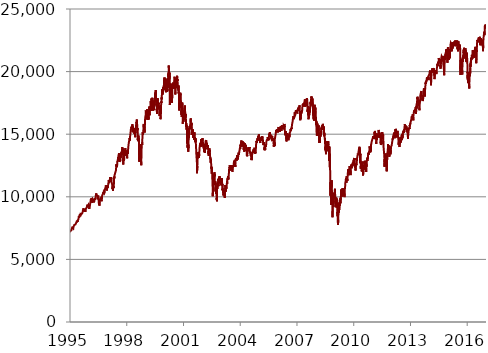
| Category | Series 0 |
|---|---|
| 1995-01-03 | 7172.683 |
| 1995-01-04 | 7190.548 |
| 1995-01-05 | 7191.054 |
| 1995-01-06 | 7201.079 |
| 1995-01-09 | 7208.079 |
| 1995-01-10 | 7220.305 |
| 1995-01-11 | 7222.76 |
| 1995-01-12 | 7222.839 |
| 1995-01-13 | 7284.208 |
| 1995-01-16 | 7338.687 |
| 1995-01-17 | 7361.699 |
| 1995-01-18 | 7356.045 |
| 1995-01-19 | 7310.672 |
| 1995-01-20 | 7278.697 |
| 1995-01-23 | 7275.497 |
| 1995-01-24 | 7288.911 |
| 1995-01-25 | 7303.149 |
| 1995-01-25 | 7310.466 |
| 1995-01-27 | 7331.988 |
| 1995-01-30 | 7302.151 |
| 1995-01-31 | 7334.776 |
| 1995-02-01 | 7310.312 |
| 1995-02-02 | 7349.527 |
| 1995-02-03 | 7437.83 |
| 1995-02-06 | 7478.464 |
| 1995-02-07 | 7478.527 |
| 1995-02-08 | 7486.398 |
| 1995-02-09 | 7480.373 |
| 1995-02-10 | 7503.419 |
| 1995-02-13 | 7498.907 |
| 1995-02-14 | 7509.996 |
| 1995-02-15 | 7541.813 |
| 1995-02-16 | 7543.911 |
| 1995-02-17 | 7499.948 |
| 1995-02-21 | 7501.668 |
| 1995-02-22 | 7530.029 |
| 1995-02-23 | 7564.275 |
| 1995-02-24 | 7578.614 |
| 1995-02-27 | 7516.006 |
| 1995-02-28 | 7577.715 |
| 1995-03-01 | 7529.735 |
| 1995-03-02 | 7523.729 |
| 1995-03-03 | 7527.487 |
| 1995-03-06 | 7522.078 |
| 1995-03-07 | 7467.209 |
| 1995-03-08 | 7481.185 |
| 1995-03-09 | 7484.487 |
| 1995-03-10 | 7570.125 |
| 1995-03-13 | 7577.53 |
| 1995-03-14 | 7617.322 |
| 1995-03-15 | 7608.769 |
| 1995-03-16 | 7651.8 |
| 1995-03-17 | 7647.273 |
| 1995-03-20 | 7654.961 |
| 1995-03-21 | 7642.304 |
| 1995-03-22 | 7641.801 |
| 1995-03-23 | 7648.829 |
| 1995-03-24 | 7721.48 |
| 1995-03-27 | 7755.88 |
| 1995-03-28 | 7767.357 |
| 1995-03-29 | 7757.688 |
| 1995-03-30 | 7755.849 |
| 1995-03-31 | 7735.882 |
| 1995-04-03 | 7721.042 |
| 1995-04-04 | 7754.968 |
| 1995-04-05 | 7763.383 |
| 1995-04-06 | 7765.797 |
| 1995-04-07 | 7768.978 |
| 1995-04-10 | 7782.909 |
| 1995-04-11 | 7775.857 |
| 1995-04-12 | 7798.422 |
| 1995-04-13 | 7830.703 |
| 1995-04-17 | 7793.69 |
| 1995-04-18 | 7770.686 |
| 1995-04-19 | 7744.767 |
| 1995-04-20 | 7757.679 |
| 1995-04-21 | 7804.58 |
| 1995-04-24 | 7857.013 |
| 1995-04-25 | 7848.253 |
| 1995-04-26 | 7859.05 |
| 1995-04-27 | 7875.394 |
| 1995-04-28 | 7891.362 |
| 1995-05-01 | 7868.004 |
| 1995-05-02 | 7873.399 |
| 1995-05-03 | 7944.934 |
| 1995-05-04 | 7941.415 |
| 1995-05-05 | 7935.269 |
| 1995-05-08 | 7984.298 |
| 1995-05-09 | 7985.549 |
| 1995-05-10 | 8003.957 |
| 1995-05-11 | 8013.074 |
| 1995-05-12 | 8038.723 |
| 1995-05-15 | 8072.097 |
| 1995-05-16 | 8087.956 |
| 1995-05-17 | 8073.286 |
| 1995-05-18 | 7970.473 |
| 1995-05-19 | 7961.715 |
| 1995-05-22 | 8021.16 |
| 1995-05-23 | 8089.222 |
| 1995-05-24 | 8092.475 |
| 1995-05-25 | 8086.611 |
| 1995-05-26 | 8021.989 |
| 1995-05-30 | 8007.663 |
| 1995-05-31 | 8121.205 |
| 1995-06-01 | 8120.213 |
| 1995-06-02 | 8120.993 |
| 1995-06-05 | 8171.362 |
| 1995-06-06 | 8170.863 |
| 1995-06-07 | 8144.266 |
| 1995-06-08 | 8139.895 |
| 1995-06-09 | 8080.349 |
| 1995-06-12 | 8122.82 |
| 1995-06-13 | 8194.323 |
| 1995-06-14 | 8203.937 |
| 1995-06-15 | 8223.682 |
| 1995-06-16 | 8261.268 |
| 1995-06-19 | 8332.771 |
| 1995-06-20 | 8336.813 |
| 1995-06-21 | 8332.365 |
| 1995-06-22 | 8429.981 |
| 1995-06-23 | 8412.484 |
| 1995-06-26 | 8328.806 |
| 1995-06-27 | 8301.663 |
| 1995-06-28 | 8324.155 |
| 1995-06-29 | 8324.233 |
| 1995-06-30 | 8348.676 |
| 1995-07-03 | 8377.177 |
| 1995-07-05 | 8391.943 |
| 1995-07-06 | 8484.798 |
| 1995-07-07 | 8540.599 |
| 1995-07-10 | 8554.054 |
| 1995-07-11 | 8524.007 |
| 1995-07-12 | 8618.408 |
| 1995-07-13 | 8624.62 |
| 1995-07-14 | 8613.117 |
| 1995-07-17 | 8651.092 |
| 1995-07-18 | 8585.286 |
| 1995-07-19 | 8445.153 |
| 1995-07-20 | 8489.216 |
| 1995-07-21 | 8504.777 |
| 1995-07-24 | 8558.814 |
| 1995-07-25 | 8630.817 |
| 1995-07-26 | 8646.488 |
| 1995-07-27 | 8709.375 |
| 1995-07-28 | 8685.025 |
| 1995-07-31 | 8681.279 |
| 1995-08-01 | 8618.886 |
| 1995-08-02 | 8603.458 |
| 1995-08-03 | 8594.538 |
| 1995-08-04 | 8603.832 |
| 1995-08-07 | 8625.409 |
| 1995-08-08 | 8629.706 |
| 1995-08-09 | 8629.908 |
| 1995-08-10 | 8605.591 |
| 1995-08-11 | 8578.986 |
| 1995-08-14 | 8638.252 |
| 1995-08-15 | 8630.671 |
| 1995-08-16 | 8668.983 |
| 1995-08-17 | 8671.988 |
| 1995-08-18 | 8680.534 |
| 1995-08-21 | 8665.216 |
| 1995-08-22 | 8678.495 |
| 1995-08-23 | 8657.883 |
| 1995-08-24 | 8654.318 |
| 1995-08-25 | 8687.229 |
| 1995-08-28 | 8666.897 |
| 1995-08-29 | 8663.815 |
| 1995-08-30 | 8694.312 |
| 1995-08-31 | 8721.493 |
| 1995-09-01 | 8735.536 |
| 1995-09-05 | 8816.034 |
| 1995-09-06 | 8847.513 |
| 1995-09-07 | 8856.214 |
| 1995-09-08 | 8897.869 |
| 1995-09-11 | 8925.355 |
| 1995-09-12 | 8957.128 |
| 1995-09-13 | 8978.119 |
| 1995-09-14 | 9038.699 |
| 1995-09-15 | 9019.697 |
| 1995-09-18 | 9011.571 |
| 1995-09-19 | 9041.34 |
| 1995-09-20 | 9078.847 |
| 1995-09-21 | 9035.156 |
| 1995-09-22 | 9000.804 |
| 1995-09-25 | 8985.686 |
| 1995-09-26 | 8972.697 |
| 1995-09-27 | 8945.506 |
| 1995-09-28 | 9023.566 |
| 1995-09-29 | 9021.919 |
| 1995-10-02 | 8939.016 |
| 1995-10-03 | 8926.333 |
| 1995-10-04 | 8888.22 |
| 1995-10-05 | 8910.459 |
| 1995-10-06 | 8916.112 |
| 1995-10-09 | 8822.185 |
| 1995-10-10 | 8796.043 |
| 1995-10-11 | 8853.623 |
| 1995-10-12 | 8919.472 |
| 1995-10-13 | 8959.227 |
| 1995-10-16 | 8940.705 |
| 1995-10-17 | 8993.096 |
| 1995-10-18 | 9013.724 |
| 1995-10-19 | 9043.722 |
| 1995-10-20 | 8995.419 |
| 1995-10-23 | 8952.769 |
| 1995-10-24 | 8972.205 |
| 1995-10-25 | 8902.236 |
| 1995-10-26 | 8809.95 |
| 1995-10-27 | 8851.47 |
| 1995-10-30 | 8908.028 |
| 1995-10-31 | 8890.729 |
| 1995-11-01 | 8929.649 |
| 1995-11-02 | 9023.994 |
| 1995-11-03 | 9053.066 |
| 1995-11-06 | 9034.888 |
| 1995-11-07 | 8988.305 |
| 1995-11-08 | 9055.096 |
| 1995-11-09 | 9090.584 |
| 1995-11-10 | 9086.833 |
| 1995-11-13 | 9072.7 |
| 1995-11-14 | 9016.602 |
| 1995-11-15 | 9061.605 |
| 1995-11-16 | 9113.891 |
| 1995-11-17 | 9155.112 |
| 1995-11-20 | 9101.431 |
| 1995-11-21 | 9123.266 |
| 1995-11-22 | 9103.384 |
| 1995-11-24 | 9131.666 |
| 1995-11-27 | 9149.719 |
| 1995-11-28 | 9222.88 |
| 1995-11-29 | 9257.686 |
| 1995-11-30 | 9251.58 |
| 1995-12-01 | 9274.06 |
| 1995-12-04 | 9371.707 |
| 1995-12-05 | 9417.499 |
| 1995-12-06 | 9433.006 |
| 1995-12-07 | 9373.49 |
| 1995-12-08 | 9392.765 |
| 1995-12-11 | 9418.243 |
| 1995-12-12 | 9394.719 |
| 1995-12-13 | 9435.192 |
| 1995-12-14 | 9357.735 |
| 1995-12-15 | 9337.033 |
| 1995-12-18 | 9173.839 |
| 1995-12-19 | 9259.173 |
| 1995-12-20 | 9215.831 |
| 1995-12-21 | 9286.233 |
| 1995-12-22 | 9308.78 |
| 1995-12-26 | 9346.539 |
| 1995-12-27 | 9351.843 |
| 1995-12-28 | 9349.501 |
| 1995-12-29 | 9392.843 |
| 1996-01-02 | 9398.077 |
| 1996-01-03 | 9397.738 |
| 1996-01-04 | 9317.757 |
| 1996-01-05 | 9306.041 |
| 1996-01-08 | 9325.682 |
| 1996-01-09 | 9183.603 |
| 1996-01-10 | 9018.97 |
| 1996-01-11 | 9101.633 |
| 1996-01-12 | 9091.905 |
| 1996-01-15 | 9048.6 |
| 1996-01-16 | 9135.519 |
| 1996-01-17 | 9129.383 |
| 1996-01-18 | 9163.592 |
| 1996-01-19 | 9222.745 |
| 1996-01-22 | 9255.768 |
| 1996-01-23 | 9253.486 |
| 1996-01-24 | 9355.035 |
| 1996-01-25 | 9317.218 |
| 1996-01-25 | 9381.15 |
| 1996-01-29 | 9413.263 |
| 1996-01-30 | 9499.102 |
| 1996-01-31 | 9576.462 |
| 1996-02-01 | 9589.253 |
| 1996-02-02 | 9566.295 |
| 1996-02-05 | 9629.284 |
| 1996-02-06 | 9697.097 |
| 1996-02-07 | 9731.903 |
| 1996-02-08 | 9811.287 |
| 1996-02-09 | 9820.323 |
| 1996-02-12 | 9874.491 |
| 1996-02-13 | 9853.592 |
| 1996-02-14 | 9812.133 |
| 1996-02-15 | 9779.217 |
| 1996-02-16 | 9747.562 |
| 1996-02-20 | 9643.698 |
| 1996-02-21 | 9746.332 |
| 1996-02-22 | 9910.541 |
| 1996-02-23 | 9901.198 |
| 1996-02-26 | 9806.877 |
| 1996-02-27 | 9764.434 |
| 1996-02-28 | 9745.748 |
| 1996-02-29 | 9692.195 |
| 1996-03-01 | 9674.592 |
| 1996-03-04 | 9748.661 |
| 1996-03-05 | 9816.142 |
| 1996-03-06 | 9786.575 |
| 1996-03-07 | 9803.208 |
| 1996-03-08 | 9518.534 |
| 1996-03-11 | 9616.361 |
| 1996-03-12 | 9567.379 |
| 1996-03-13 | 9598.581 |
| 1996-03-14 | 9641.494 |
| 1996-03-15 | 9655.054 |
| 1996-03-18 | 9806.113 |
| 1996-03-19 | 9794.479 |
| 1996-03-20 | 9767.74 |
| 1996-03-21 | 9758.675 |
| 1996-03-22 | 9776.684 |
| 1996-03-25 | 9755.48 |
| 1996-03-26 | 9781.591 |
| 1996-03-27 | 9744.671 |
| 1996-03-28 | 9752.514 |
| 1996-03-29 | 9732.043 |
| 1996-04-01 | 9796.917 |
| 1996-04-02 | 9821.36 |
| 1996-04-03 | 9831.137 |
| 1996-04-04 | 9840.457 |
| 1996-04-08 | 9674.993 |
| 1996-04-09 | 9666.937 |
| 1996-04-10 | 9560.44 |
| 1996-04-11 | 9503.178 |
| 1996-04-12 | 9574.862 |
| 1996-04-15 | 9657.129 |
| 1996-04-16 | 9705.543 |
| 1996-04-17 | 9663.922 |
| 1996-04-18 | 9705.116 |
| 1996-04-19 | 9735.361 |
| 1996-04-22 | 9785.922 |
| 1996-04-23 | 9849.793 |
| 1996-04-24 | 9847.904 |
| 1996-04-25 | 9890.79 |
| 1996-04-26 | 9910.694 |
| 1996-04-29 | 9920.791 |
| 1996-04-30 | 9921.446 |
| 1996-05-01 | 9924.646 |
| 1996-05-02 | 9772.419 |
| 1996-05-03 | 9760.259 |
| 1996-05-06 | 9747.141 |
| 1996-05-07 | 9707.47 |
| 1996-05-08 | 9766.81 |
| 1996-05-09 | 9785.673 |
| 1996-05-10 | 9889.96 |
| 1996-05-13 | 10023.263 |
| 1996-05-14 | 10093.806 |
| 1996-05-15 | 10094.946 |
| 1996-05-16 | 10095.448 |
| 1996-05-17 | 10155.473 |
| 1996-05-20 | 10213.035 |
| 1996-05-21 | 10203.474 |
| 1996-05-22 | 10270.794 |
| 1996-05-23 | 10241.443 |
| 1996-05-24 | 10273.166 |
| 1996-05-28 | 10178.972 |
| 1996-05-29 | 10116.865 |
| 1996-05-30 | 10166.31 |
| 1996-05-31 | 10149.529 |
| 1996-06-03 | 10122.424 |
| 1996-06-04 | 10182.41 |
| 1996-06-05 | 10254.731 |
| 1996-06-06 | 10184.385 |
| 1996-06-07 | 10168.542 |
| 1996-06-10 | 10156.222 |
| 1996-06-11 | 10142.627 |
| 1996-06-12 | 10133.877 |
| 1996-06-13 | 10107.249 |
| 1996-06-14 | 10069.532 |
| 1996-06-17 | 10050.498 |
| 1996-06-18 | 9978.238 |
| 1996-06-19 | 9958.126 |
| 1996-06-20 | 9932.349 |
| 1996-06-21 | 9987.884 |
| 1996-06-24 | 10021.029 |
| 1996-06-25 | 10005.976 |
| 1996-06-26 | 9919.315 |
| 1996-06-27 | 9974.319 |
| 1996-06-28 | 10044.954 |
| 1996-07-01 | 10107.691 |
| 1996-07-02 | 10082.053 |
| 1996-07-03 | 10050.533 |
| 1996-07-05 | 9852.042 |
| 1996-07-08 | 9762.879 |
| 1996-07-09 | 9794.779 |
| 1996-07-10 | 9777.101 |
| 1996-07-11 | 9604.202 |
| 1996-07-12 | 9595.788 |
| 1996-07-15 | 9340.261 |
| 1996-07-16 | 9288.47 |
| 1996-07-17 | 9425.649 |
| 1996-07-18 | 9575.305 |
| 1996-07-19 | 9506.215 |
| 1996-07-22 | 9414.202 |
| 1996-07-23 | 9295.672 |
| 1996-07-24 | 9247.338 |
| 1996-07-25 | 9345.385 |
| 1996-07-26 | 9430.697 |
| 1996-07-29 | 9361.547 |
| 1996-07-30 | 9405.59 |
| 1996-07-31 | 9471.253 |
| 1996-08-01 | 9596.417 |
| 1996-08-02 | 9778.837 |
| 1996-08-05 | 9749.208 |
| 1996-08-06 | 9783.74 |
| 1996-08-07 | 9821.207 |
| 1996-08-08 | 9805.894 |
| 1996-08-09 | 9796.572 |
| 1996-08-12 | 9820.027 |
| 1996-08-13 | 9758.469 |
| 1996-08-14 | 9790.489 |
| 1996-08-15 | 9809.359 |
| 1996-08-16 | 9840.743 |
| 1996-08-19 | 9854.937 |
| 1996-08-20 | 9842.907 |
| 1996-08-21 | 9830.847 |
| 1996-08-22 | 9914.407 |
| 1996-08-23 | 9880.148 |
| 1996-08-26 | 9844.284 |
| 1996-08-27 | 9889.817 |
| 1996-08-28 | 9887.653 |
| 1996-08-29 | 9797.056 |
| 1996-08-30 | 9736.149 |
| 1996-09-03 | 9721.379 |
| 1996-09-04 | 9736.644 |
| 1996-09-05 | 9645.927 |
| 1996-09-06 | 9729.027 |
| 1996-09-09 | 9828.222 |
| 1996-09-10 | 9838.177 |
| 1996-09-11 | 9877.427 |
| 1996-09-12 | 9935.094 |
| 1996-09-13 | 10062.934 |
| 1996-09-16 | 10110.48 |
| 1996-09-17 | 10109.318 |
| 1996-09-18 | 10087.144 |
| 1996-09-19 | 10109.137 |
| 1996-09-20 | 10161.118 |
| 1996-09-23 | 10142.504 |
| 1996-09-24 | 10141.946 |
| 1996-09-25 | 10159.097 |
| 1996-09-26 | 10180.622 |
| 1996-09-27 | 10188.466 |
| 1996-09-30 | 10205.541 |
| 1996-10-01 | 10184.629 |
| 1996-10-02 | 10255.783 |
| 1996-10-03 | 10242.235 |
| 1996-10-04 | 10353.657 |
| 1996-10-07 | 10371.4 |
| 1996-10-08 | 10328.591 |
| 1996-10-09 | 10274.037 |
| 1996-10-10 | 10249.858 |
| 1996-10-11 | 10324.621 |
| 1996-10-14 | 10370.167 |
| 1996-10-15 | 10362.423 |
| 1996-10-16 | 10369.355 |
| 1996-10-17 | 10398.677 |
| 1996-10-18 | 10441.185 |
| 1996-10-21 | 10416.555 |
| 1996-10-22 | 10345.642 |
| 1996-10-23 | 10346.153 |
| 1996-10-24 | 10291.164 |
| 1996-10-25 | 10276.549 |
| 1996-10-28 | 10213.815 |
| 1996-10-29 | 10244.686 |
| 1996-10-30 | 10237.769 |
| 1996-10-31 | 10302.141 |
| 1996-11-01 | 10268.336 |
| 1996-11-04 | 10297.377 |
| 1996-11-05 | 10386.136 |
| 1996-11-06 | 10526.643 |
| 1996-11-07 | 10574.55 |
| 1996-11-08 | 10610.675 |
| 1996-11-11 | 10629.795 |
| 1996-11-12 | 10607.283 |
| 1996-11-13 | 10630.5 |
| 1996-11-14 | 10687.667 |
| 1996-11-15 | 10698.158 |
| 1996-11-18 | 10683.6 |
| 1996-11-19 | 10736.744 |
| 1996-11-20 | 10768.201 |
| 1996-11-21 | 10740.886 |
| 1996-11-22 | 10821.856 |
| 1996-11-25 | 10925.113 |
| 1996-11-26 | 10915.597 |
| 1996-11-27 | 10910.284 |
| 1996-11-29 | 10944.263 |
| 1996-12-02 | 10949.381 |
| 1996-12-03 | 10881.679 |
| 1996-12-04 | 10835.543 |
| 1996-12-05 | 10834.763 |
| 1996-12-06 | 10758.581 |
| 1996-12-09 | 10901.685 |
| 1996-12-10 | 10881.469 |
| 1996-12-11 | 10772.764 |
| 1996-12-12 | 10643.227 |
| 1996-12-13 | 10614.892 |
| 1996-12-16 | 10503.711 |
| 1996-12-17 | 10548 |
| 1996-12-18 | 10630.711 |
| 1996-12-19 | 10809.684 |
| 1996-12-20 | 10839.926 |
| 1996-12-23 | 10808.288 |
| 1996-12-24 | 10853.958 |
| 1996-12-26 | 10912.386 |
| 1996-12-27 | 10939.31 |
| 1996-12-30 | 10917.308 |
| 1996-12-31 | 10803.381 |
| 1997-01-02 | 10693.891 |
| 1997-01-03 | 10836.739 |
| 1997-01-06 | 10851.94 |
| 1997-01-07 | 10920.327 |
| 1997-01-08 | 10876.176 |
| 1997-01-09 | 10960.407 |
| 1997-01-10 | 11015.449 |
| 1997-01-13 | 11011.44 |
| 1997-01-14 | 11128.241 |
| 1997-01-15 | 11110.811 |
| 1997-01-16 | 11142.499 |
| 1997-01-17 | 11223.558 |
| 1997-01-20 | 11243.112 |
| 1997-01-21 | 11322.002 |
| 1997-01-22 | 11362.726 |
| 1997-01-23 | 11273.932 |
| 1997-01-24 | 11171.763 |
| 1997-01-27 | 11091.137 |
| 1997-01-28 | 11093.546 |
| 1997-01-29 | 11167.065 |
| 1997-01-30 | 11305.784 |
| 1997-01-31 | 11334.21 |
| 1997-02-03 | 11315.063 |
| 1997-02-04 | 11323.833 |
| 1997-02-05 | 11183.221 |
| 1997-02-06 | 11203.385 |
| 1997-02-07 | 11309.336 |
| 1997-02-10 | 11249.426 |
| 1997-02-11 | 11277.002 |
| 1997-02-12 | 11452.11 |
| 1997-02-13 | 11569.544 |
| 1997-02-14 | 11540.417 |
| 1997-02-18 | 11622.013 |
| 1997-02-19 | 11592.99 |
| 1997-02-20 | 11464.936 |
| 1997-02-21 | 11437.658 |
| 1997-02-24 | 11524.817 |
| 1997-02-25 | 11554.884 |
| 1997-02-26 | 11472.408 |
| 1997-02-27 | 11338.672 |
| 1997-02-28 | 11274.288 |
| 1997-03-03 | 11293.857 |
| 1997-03-04 | 11266.915 |
| 1997-03-05 | 11394.083 |
| 1997-03-06 | 11365.504 |
| 1997-03-07 | 11436.08 |
| 1997-03-10 | 11540.1 |
| 1997-03-11 | 11516.46 |
| 1997-03-12 | 11418.481 |
| 1997-03-13 | 11236.744 |
| 1997-03-14 | 11278.102 |
| 1997-03-17 | 11271.765 |
| 1997-03-18 | 11184.333 |
| 1997-03-19 | 11110.945 |
| 1997-03-20 | 11089.046 |
| 1997-03-21 | 11110.201 |
| 1997-03-24 | 11159.845 |
| 1997-03-25 | 11153.716 |
| 1997-03-26 | 11183.574 |
| 1997-03-27 | 10974.479 |
| 1997-03-31 | 10731.523 |
| 1997-04-01 | 10731.335 |
| 1997-04-02 | 10609.868 |
| 1997-04-03 | 10605.321 |
| 1997-04-04 | 10718.765 |
| 1997-04-07 | 10806.474 |
| 1997-04-08 | 10855.15 |
| 1997-04-09 | 10799.951 |
| 1997-04-10 | 10754.677 |
| 1997-04-11 | 10489.961 |
| 1997-04-14 | 10545.769 |
| 1997-04-15 | 10676.478 |
| 1997-04-16 | 10761.899 |
| 1997-04-17 | 10747.887 |
| 1997-04-18 | 10801.244 |
| 1997-04-21 | 10696.418 |
| 1997-04-22 | 10847.037 |
| 1997-04-23 | 10841.985 |
| 1997-04-24 | 10824.17 |
| 1997-04-25 | 10722.554 |
| 1997-04-28 | 10808.316 |
| 1997-04-29 | 11068.679 |
| 1997-04-30 | 11172.435 |
| 1997-05-01 | 11169.17 |
| 1997-05-02 | 11382.223 |
| 1997-05-05 | 11622.484 |
| 1997-05-06 | 11597.15 |
| 1997-05-07 | 11458.464 |
| 1997-05-08 | 11515.601 |
| 1997-05-09 | 11568.678 |
| 1997-05-12 | 11724.447 |
| 1997-05-13 | 11669.942 |
| 1997-05-14 | 11707.616 |
| 1997-05-15 | 11781.479 |
| 1997-05-16 | 11644.949 |
| 1997-05-19 | 11687.56 |
| 1997-05-20 | 11785.924 |
| 1997-05-21 | 11784.497 |
| 1997-05-22 | 11742.897 |
| 1997-05-23 | 11894.592 |
| 1997-05-27 | 11933.664 |
| 1997-05-28 | 11913.518 |
| 1997-05-29 | 11895.558 |
| 1997-05-30 | 11951.357 |
| 1997-06-02 | 11945.295 |
| 1997-06-03 | 11929.14 |
| 1997-06-04 | 11870.352 |
| 1997-06-05 | 11918.716 |
| 1997-06-06 | 12087.401 |
| 1997-06-09 | 12146.916 |
| 1997-06-10 | 12168.492 |
| 1997-06-11 | 12216.559 |
| 1997-06-12 | 12375.563 |
| 1997-06-13 | 12487.985 |
| 1997-06-16 | 12502.716 |
| 1997-06-17 | 12524.366 |
| 1997-06-18 | 12472.008 |
| 1997-06-19 | 12598.21 |
| 1997-06-20 | 12598.73 |
| 1997-06-23 | 12369.282 |
| 1997-06-24 | 12563.612 |
| 1997-06-25 | 12483.932 |
| 1997-06-26 | 12420.333 |
| 1997-06-27 | 12472.884 |
| 1997-06-30 | 12468.592 |
| 1997-07-01 | 12519.14 |
| 1997-07-02 | 12667.565 |
| 1997-07-03 | 12812.653 |
| 1997-07-07 | 12770.415 |
| 1997-07-08 | 12858.776 |
| 1997-07-09 | 12741.555 |
| 1997-07-10 | 12817.013 |
| 1997-07-11 | 12876.958 |
| 1997-07-14 | 12904.246 |
| 1997-07-15 | 12997.027 |
| 1997-07-16 | 13155.58 |
| 1997-07-17 | 13084.838 |
| 1997-07-18 | 12899.323 |
| 1997-07-21 | 12854.074 |
| 1997-07-22 | 13101.449 |
| 1997-07-23 | 13145.273 |
| 1997-07-24 | 13190.996 |
| 1997-07-25 | 13178.019 |
| 1997-07-28 | 13151.665 |
| 1997-07-29 | 13219.396 |
| 1997-07-30 | 13358.448 |
| 1997-07-31 | 13394.145 |
| 1997-08-01 | 13289.442 |
| 1997-08-04 | 13330.121 |
| 1997-08-05 | 13382.642 |
| 1997-08-06 | 13486.084 |
| 1997-08-07 | 13377.549 |
| 1997-08-08 | 13147.719 |
| 1997-08-11 | 13159.946 |
| 1997-08-12 | 13050.109 |
| 1997-08-13 | 13004.027 |
| 1997-08-14 | 13037.363 |
| 1997-08-15 | 12776.936 |
| 1997-08-18 | 12891.244 |
| 1997-08-19 | 13066.185 |
| 1997-08-20 | 13243.494 |
| 1997-08-21 | 13078.634 |
| 1997-08-22 | 13050.02 |
| 1997-08-25 | 13030.554 |
| 1997-08-26 | 12959.13 |
| 1997-08-27 | 12980.95 |
| 1997-08-28 | 12881.178 |
| 1997-08-29 | 12848.907 |
| 1997-09-02 | 13144.45 |
| 1997-09-03 | 13164.133 |
| 1997-09-04 | 13202.348 |
| 1997-09-05 | 13206.763 |
| 1997-09-08 | 13243.516 |
| 1997-09-09 | 13283.784 |
| 1997-09-10 | 13128.635 |
| 1997-09-11 | 13052.294 |
| 1997-09-12 | 13201.137 |
| 1997-09-15 | 13168.962 |
| 1997-09-16 | 13462.13 |
| 1997-09-17 | 13448.811 |
| 1997-09-18 | 13508.54 |
| 1997-09-19 | 13544.569 |
| 1997-09-22 | 13617.869 |
| 1997-09-23 | 13578.443 |
| 1997-09-24 | 13508.436 |
| 1997-09-25 | 13433.483 |
| 1997-09-26 | 13506.916 |
| 1997-09-29 | 13607.621 |
| 1997-09-30 | 13555.673 |
| 1997-10-01 | 13614.327 |
| 1997-10-02 | 13679.153 |
| 1997-10-03 | 13757.603 |
| 1997-10-06 | 13854.465 |
| 1997-10-07 | 13973.554 |
| 1997-10-08 | 13878.886 |
| 1997-10-09 | 13860.843 |
| 1997-10-10 | 13822.884 |
| 1997-10-13 | 13841.238 |
| 1997-10-14 | 13850.606 |
| 1997-10-15 | 13794.986 |
| 1997-10-16 | 13666.014 |
| 1997-10-17 | 13484.633 |
| 1997-10-20 | 13639 |
| 1997-10-21 | 13852.668 |
| 1997-10-22 | 13826.582 |
| 1997-10-23 | 13563.937 |
| 1997-10-24 | 13458.606 |
| 1997-10-27 | 12574.768 |
| 1997-10-28 | 13109.16 |
| 1997-10-29 | 13110.559 |
| 1997-10-30 | 12908.616 |
| 1997-10-31 | 13058.195 |
| 1997-11-03 | 13373.54 |
| 1997-11-04 | 13407.247 |
| 1997-11-05 | 13450.049 |
| 1997-11-06 | 13385.345 |
| 1997-11-07 | 13209.129 |
| 1997-11-10 | 13143.025 |
| 1997-11-11 | 13155.214 |
| 1997-11-12 | 12896.151 |
| 1997-11-13 | 13004.908 |
| 1997-11-14 | 13165.517 |
| 1997-11-17 | 13405.184 |
| 1997-11-18 | 13304.813 |
| 1997-11-19 | 13364.048 |
| 1997-11-20 | 13547.486 |
| 1997-11-21 | 13589.227 |
| 1997-11-24 | 13363.532 |
| 1997-11-25 | 13403.725 |
| 1997-11-26 | 13424.241 |
| 1997-11-28 | 13474.81 |
| 1997-12-01 | 13734.654 |
| 1997-12-02 | 13700.079 |
| 1997-12-03 | 13767.931 |
| 1997-12-04 | 13750.267 |
| 1997-12-05 | 13883.243 |
| 1997-12-08 | 13888.334 |
| 1997-12-09 | 13786.009 |
| 1997-12-10 | 13683.049 |
| 1997-12-11 | 13466.076 |
| 1997-12-12 | 13425.731 |
| 1997-12-15 | 13521.518 |
| 1997-12-16 | 13605.265 |
| 1997-12-17 | 13593.105 |
| 1997-12-18 | 13440.694 |
| 1997-12-19 | 13344.951 |
| 1997-12-22 | 13427.206 |
| 1997-12-23 | 13272.036 |
| 1997-12-24 | 13202.589 |
| 1997-12-26 | 13245.916 |
| 1997-12-29 | 13457.296 |
| 1997-12-30 | 13692.139 |
| 1997-12-31 | 13721.373 |
| 1998-01-02 | 13739.367 |
| 1998-01-05 | 13765.218 |
| 1998-01-06 | 13622.738 |
| 1998-01-07 | 13570.566 |
| 1998-01-08 | 13464.527 |
| 1998-01-09 | 13073.249 |
| 1998-01-12 | 13166.193 |
| 1998-01-13 | 13353.981 |
| 1998-01-14 | 13450.136 |
| 1998-01-15 | 13374.146 |
| 1998-01-16 | 13525.316 |
| 1998-01-20 | 13745.112 |
| 1998-01-21 | 13648.706 |
| 1998-01-22 | 13546.497 |
| 1998-01-23 | 13472.304 |
| 1998-01-25 | 13438.352 |
| 1998-01-27 | 13574.778 |
| 1998-01-28 | 13706.844 |
| 1998-01-29 | 13805.341 |
| 1998-01-30 | 13758.663 |
| 1998-02-02 | 14003.015 |
| 1998-02-03 | 14063.707 |
| 1998-02-04 | 14103.697 |
| 1998-02-05 | 14087.583 |
| 1998-02-06 | 14182.943 |
| 1998-02-09 | 14175.68 |
| 1998-02-10 | 14292.666 |
| 1998-02-11 | 14308.295 |
| 1998-02-12 | 14358.018 |
| 1998-02-13 | 14330.584 |
| 1998-02-17 | 14355.71 |
| 1998-02-18 | 14470.138 |
| 1998-02-19 | 14437.308 |
| 1998-02-20 | 14494.397 |
| 1998-02-23 | 14548.796 |
| 1998-02-24 | 14458.803 |
| 1998-02-25 | 14616.853 |
| 1998-02-26 | 14701.774 |
| 1998-02-27 | 14711.815 |
| 1998-03-02 | 14676.093 |
| 1998-03-03 | 14712.062 |
| 1998-03-04 | 14668.462 |
| 1998-03-05 | 14491.744 |
| 1998-03-06 | 14771.937 |
| 1998-03-09 | 14722.716 |
| 1998-03-10 | 14881.237 |
| 1998-03-11 | 14942.403 |
| 1998-03-12 | 14972.473 |
| 1998-03-13 | 14964.489 |
| 1998-03-16 | 15091.855 |
| 1998-03-17 | 15104.799 |
| 1998-03-18 | 15178.35 |
| 1998-03-19 | 15240.265 |
| 1998-03-20 | 15344.165 |
| 1998-03-23 | 15297.953 |
| 1998-03-24 | 15419.493 |
| 1998-03-25 | 15390.979 |
| 1998-03-26 | 15382.79 |
| 1998-03-27 | 15325.366 |
| 1998-03-30 | 15296.265 |
| 1998-03-31 | 15401.163 |
| 1998-04-01 | 15472.44 |
| 1998-04-02 | 15604.287 |
| 1998-04-03 | 15631.811 |
| 1998-04-06 | 15605.869 |
| 1998-04-07 | 15434.267 |
| 1998-04-08 | 15361.012 |
| 1998-04-09 | 15484.803 |
| 1998-04-13 | 15479.383 |
| 1998-04-14 | 15587.339 |
| 1998-04-15 | 15649.637 |
| 1998-04-16 | 15513 |
| 1998-04-17 | 15684.617 |
| 1998-04-20 | 15714.689 |
| 1998-04-21 | 15756.392 |
| 1998-04-22 | 15794.639 |
| 1998-04-23 | 15635.165 |
| 1998-04-24 | 15475.618 |
| 1998-04-27 | 15154.225 |
| 1998-04-28 | 15181.91 |
| 1998-04-29 | 15315.574 |
| 1998-04-30 | 15541.022 |
| 1998-05-01 | 15618.942 |
| 1998-05-04 | 15633.929 |
| 1998-05-05 | 15548.439 |
| 1998-05-06 | 15422.874 |
| 1998-05-07 | 15292.819 |
| 1998-05-08 | 15458.739 |
| 1998-05-11 | 15423.195 |
| 1998-05-12 | 15502.295 |
| 1998-05-13 | 15531.186 |
| 1998-05-14 | 15523.554 |
| 1998-05-15 | 15406.191 |
| 1998-05-18 | 15331.229 |
| 1998-05-19 | 15401.79 |
| 1998-05-20 | 15480.861 |
| 1998-05-21 | 15417.42 |
| 1998-05-22 | 15348.774 |
| 1998-05-26 | 15120.334 |
| 1998-05-27 | 15065.637 |
| 1998-05-28 | 15150.425 |
| 1998-05-29 | 15080.434 |
| 1998-06-01 | 15011.87 |
| 1998-06-02 | 15042.347 |
| 1998-06-03 | 14932.532 |
| 1998-06-04 | 15078.052 |
| 1998-06-05 | 15293.784 |
| 1998-06-08 | 15334.833 |
| 1998-06-09 | 15373.298 |
| 1998-06-10 | 15267.411 |
| 1998-06-11 | 15042.172 |
| 1998-06-12 | 15064.865 |
| 1998-06-15 | 14757.104 |
| 1998-06-16 | 14915.767 |
| 1998-06-17 | 15168.255 |
| 1998-06-18 | 15133.894 |
| 1998-06-19 | 15078.972 |
| 1998-06-22 | 15136.713 |
| 1998-06-23 | 15337.36 |
| 1998-06-24 | 15509.925 |
| 1998-06-25 | 15467.576 |
| 1998-06-26 | 15505.12 |
| 1998-06-29 | 15598.405 |
| 1998-06-30 | 15572.207 |
| 1998-07-01 | 15732.814 |
| 1998-07-02 | 15700.595 |
| 1998-07-06 | 15833.51 |
| 1998-07-07 | 15809.051 |
| 1998-07-08 | 15951.65 |
| 1998-07-09 | 15868.631 |
| 1998-07-10 | 15921.561 |
| 1998-07-13 | 15940.609 |
| 1998-07-14 | 16079.344 |
| 1998-07-15 | 16065.051 |
| 1998-07-16 | 16170.196 |
| 1998-07-17 | 16198.505 |
| 1998-07-20 | 16176.876 |
| 1998-07-21 | 15941.353 |
| 1998-07-22 | 15873.459 |
| 1998-07-23 | 15565.798 |
| 1998-07-24 | 15547.654 |
| 1998-07-27 | 15562.852 |
| 1998-07-28 | 15336.504 |
| 1998-07-29 | 15269.922 |
| 1998-07-30 | 15492.682 |
| 1998-07-31 | 15198.192 |
| 1998-08-03 | 15054.193 |
| 1998-08-04 | 14525.936 |
| 1998-08-05 | 14579.34 |
| 1998-08-06 | 14731.54 |
| 1998-08-07 | 14809.068 |
| 1998-08-10 | 14716.842 |
| 1998-08-11 | 14483.778 |
| 1998-08-12 | 14696.025 |
| 1998-08-13 | 14572.945 |
| 1998-08-14 | 14441.766 |
| 1998-08-17 | 14661.763 |
| 1998-08-18 | 14888.577 |
| 1998-08-19 | 14833.264 |
| 1998-08-20 | 14732.021 |
| 1998-08-21 | 14562.748 |
| 1998-08-24 | 14619.066 |
| 1998-08-25 | 14661.224 |
| 1998-08-26 | 14491.718 |
| 1998-08-27 | 13922.148 |
| 1998-08-28 | 13719.588 |
| 1998-08-31 | 12798.478 |
| 1998-09-01 | 13225.576 |
| 1998-09-02 | 13225.59 |
| 1998-09-03 | 13085.201 |
| 1998-09-04 | 12994.441 |
| 1998-09-08 | 13610.048 |
| 1998-09-09 | 13383.7 |
| 1998-09-10 | 13041.858 |
| 1998-09-11 | 13395.471 |
| 1998-09-14 | 13645.418 |
| 1998-09-15 | 13754.685 |
| 1998-09-16 | 13864.811 |
| 1998-09-17 | 13564.755 |
| 1998-09-18 | 13620.553 |
| 1998-09-21 | 13649.914 |
| 1998-09-22 | 13753.39 |
| 1998-09-23 | 14210.902 |
| 1998-09-24 | 13918.47 |
| 1998-09-25 | 13932.641 |
| 1998-09-28 | 13973.322 |
| 1998-09-29 | 13968.157 |
| 1998-09-30 | 13599.209 |
| 1998-10-01 | 13139.834 |
| 1998-10-02 | 13306.426 |
| 1998-10-05 | 13064.622 |
| 1998-10-06 | 12992.284 |
| 1998-10-07 | 12761.074 |
| 1998-10-08 | 12512.303 |
| 1998-10-09 | 12846.286 |
| 1998-10-12 | 13082.039 |
| 1998-10-13 | 13005.201 |
| 1998-10-14 | 13150.429 |
| 1998-10-15 | 13693.851 |
| 1998-10-16 | 13841.387 |
| 1998-10-19 | 13966.687 |
| 1998-10-20 | 14026.02 |
| 1998-10-21 | 14107.967 |
| 1998-10-22 | 14227.287 |
| 1998-10-23 | 14151.915 |
| 1998-10-26 | 14200.813 |
| 1998-10-27 | 14147.271 |
| 1998-10-28 | 14152.714 |
| 1998-10-29 | 14378.916 |
| 1998-10-30 | 14560.806 |
| 1998-11-02 | 14782.988 |
| 1998-11-03 | 14765.673 |
| 1998-11-04 | 14884.369 |
| 1998-11-05 | 15062.34 |
| 1998-11-06 | 15174.796 |
| 1998-11-09 | 15059.786 |
| 1998-11-10 | 15025.228 |
| 1998-11-11 | 14937.098 |
| 1998-11-12 | 14895.53 |
| 1998-11-13 | 14960.161 |
| 1998-11-16 | 15071.267 |
| 1998-11-17 | 15116.986 |
| 1998-11-18 | 15209.092 |
| 1998-11-19 | 15308.282 |
| 1998-11-20 | 15431.884 |
| 1998-11-23 | 15720.598 |
| 1998-11-24 | 15651.307 |
| 1998-11-25 | 15728.856 |
| 1998-11-27 | 15820.919 |
| 1998-11-30 | 15457.791 |
| 1998-12-01 | 15585.265 |
| 1998-12-02 | 15542.96 |
| 1998-12-03 | 15312.03 |
| 1998-12-04 | 15602.939 |
| 1998-12-07 | 15756.069 |
| 1998-12-08 | 15697.353 |
| 1998-12-09 | 15710.249 |
| 1998-12-10 | 15462.662 |
| 1998-12-11 | 15457.608 |
| 1998-12-14 | 15137.799 |
| 1998-12-15 | 15381.653 |
| 1998-12-16 | 15383.904 |
| 1998-12-17 | 15585.555 |
| 1998-12-18 | 15711.731 |
| 1998-12-21 | 15911.741 |
| 1998-12-22 | 15921.689 |
| 1998-12-23 | 16226.032 |
| 1998-12-24 | 16220.629 |
| 1998-12-28 | 16252.754 |
| 1998-12-29 | 16432.78 |
| 1998-12-30 | 16355.721 |
| 1998-12-31 | 16436.469 |
| 1999-01-04 | 16381.401 |
| 1999-01-05 | 16560.569 |
| 1999-01-06 | 16894.247 |
| 1999-01-07 | 16862.62 |
| 1999-01-08 | 16953.501 |
| 1999-01-11 | 16868.676 |
| 1999-01-12 | 16574.462 |
| 1999-01-13 | 16479.453 |
| 1999-01-14 | 16208.477 |
| 1999-01-15 | 16589.24 |
| 1999-01-19 | 16700.519 |
| 1999-01-20 | 16753.818 |
| 1999-01-21 | 16470.702 |
| 1999-01-22 | 16356.96 |
| 1999-01-25 | 16451.318 |
| 1999-01-25 | 16681.989 |
| 1999-01-27 | 16581.865 |
| 1999-01-28 | 16835.731 |
| 1999-01-29 | 16986.446 |
| 1999-02-01 | 16915.192 |
| 1999-02-02 | 16768.828 |
| 1999-02-03 | 16913.962 |
| 1999-02-04 | 16634.619 |
| 1999-02-05 | 16468.446 |
| 1999-02-08 | 16491.555 |
| 1999-02-09 | 16136.013 |
| 1999-02-10 | 16175.574 |
| 1999-02-11 | 16564.411 |
| 1999-02-12 | 16268.312 |
| 1999-02-16 | 16363.394 |
| 1999-02-17 | 16129.082 |
| 1999-02-18 | 16286.472 |
| 1999-02-19 | 16323.312 |
| 1999-02-22 | 16715.159 |
| 1999-02-23 | 16723.537 |
| 1999-02-24 | 16536.281 |
| 1999-02-25 | 16421.723 |
| 1999-02-26 | 16330.923 |
| 1999-03-01 | 16269.174 |
| 1999-03-02 | 16175.274 |
| 1999-03-03 | 16183.151 |
| 1999-03-04 | 16400.74 |
| 1999-03-05 | 16736.378 |
| 1999-03-08 | 16845.742 |
| 1999-03-09 | 16813.197 |
| 1999-03-10 | 16903.187 |
| 1999-03-11 | 17019.952 |
| 1999-03-12 | 16965.681 |
| 1999-03-15 | 17117.184 |
| 1999-03-16 | 17106.696 |
| 1999-03-17 | 17012.205 |
| 1999-03-18 | 17213.378 |
| 1999-03-19 | 17015.812 |
| 1999-03-22 | 16967.484 |
| 1999-03-23 | 16516.74 |
| 1999-03-24 | 16599.142 |
| 1999-03-25 | 16881.447 |
| 1999-03-26 | 16819.169 |
| 1999-03-29 | 17157.549 |
| 1999-03-30 | 17027.194 |
| 1999-03-31 | 16889.627 |
| 1999-04-01 | 16855.302 |
| 1999-04-05 | 17171.817 |
| 1999-04-06 | 17134.408 |
| 1999-04-07 | 17193.93 |
| 1999-04-08 | 17417.954 |
| 1999-04-09 | 17499.89 |
| 1999-04-12 | 17650.199 |
| 1999-04-13 | 17597.194 |
| 1999-04-14 | 17344.998 |
| 1999-04-15 | 17305.083 |
| 1999-04-16 | 17280.191 |
| 1999-04-19 | 16861.832 |
| 1999-04-20 | 17063.5 |
| 1999-04-21 | 17484.179 |
| 1999-04-22 | 17770.532 |
| 1999-04-23 | 17751.298 |
| 1999-04-26 | 17838.433 |
| 1999-04-27 | 17851.05 |
| 1999-04-28 | 17702.274 |
| 1999-04-29 | 17617.201 |
| 1999-04-30 | 17557.808 |
| 1999-05-03 | 17740.084 |
| 1999-05-04 | 17483.978 |
| 1999-05-05 | 17646.203 |
| 1999-05-06 | 17472.55 |
| 1999-05-07 | 17608.938 |
| 1999-05-10 | 17602.679 |
| 1999-05-11 | 17809.316 |
| 1999-05-12 | 17917.332 |
| 1999-05-13 | 17972.701 |
| 1999-05-14 | 17609.339 |
| 1999-05-17 | 17607.104 |
| 1999-05-18 | 17553.154 |
| 1999-05-19 | 17692.75 |
| 1999-05-20 | 17641.334 |
| 1999-05-21 | 17549.315 |
| 1999-05-24 | 17209.913 |
| 1999-05-25 | 16917.917 |
| 1999-05-26 | 17142.085 |
| 1999-05-27 | 16899.485 |
| 1999-05-28 | 17153.055 |
| 1999-06-01 | 17046.786 |
| 1999-06-02 | 17035.458 |
| 1999-06-03 | 17082.276 |
| 1999-06-04 | 17404.535 |
| 1999-06-07 | 17529.408 |
| 1999-06-08 | 17330.576 |
| 1999-06-09 | 17359.621 |
| 1999-06-10 | 17160.589 |
| 1999-06-11 | 17022.038 |
| 1999-06-14 | 16941.992 |
| 1999-06-15 | 17018.457 |
| 1999-06-16 | 17393.85 |
| 1999-06-17 | 17531.098 |
| 1999-06-18 | 17570.999 |
| 1999-06-21 | 17679.803 |
| 1999-06-22 | 17528.62 |
| 1999-06-23 | 17497.685 |
| 1999-06-24 | 17290.875 |
| 1999-06-25 | 17273.489 |
| 1999-06-28 | 17461.951 |
| 1999-06-29 | 17727.652 |
| 1999-06-30 | 18022.183 |
| 1999-07-01 | 18053.673 |
| 1999-07-02 | 18185.597 |
| 1999-07-06 | 18170.247 |
| 1999-07-07 | 18217.396 |
| 1999-07-08 | 18205.702 |
| 1999-07-09 | 18332.042 |
| 1999-07-12 | 18280.081 |
| 1999-07-13 | 18218.51 |
| 1999-07-14 | 18295.959 |
| 1999-07-15 | 18449.844 |
| 1999-07-16 | 18529.849 |
| 1999-07-19 | 18387.331 |
| 1999-07-20 | 18000.798 |
| 1999-07-21 | 18036.31 |
| 1999-07-22 | 17806.432 |
| 1999-07-23 | 17758.269 |
| 1999-07-26 | 17583.608 |
| 1999-07-27 | 17777.632 |
| 1999-07-28 | 17816.727 |
| 1999-07-29 | 17513.413 |
| 1999-07-30 | 17405.878 |
| 1999-08-02 | 17297.859 |
| 1999-08-03 | 17181.194 |
| 1999-08-04 | 16926.568 |
| 1999-08-05 | 17023.86 |
| 1999-08-06 | 16869.817 |
| 1999-08-09 | 16809.49 |
| 1999-08-10 | 16615.134 |
| 1999-08-11 | 16866.512 |
| 1999-08-12 | 16855.586 |
| 1999-08-13 | 17200.938 |
| 1999-08-16 | 17249.171 |
| 1999-08-17 | 17418.242 |
| 1999-08-18 | 17300.409 |
| 1999-08-19 | 17179.969 |
| 1999-08-20 | 17336.178 |
| 1999-08-23 | 17616.887 |
| 1999-08-24 | 17654.493 |
| 1999-08-25 | 17864.177 |
| 1999-08-26 | 17656.359 |
| 1999-08-27 | 17488.484 |
| 1999-08-30 | 17192.918 |
| 1999-08-31 | 17153.944 |
| 1999-09-01 | 17195.266 |
| 1999-09-02 | 17039.603 |
| 1999-09-03 | 17509.328 |
| 1999-09-07 | 17469.817 |
| 1999-09-08 | 17388.186 |
| 1999-09-09 | 17442.71 |
| 1999-09-10 | 17504.649 |
| 1999-09-13 | 17407.537 |
| 1999-09-14 | 17312.821 |
| 1999-09-15 | 17091.519 |
| 1999-09-16 | 17058.472 |
| 1999-09-17 | 17271.212 |
| 1999-09-20 | 17262.847 |
| 1999-09-21 | 16931.249 |
| 1999-09-22 | 17003.197 |
| 1999-09-23 | 16592.845 |
| 1999-09-24 | 16552.866 |
| 1999-09-27 | 16618.221 |
| 1999-09-28 | 16583.46 |
| 1999-09-29 | 16456.462 |
| 1999-09-30 | 16606.596 |
| 1999-10-01 | 16562.118 |
| 1999-10-04 | 16830.433 |
| 1999-10-05 | 16810.904 |
| 1999-10-06 | 17112.901 |
| 1999-10-07 | 17032.661 |
| 1999-10-08 | 17223.142 |
| 1999-10-11 | 17260.927 |
| 1999-10-12 | 17006.89 |
| 1999-10-13 | 16634.857 |
| 1999-10-14 | 16629.904 |
| 1999-10-15 | 16198.844 |
| 1999-10-18 | 16212.147 |
| 1999-10-19 | 16323.096 |
| 1999-10-20 | 16650.566 |
| 1999-10-21 | 16585.185 |
| 1999-10-22 | 16805.385 |
| 1999-10-25 | 16734.627 |
| 1999-10-26 | 16609.526 |
| 1999-10-27 | 16773.162 |
| 1999-10-28 | 17306.354 |
| 1999-10-29 | 17617.973 |
| 1999-11-01 | 17542.163 |
| 1999-11-02 | 17494.359 |
| 1999-11-03 | 17610.758 |
| 1999-11-04 | 17728.289 |
| 1999-11-05 | 17847.516 |
| 1999-11-08 | 17946.236 |
| 1999-11-09 | 17797.449 |
| 1999-11-10 | 17896.311 |
| 1999-11-11 | 17958.923 |
| 1999-11-12 | 18163.321 |
| 1999-11-15 | 18166.376 |
| 1999-11-16 | 18496.522 |
| 1999-11-17 | 18390.136 |
| 1999-11-18 | 18595.977 |
| 1999-11-19 | 18564.65 |
| 1999-11-22 | 18567.125 |
| 1999-11-23 | 18331.852 |
| 1999-11-24 | 18497.724 |
| 1999-11-26 | 18530.027 |
| 1999-11-29 | 18412.059 |
| 1999-11-30 | 18176.814 |
| 1999-12-01 | 18277.966 |
| 1999-12-02 | 18481.304 |
| 1999-12-03 | 18783.743 |
| 1999-12-06 | 18697.201 |
| 1999-12-07 | 18615.622 |
| 1999-12-08 | 18588.298 |
| 1999-12-09 | 18646.158 |
| 1999-12-10 | 18746.73 |
| 1999-12-13 | 18735.699 |
| 1999-12-14 | 18511.712 |
| 1999-12-15 | 18602.95 |
| 1999-12-16 | 18703.608 |
| 1999-12-17 | 18741.285 |
| 1999-12-20 | 18737.848 |
| 1999-12-21 | 18970.632 |
| 1999-12-22 | 19055.676 |
| 1999-12-23 | 19309.561 |
| 1999-12-27 | 19272.421 |
| 1999-12-28 | 19308.614 |
| 1999-12-29 | 19424.56 |
| 1999-12-30 | 19429.524 |
| 1999-12-31 | 19535.613 |
| 2000-01-03 | 19333.617 |
| 2000-01-04 | 18569.351 |
| 2000-01-05 | 18583.523 |
| 2000-01-06 | 18521.054 |
| 2000-01-07 | 19032.623 |
| 2000-01-10 | 19350.877 |
| 2000-01-11 | 19053.662 |
| 2000-01-12 | 18933.307 |
| 2000-01-13 | 19224.698 |
| 2000-01-14 | 19453.253 |
| 2000-01-18 | 19402.586 |
| 2000-01-19 | 19470.555 |
| 2000-01-20 | 19423.146 |
| 2000-01-21 | 19450.559 |
| 2000-01-24 | 18942.938 |
| 2000-01-25 | 19047.063 |
| 2000-01-25 | 18968.927 |
| 2000-01-27 | 18889.748 |
| 2000-01-28 | 18356.59 |
| 2000-01-31 | 18656.977 |
| 2000-02-01 | 18774.422 |
| 2000-02-02 | 18807.421 |
| 2000-02-03 | 19073.306 |
| 2000-02-04 | 19070.292 |
| 2000-02-07 | 19125.104 |
| 2000-02-08 | 19364.439 |
| 2000-02-09 | 19001.252 |
| 2000-02-10 | 19109.516 |
| 2000-02-11 | 18764.371 |
| 2000-02-14 | 18810.253 |
| 2000-02-15 | 18928.553 |
| 2000-02-16 | 18815.664 |
| 2000-02-17 | 18900.601 |
| 2000-02-18 | 18398.17 |
| 2000-02-22 | 18434.127 |
| 2000-02-23 | 18636.748 |
| 2000-02-24 | 18623.276 |
| 2000-02-25 | 18423.908 |
| 2000-02-28 | 18586.618 |
| 2000-02-29 | 18940.146 |
| 2000-03-01 | 19038.726 |
| 2000-03-02 | 19037.252 |
| 2000-03-03 | 19464.512 |
| 2000-03-06 | 19294.874 |
| 2000-03-07 | 18886.675 |
| 2000-03-08 | 19003.438 |
| 2000-03-09 | 19474.009 |
| 2000-03-10 | 19398.442 |
| 2000-03-13 | 19135.204 |
| 2000-03-14 | 18715.73 |
| 2000-03-15 | 18921.17 |
| 2000-03-16 | 19746.104 |
| 2000-03-17 | 19845.473 |
| 2000-03-20 | 19539.175 |
| 2000-03-21 | 19946.525 |
| 2000-03-22 | 20189.826 |
| 2000-03-23 | 20486.03 |
| 2000-03-24 | 20510.208 |
| 2000-03-27 | 20443.818 |
| 2000-03-28 | 20172.182 |
| 2000-03-29 | 19999.957 |
| 2000-03-30 | 19651.364 |
| 2000-03-31 | 19876.951 |
| 2000-04-03 | 19622.814 |
| 2000-04-04 | 19392.329 |
| 2000-04-05 | 19382.282 |
| 2000-04-06 | 19657.581 |
| 2000-04-07 | 19927.794 |
| 2000-04-10 | 19569.316 |
| 2000-04-11 | 19415.729 |
| 2000-04-12 | 18878.915 |
| 2000-04-13 | 18530.345 |
| 2000-04-14 | 17334.229 |
| 2000-04-17 | 17855.049 |
| 2000-04-18 | 18521.341 |
| 2000-04-19 | 18371.908 |
| 2000-04-20 | 18410.843 |
| 2000-04-24 | 18240.067 |
| 2000-04-25 | 18909.124 |
| 2000-04-26 | 18688.518 |
| 2000-04-27 | 18821.999 |
| 2000-04-28 | 18816.955 |
| 2000-05-01 | 19051.946 |
| 2000-05-02 | 18678.702 |
| 2000-05-03 | 18291.94 |
| 2000-05-04 | 18295.437 |
| 2000-05-05 | 18578.673 |
| 2000-05-08 | 18409.9 |
| 2000-05-09 | 18208.719 |
| 2000-05-10 | 17750.312 |
| 2000-05-11 | 18100.613 |
| 2000-05-12 | 18252.911 |
| 2000-05-15 | 18650.596 |
| 2000-05-16 | 18877.843 |
| 2000-05-17 | 18622.782 |
| 2000-05-18 | 18432.621 |
| 2000-05-19 | 18016.435 |
| 2000-05-22 | 17895.129 |
| 2000-05-23 | 17502.815 |
| 2000-05-24 | 17771.464 |
| 2000-05-25 | 17552.725 |
| 2000-05-26 | 17511.642 |
| 2000-05-30 | 18155.062 |
| 2000-05-31 | 18116.671 |
| 2000-06-01 | 18457.219 |
| 2000-06-02 | 18962.911 |
| 2000-06-05 | 18886.186 |
| 2000-06-06 | 18840.264 |
| 2000-06-07 | 18950.443 |
| 2000-06-08 | 18840.264 |
| 2000-06-09 | 18839.38 |
| 2000-06-12 | 18627.237 |
| 2000-06-13 | 18898.681 |
| 2000-06-14 | 18874.34 |
| 2000-06-15 | 18967.205 |
| 2000-06-16 | 18825.132 |
| 2000-06-19 | 19131.935 |
| 2000-06-20 | 19078.53 |
| 2000-06-21 | 19139.418 |
| 2000-06-22 | 18784.36 |
| 2000-06-23 | 18608.515 |
| 2000-06-26 | 18781.75 |
| 2000-06-27 | 18690.128 |
| 2000-06-28 | 18818.615 |
| 2000-06-29 | 18688.264 |
| 2000-06-30 | 18802.93 |
| 2000-07-03 | 18940.945 |
| 2000-07-05 | 18637.814 |
| 2000-07-06 | 18798.967 |
| 2000-07-07 | 19077.165 |
| 2000-07-10 | 19045.772 |
| 2000-07-11 | 19078.433 |
| 2000-07-12 | 19310.499 |
| 2000-07-13 | 19403.163 |
| 2000-07-14 | 19585.833 |
| 2000-07-17 | 19610.931 |
| 2000-07-18 | 19352.761 |
| 2000-07-19 | 19141.26 |
| 2000-07-20 | 19390.228 |
| 2000-07-21 | 19136.99 |
| 2000-07-24 | 18873.709 |
| 2000-07-25 | 18973.895 |
| 2000-07-26 | 18735.051 |
| 2000-07-27 | 18589.767 |
| 2000-07-28 | 18178.199 |
| 2000-07-31 | 18362.425 |
| 2000-08-01 | 18407.496 |
| 2000-08-02 | 18412.662 |
| 2000-08-03 | 18600.511 |
| 2000-08-04 | 18761.099 |
| 2000-08-07 | 18975.961 |
| 2000-08-08 | 19000.797 |
| 2000-08-09 | 18885.886 |
| 2000-08-10 | 18712.391 |
| 2000-08-11 | 18876.988 |
| 2000-08-14 | 19112.856 |
| 2000-08-15 | 19022.727 |
| 2000-08-16 | 18988.317 |
| 2000-08-17 | 19203.633 |
| 2000-08-18 | 19157.06 |
| 2000-08-21 | 19243.002 |
| 2000-08-22 | 19242.933 |
| 2000-08-23 | 19352.458 |
| 2000-08-24 | 19418.302 |
| 2000-08-25 | 19410.67 |
| 2000-08-28 | 19503.059 |
| 2000-08-29 | 19487.59 |
| 2000-08-30 | 19457.905 |
| 2000-08-31 | 19670.672 |
| 2000-09-01 | 19637.133 |
| 2000-09-05 | 19461.439 |
| 2000-09-06 | 19246.019 |
| 2000-09-07 | 19397.677 |
| 2000-09-08 | 19253.789 |
| 2000-09-11 | 19179.296 |
| 2000-09-12 | 19099.638 |
| 2000-09-13 | 19144.133 |
| 2000-09-14 | 19149.738 |
| 2000-09-15 | 18929.535 |
| 2000-09-18 | 18606.775 |
| 2000-09-19 | 18836.954 |
| 2000-09-20 | 18764.873 |
| 2000-09-21 | 18688.668 |
| 2000-09-22 | 18743.948 |
| 2000-09-25 | 18643.158 |
| 2000-09-26 | 18478.674 |
| 2000-09-27 | 18452.226 |
| 2000-09-28 | 18892.124 |
| 2000-09-29 | 18655.121 |
| 2000-10-02 | 18498.36 |
| 2000-10-03 | 18281.957 |
| 2000-10-04 | 18402.245 |
| 2000-10-05 | 18361.246 |
| 2000-10-06 | 17978.399 |
| 2000-10-09 | 17920.437 |
| 2000-10-10 | 17666.524 |
| 2000-10-11 | 17373.062 |
| 2000-10-12 | 16901.323 |
| 2000-10-13 | 17514.772 |
| 2000-10-16 | 17553.309 |
| 2000-10-17 | 17221.132 |
| 2000-10-18 | 17091.912 |
| 2000-10-19 | 17705.676 |
| 2000-10-20 | 17862.448 |
| 2000-10-23 | 17864.514 |
| 2000-10-24 | 17847.92 |
| 2000-10-25 | 17419.656 |
| 2000-10-26 | 17426.66 |
| 2000-10-27 | 17593.295 |
| 2000-10-30 | 17737.003 |
| 2000-10-31 | 18214.406 |
| 2000-11-01 | 18119.067 |
| 2000-11-02 | 18304.611 |
| 2000-11-03 | 18297.297 |
| 2000-11-06 | 18326.992 |
| 2000-11-07 | 18324.354 |
| 2000-11-08 | 17982.292 |
| 2000-11-09 | 17813.715 |
| 2000-11-10 | 17348.358 |
| 2000-11-13 | 17120.923 |
| 2000-11-14 | 17564.145 |
| 2000-11-15 | 17672.551 |
| 2000-11-16 | 17391.671 |
| 2000-11-17 | 17308.723 |
| 2000-11-20 | 16900.502 |
| 2000-11-21 | 16900.639 |
| 2000-11-22 | 16556.977 |
| 2000-11-24 | 16889.66 |
| 2000-11-27 | 16944.758 |
| 2000-11-28 | 16676.416 |
| 2000-11-29 | 16708.095 |
| 2000-11-30 | 16374.017 |
| 2000-12-01 | 16467.149 |
| 2000-12-04 | 16531.157 |
| 2000-12-05 | 17259.888 |
| 2000-12-06 | 16960.721 |
| 2000-12-07 | 16866.548 |
| 2000-12-08 | 17327.644 |
| 2000-12-11 | 17526.236 |
| 2000-12-12 | 17353.814 |
| 2000-12-13 | 17162.363 |
| 2000-12-14 | 16865.755 |
| 2000-12-15 | 16544.468 |
| 2000-12-18 | 16659.42 |
| 2000-12-19 | 16399.693 |
| 2000-12-20 | 15828.09 |
| 2000-12-21 | 15917.366 |
| 2000-12-22 | 16390.733 |
| 2000-12-26 | 16489.515 |
| 2000-12-27 | 16710.816 |
| 2000-12-28 | 16861.446 |
| 2000-12-29 | 16656.534 |
| 2001-01-02 | 15991.877 |
| 2001-01-03 | 16829.73 |
| 2001-01-04 | 16617.881 |
| 2001-01-05 | 16139.698 |
| 2001-01-08 | 16090.474 |
| 2001-01-09 | 16172.759 |
| 2001-01-10 | 16400.485 |
| 2001-01-11 | 16621.986 |
| 2001-01-12 | 16559.304 |
| 2001-01-16 | 16677.246 |
| 2001-01-17 | 16734.313 |
| 2001-01-18 | 16921.979 |
| 2001-01-19 | 16834.759 |
| 2001-01-22 | 16842.848 |
| 2001-01-23 | 17106.694 |
| 2001-01-24 | 17170.898 |
| 2001-01-25 | 17045.127 |
| 2001-01-25 | 17029.684 |
| 2001-01-29 | 17183.704 |
| 2001-01-30 | 17290.512 |
| 2001-01-31 | 17171.075 |
| 2001-02-01 | 17183.658 |
| 2001-02-02 | 16837.43 |
| 2001-02-05 | 16887.162 |
| 2001-02-06 | 16897.561 |
| 2001-02-07 | 16759.468 |
| 2001-02-08 | 16645.868 |
| 2001-02-09 | 16416.164 |
| 2001-02-12 | 16591.18 |
| 2001-02-13 | 16448.105 |
| 2001-02-14 | 16443.23 |
| 2001-02-15 | 16591.519 |
| 2001-02-16 | 16287.955 |
| 2001-02-20 | 15987.112 |
| 2001-02-21 | 15701.868 |
| 2001-02-22 | 15630.878 |
| 2001-02-23 | 15571.817 |
| 2001-02-26 | 15871.983 |
| 2001-02-27 | 15695.572 |
| 2001-02-28 | 15469.7 |
| 2001-03-01 | 15440.201 |
| 2001-03-02 | 15365.847 |
| 2001-03-05 | 15447.077 |
| 2001-03-06 | 15608.376 |
| 2001-03-07 | 15702.494 |
| 2001-03-08 | 15689.391 |
| 2001-03-09 | 15308.19 |
| 2001-03-12 | 14656.86 |
| 2001-03-13 | 14879.68 |
| 2001-03-14 | 14514.933 |
| 2001-03-15 | 14566.471 |
| 2001-03-16 | 14264.798 |
| 2001-03-19 | 14528.172 |
| 2001-03-20 | 14190.525 |
| 2001-03-21 | 13925.665 |
| 2001-03-22 | 13862.955 |
| 2001-03-23 | 14151.335 |
| 2001-03-26 | 14309.891 |
| 2001-03-27 | 14647.796 |
| 2001-03-28 | 14279.347 |
| 2001-03-29 | 14209.019 |
| 2001-03-30 | 14381.625 |
| 2001-04-02 | 14104.326 |
| 2001-04-03 | 13594.665 |
| 2001-04-04 | 13548.028 |
| 2001-04-05 | 14171.698 |
| 2001-04-06 | 13884.231 |
| 2001-04-09 | 14008.373 |
| 2001-04-10 | 14399.813 |
| 2001-04-11 | 14381.863 |
| 2001-04-12 | 14602.98 |
| 2001-04-16 | 14539.146 |
| 2001-04-17 | 14698.663 |
| 2001-04-18 | 15263.829 |
| 2001-04-19 | 15481.353 |
| 2001-04-20 | 15352.596 |
| 2001-04-23 | 15103.894 |
| 2001-04-24 | 14934.999 |
| 2001-04-25 | 15183.458 |
| 2001-04-26 | 15259.765 |
| 2001-04-27 | 15485.982 |
| 2001-04-30 | 15490.799 |
| 2001-05-01 | 15628.724 |
| 2001-05-02 | 15672.513 |
| 2001-05-03 | 15432.178 |
| 2001-05-04 | 15655.22 |
| 2001-05-07 | 15603.97 |
| 2001-05-08 | 15588.82 |
| 2001-05-09 | 15515.147 |
| 2001-05-10 | 15505.476 |
| 2001-05-11 | 15392.77 |
| 2001-05-14 | 15413.277 |
| 2001-05-15 | 15428.91 |
| 2001-05-16 | 15850.025 |
| 2001-05-17 | 15934.441 |
| 2001-05-18 | 15971.652 |
| 2001-05-21 | 16264.523 |
| 2001-05-22 | 16242.354 |
| 2001-05-23 | 15970.514 |
| 2001-05-24 | 16034.449 |
| 2001-05-25 | 15873.064 |
| 2001-05-29 | 15711.573 |
| 2001-05-30 | 15440.603 |
| 2001-05-31 | 15552.011 |
| 2001-06-01 | 15607.719 |
| 2001-06-04 | 15687.995 |
| 2001-06-05 | 15917.173 |
| 2001-06-06 | 15763.255 |
| 2001-06-07 | 15848.091 |
| 2001-06-08 | 15694.962 |
| 2001-06-11 | 15546.233 |
| 2001-06-12 | 15554.644 |
| 2001-06-13 | 15391.071 |
| 2001-06-14 | 15094.87 |
| 2001-06-15 | 15028.06 |
| 2001-06-18 | 14938.866 |
| 2001-06-19 | 14970.318 |
| 2001-06-20 | 15128.033 |
| 2001-06-21 | 15276.656 |
| 2001-06-22 | 15127.619 |
| 2001-06-25 | 15048.347 |
| 2001-06-26 | 15049.818 |
| 2001-06-27 | 15016.039 |
| 2001-06-28 | 15210.756 |
| 2001-06-29 | 15254.243 |
| 2001-07-02 | 15391.379 |
| 2001-07-03 | 15360.268 |
| 2001-07-05 | 15175.703 |
| 2001-07-06 | 14831.128 |
| 2001-07-09 | 14917.946 |
| 2001-07-10 | 14701.009 |
| 2001-07-11 | 14676.857 |
| 2001-07-12 | 15030.431 |
| 2001-07-13 | 15115.867 |
| 2001-07-16 | 14944.954 |
| 2001-07-17 | 15100.834 |
| 2001-07-18 | 14998.662 |
| 2001-07-19 | 15080.464 |
| 2001-07-20 | 15036.009 |
| 2001-07-23 | 14808.626 |
| 2001-07-24 | 14562.495 |
| 2001-07-25 | 14763.715 |
| 2001-07-26 | 14935.553 |
| 2001-07-27 | 14972.753 |
| 2001-07-30 | 14956.916 |
| 2001-07-31 | 15030.833 |
| 2001-08-01 | 15099.52 |
| 2001-08-02 | 15149.017 |
| 2001-08-03 | 15077.004 |
| 2001-08-06 | 14905.716 |
| 2001-08-07 | 14937.766 |
| 2001-08-08 | 14682.838 |
| 2001-08-09 | 14675.57 |
| 2001-08-10 | 14743.774 |
| 2001-08-13 | 14774.752 |
| 2001-08-14 | 14734.266 |
| 2001-08-15 | 14631.196 |
| 2001-08-16 | 14663.528 |
| 2001-08-17 | 14429.493 |
| 2001-08-20 | 14533.422 |
| 2001-08-21 | 14363.729 |
| 2001-08-22 | 14462.764 |
| 2001-08-23 | 14418.751 |
| 2001-08-24 | 14682.034 |
| 2001-08-27 | 14622.854 |
| 2001-08-28 | 14414.742 |
| 2001-08-29 | 14274.042 |
| 2001-08-30 | 14043.145 |
| 2001-08-31 | 14100.943 |
| 2001-09-04 | 14025.539 |
| 2001-09-05 | 13980.924 |
| 2001-09-06 | 13686.636 |
| 2001-09-07 | 13438.792 |
| 2001-09-10 | 13489.469 |
| 2001-09-17 | 12803.598 |
| 2001-09-18 | 12704.301 |
| 2001-09-19 | 12492.636 |
| 2001-09-20 | 12112.801 |
| 2001-09-21 | 11882.126 |
| 2001-09-24 | 12333.477 |
| 2001-09-25 | 12425.966 |
| 2001-09-26 | 12344.157 |
| 2001-09-27 | 12482.303 |
| 2001-09-28 | 12766.565 |
| 2001-10-01 | 12750.023 |
| 2001-10-02 | 12750.049 |
| 2001-10-03 | 13184.064 |
| 2001-10-04 | 13173.053 |
| 2001-10-05 | 13176.911 |
| 2001-10-08 | 13072.724 |
| 2001-10-09 | 13007.276 |
| 2001-10-10 | 13311.653 |
| 2001-10-11 | 13541.164 |
| 2001-10-12 | 13460.901 |
| 2001-10-15 | 13449.086 |
| 2001-10-16 | 13553.006 |
| 2001-10-17 | 13283.041 |
| 2001-10-18 | 13182.993 |
| 2001-10-19 | 13254.308 |
| 2001-10-22 | 13451.618 |
| 2001-10-23 | 13388.715 |
| 2001-10-24 | 13396.551 |
| 2001-10-25 | 13586.815 |
| 2001-10-26 | 13643.623 |
| 2001-10-29 | 13328.463 |
| 2001-10-30 | 13098.362 |
| 2001-10-31 | 13122.996 |
| 2001-11-01 | 13418.562 |
| 2001-11-02 | 13440.312 |
| 2001-11-05 | 13628.576 |
| 2001-11-06 | 13826.18 |
| 2001-11-07 | 13792.407 |
| 2001-11-08 | 13807.314 |
| 2001-11-09 | 13816.572 |
| 2001-11-12 | 13806.751 |
| 2001-11-13 | 14060.064 |
| 2001-11-14 | 14103.243 |
| 2001-11-15 | 14104.088 |
| 2001-11-16 | 14070.758 |
| 2001-11-19 | 14232 |
| 2001-11-20 | 14119.666 |
| 2001-11-21 | 14054.483 |
| 2001-11-23 | 14217.991 |
| 2001-11-26 | 14317.752 |
| 2001-11-27 | 14241.566 |
| 2001-11-28 | 13990.775 |
| 2001-11-29 | 14148.742 |
| 2001-11-30 | 14130.843 |
| 2001-12-03 | 14068.737 |
| 2001-12-04 | 14272.121 |
| 2001-12-05 | 14595.005 |
| 2001-12-06 | 14578.314 |
| 2001-12-07 | 14474.992 |
| 2001-12-10 | 14256.845 |
| 2001-12-11 | 14231.425 |
| 2001-12-12 | 14233.446 |
| 2001-12-13 | 14021.777 |
| 2001-12-14 | 14068.427 |
| 2001-12-17 | 14211.569 |
| 2001-12-18 | 14328.766 |
| 2001-12-19 | 14389.829 |
| 2001-12-20 | 14256.198 |
| 2001-12-21 | 14339.529 |
| 2001-12-24 | 14344.985 |
| 2001-12-26 | 14418.455 |
| 2001-12-27 | 14514.422 |
| 2001-12-28 | 14573.6 |
| 2001-12-31 | 14424.221 |
| 2002-01-02 | 14449.691 |
| 2002-01-03 | 14591.905 |
| 2002-01-04 | 14693.569 |
| 2002-01-07 | 14593.867 |
| 2002-01-08 | 14557.793 |
| 2002-01-09 | 14492.123 |
| 2002-01-10 | 14503.44 |
| 2002-01-11 | 14378.927 |
| 2002-01-14 | 14262.506 |
| 2002-01-15 | 14358.968 |
| 2002-01-16 | 14131.488 |
| 2002-01-17 | 14276.027 |
| 2002-01-18 | 14125.09 |
| 2002-01-22 | 14011.894 |
| 2002-01-23 | 14142.186 |
| 2002-01-24 | 14201.231 |
| 2002-01-25 | 14215.356 |
| 2002-01-28 | 14222.749 |
| 2002-01-29 | 13867.49 |
| 2002-01-30 | 14012.284 |
| 2002-01-31 | 14199.456 |
| 2002-02-01 | 14043.789 |
| 2002-02-04 | 13715.874 |
| 2002-02-05 | 13669.057 |
| 2002-02-06 | 13564.795 |
| 2002-02-07 | 13508.54 |
| 2002-02-08 | 13721.349 |
| 2002-02-11 | 13904.317 |
| 2002-02-12 | 13862.494 |
| 2002-02-13 | 13995.955 |
| 2002-02-14 | 13962.312 |
| 2002-02-15 | 13809.908 |
| 2002-02-19 | 13547.016 |
| 2002-02-20 | 13725.272 |
| 2002-02-21 | 13520.455 |
| 2002-02-22 | 13627.596 |
| 2002-02-25 | 13851.704 |
| 2002-02-26 | 13867.769 |
| 2002-02-27 | 13873.619 |
| 2002-02-28 | 13833.229 |
| 2002-03-01 | 14058.22 |
| 2002-03-04 | 14335.004 |
| 2002-03-05 | 14260.946 |
| 2002-03-06 | 14456.602 |
| 2002-03-07 | 14397.374 |
| 2002-03-08 | 14498.418 |
| 2002-03-11 | 14540.339 |
| 2002-03-12 | 14501.493 |
| 2002-03-13 | 14368.539 |
| 2002-03-14 | 14363.84 |
| 2002-03-15 | 14517.082 |
| 2002-03-18 | 14532.179 |
| 2002-03-19 | 14582.248 |
| 2002-03-20 | 14365.65 |
| 2002-03-21 | 14409.023 |
| 2002-03-22 | 14346.906 |
| 2002-03-25 | 14142.489 |
| 2002-03-26 | 14225.973 |
| 2002-03-27 | 14306.595 |
| 2002-03-28 | 14345.415 |
| 2002-04-01 | 14251.649 |
| 2002-04-02 | 14124.704 |
| 2002-04-03 | 13985.341 |
| 2002-04-04 | 14002.366 |
| 2002-04-05 | 13968.673 |
| 2002-04-08 | 14017.947 |
| 2002-04-09 | 13939.111 |
| 2002-04-10 | 14100.385 |
| 2002-04-11 | 13794.333 |
| 2002-04-12 | 13908.49 |
| 2002-04-15 | 13818.295 |
| 2002-04-16 | 14124.863 |
| 2002-04-17 | 14089.251 |
| 2002-04-18 | 14070.756 |
| 2002-04-19 | 14079.375 |
| 2002-04-22 | 13872.335 |
| 2002-04-23 | 13801.31 |
| 2002-04-24 | 13715.206 |
| 2002-04-25 | 13704.046 |
| 2002-04-26 | 13514.362 |
| 2002-04-29 | 13397.505 |
| 2002-04-30 | 13557.944 |
| 2002-05-01 | 13660.239 |
| 2002-05-02 | 13633.537 |
| 2002-05-03 | 13506.128 |
| 2002-05-06 | 13260.299 |
| 2002-05-07 | 13212.15 |
| 2002-05-08 | 13674.034 |
| 2002-05-09 | 13478.062 |
| 2002-05-10 | 13261.782 |
| 2002-05-13 | 13490.824 |
| 2002-05-14 | 13781.836 |
| 2002-05-15 | 13725.373 |
| 2002-05-16 | 13772.41 |
| 2002-05-17 | 13866.405 |
| 2002-05-20 | 13690.873 |
| 2002-05-21 | 13534.512 |
| 2002-05-22 | 13584.54 |
| 2002-05-23 | 13727.663 |
| 2002-05-24 | 13570.468 |
| 2002-05-28 | 13473.058 |
| 2002-05-29 | 13385.127 |
| 2002-05-30 | 13353.804 |
| 2002-05-31 | 13379.632 |
| 2002-06-03 | 13052.792 |
| 2002-06-04 | 13038.859 |
| 2002-06-05 | 13139.721 |
| 2002-06-06 | 12893.103 |
| 2002-06-07 | 12904.072 |
| 2002-06-10 | 12929.211 |
| 2002-06-11 | 12714.507 |
| 2002-06-12 | 12781.855 |
| 2002-06-13 | 12645.36 |
| 2002-06-14 | 12635.516 |
| 2002-06-17 | 12981.184 |
| 2002-06-18 | 12986.331 |
| 2002-06-19 | 12779.049 |
| 2002-06-20 | 12611.343 |
| 2002-06-21 | 12424.16 |
| 2002-06-24 | 12446.494 |
| 2002-06-25 | 12241.131 |
| 2002-06-26 | 12202.311 |
| 2002-06-27 | 12401.971 |
| 2002-06-28 | 12416.287 |
| 2002-07-01 | 12117.628 |
| 2002-07-02 | 11844.15 |
| 2002-07-03 | 11892.563 |
| 2002-07-05 | 12309.15 |
| 2002-07-08 | 12157.371 |
| 2002-07-09 | 11877.416 |
| 2002-07-10 | 11520.092 |
| 2002-07-11 | 11577.756 |
| 2002-07-12 | 11513.775 |
| 2002-07-15 | 11460.499 |
| 2002-07-16 | 11293.639 |
| 2002-07-17 | 11360.304 |
| 2002-07-18 | 11056.031 |
| 2002-07-19 | 10682.966 |
| 2002-07-22 | 10342.652 |
| 2002-07-23 | 10047.049 |
| 2002-07-24 | 10585.256 |
| 2002-07-25 | 10535.733 |
| 2002-07-26 | 10694.385 |
| 2002-07-29 | 11268.647 |
| 2002-07-30 | 11317.482 |
| 2002-07-31 | 11388.667 |
| 2002-08-01 | 11046.891 |
| 2002-08-02 | 10783.924 |
| 2002-08-05 | 10427.944 |
| 2002-08-06 | 10740.217 |
| 2002-08-07 | 10930.668 |
| 2002-08-08 | 11259.117 |
| 2002-08-09 | 11291.482 |
| 2002-08-12 | 11245.825 |
| 2002-08-13 | 11006.477 |
| 2002-08-14 | 11411.472 |
| 2002-08-15 | 11545.281 |
| 2002-08-16 | 11552.842 |
| 2002-08-19 | 11798.184 |
| 2002-08-20 | 11644.959 |
| 2002-08-21 | 11800.634 |
| 2002-08-22 | 11954.992 |
| 2002-08-23 | 11693.276 |
| 2002-08-26 | 11791.729 |
| 2002-08-27 | 11613.41 |
| 2002-08-28 | 11408.166 |
| 2002-08-29 | 11429.479 |
| 2002-08-30 | 11399.722 |
| 2002-09-03 | 10938.011 |
| 2002-09-04 | 11132.079 |
| 2002-09-05 | 10955.607 |
| 2002-09-06 | 11153.528 |
| 2002-09-09 | 11253.488 |
| 2002-09-10 | 11328.763 |
| 2002-09-11 | 11323.989 |
| 2002-09-12 | 11057.119 |
| 2002-09-13 | 11100.569 |
| 2002-09-16 | 11102.003 |
| 2002-09-17 | 10892.877 |
| 2002-09-18 | 10842.785 |
| 2002-09-19 | 10527.375 |
| 2002-09-20 | 10551.178 |
| 2002-09-23 | 10400.022 |
| 2002-09-24 | 10239.462 |
| 2002-09-25 | 10483.49 |
| 2002-09-26 | 10665.853 |
| 2002-09-27 | 10353.086 |
| 2002-09-30 | 10223.011 |
| 2002-10-01 | 10561.881 |
| 2002-10-02 | 10319.057 |
| 2002-10-03 | 10205.884 |
| 2002-10-04 | 9976.322 |
| 2002-10-07 | 9774.133 |
| 2002-10-08 | 9916.02 |
| 2002-10-09 | 9640.505 |
| 2002-10-10 | 9966.554 |
| 2002-10-11 | 10336.598 |
| 2002-10-14 | 10411.972 |
| 2002-10-15 | 10884.673 |
| 2002-10-16 | 10622.813 |
| 2002-10-17 | 10874.209 |
| 2002-10-18 | 10928.393 |
| 2002-10-21 | 11106.319 |
| 2002-10-22 | 10982.616 |
| 2002-10-23 | 11068.547 |
| 2002-10-24 | 10913.15 |
| 2002-10-25 | 11094.949 |
| 2002-10-28 | 11003.544 |
| 2002-10-29 | 10907.255 |
| 2002-10-30 | 11017.409 |
| 2002-10-31 | 10972.428 |
| 2002-11-01 | 11162.643 |
| 2002-11-04 | 11251.711 |
| 2002-11-05 | 11322.713 |
| 2002-11-06 | 11433.983 |
| 2002-11-07 | 11181.037 |
| 2002-11-08 | 11079.404 |
| 2002-11-11 | 10850.761 |
| 2002-11-12 | 10941.076 |
| 2002-11-13 | 10937.584 |
| 2002-11-14 | 11201.925 |
| 2002-11-15 | 11270.105 |
| 2002-11-18 | 11158.455 |
| 2002-11-19 | 11104.888 |
| 2002-11-20 | 11316.543 |
| 2002-11-21 | 11556.346 |
| 2002-11-22 | 11531.479 |
| 2002-11-25 | 11571.694 |
| 2002-11-26 | 11337.838 |
| 2002-11-27 | 11649.195 |
| 2002-11-29 | 11614.954 |
| 2002-12-02 | 11633.426 |
| 2002-12-03 | 11455.646 |
| 2002-12-04 | 11409.817 |
| 2002-12-05 | 11287.091 |
| 2002-12-06 | 11354.381 |
| 2002-12-09 | 11103.126 |
| 2002-12-10 | 11259.432 |
| 2002-12-11 | 11266.945 |
| 2002-12-12 | 11239.366 |
| 2002-12-13 | 11087.179 |
| 2002-12-16 | 11331.012 |
| 2002-12-17 | 11242.998 |
| 2002-12-18 | 11094.034 |
| 2002-12-19 | 11016.427 |
| 2002-12-20 | 11151.877 |
| 2002-12-23 | 11177.865 |
| 2002-12-24 | 11121.232 |
| 2002-12-26 | 11099.876 |
| 2002-12-27 | 10928.439 |
| 2002-12-30 | 10965.361 |
| 2002-12-31 | 10978.098 |
| 2003-01-02 | 11267.814 |
| 2003-01-03 | 11257.307 |
| 2003-01-06 | 11491.801 |
| 2003-01-07 | 11415.139 |
| 2003-01-08 | 11260.989 |
| 2003-01-09 | 11470.527 |
| 2003-01-10 | 11473.736 |
| 2003-01-13 | 11456.994 |
| 2003-01-14 | 11519.246 |
| 2003-01-15 | 11370.978 |
| 2003-01-16 | 11332.961 |
| 2003-01-17 | 11174.907 |
| 2003-01-21 | 11004.814 |
| 2003-01-22 | 10901.898 |
| 2003-01-23 | 11011.626 |
| 2003-01-24 | 10710.412 |
| 2003-01-27 | 10535.184 |
| 2003-01-28 | 10666.946 |
| 2003-01-29 | 10734.543 |
| 2003-01-30 | 10507.962 |
| 2003-01-31 | 10644.021 |
| 2003-02-03 | 10601.298 |
| 2003-02-04 | 10464.459 |
| 2003-02-05 | 10413.122 |
| 2003-02-06 | 10345.69 |
| 2003-02-07 | 10235.489 |
| 2003-02-10 | 10307.912 |
| 2003-02-11 | 10235.294 |
| 2003-02-12 | 10104.149 |
| 2003-02-13 | 10077.72 |
| 2003-02-14 | 10266.065 |
| 2003-02-18 | 10467.267 |
| 2003-02-19 | 10394.48 |
| 2003-02-20 | 10311.136 |
| 2003-02-21 | 10446.805 |
| 2003-02-24 | 10263.621 |
| 2003-02-25 | 10334.25 |
| 2003-02-26 | 10208.215 |
| 2003-02-27 | 10321.692 |
| 2003-02-28 | 10364.424 |
| 2003-03-03 | 10235.036 |
| 2003-03-04 | 10088.547 |
| 2003-03-05 | 10163.807 |
| 2003-03-06 | 10079.036 |
| 2003-03-07 | 10153.56 |
| 2003-03-10 | 9914.392 |
| 2003-03-11 | 9834.57 |
| 2003-03-12 | 9861.203 |
| 2003-03-13 | 10191.242 |
| 2003-03-14 | 10204.022 |
| 2003-03-17 | 10548.779 |
| 2003-03-18 | 10596.773 |
| 2003-03-19 | 10671.878 |
| 2003-03-20 | 10705.696 |
| 2003-03-21 | 10936.659 |
| 2003-03-24 | 10571.122 |
| 2003-03-25 | 10698.821 |
| 2003-03-26 | 10638.81 |
| 2003-03-27 | 10627.451 |
| 2003-03-28 | 10577.751 |
| 2003-03-31 | 10404.953 |
| 2003-04-01 | 10544.825 |
| 2003-04-02 | 10812.098 |
| 2003-04-03 | 10760.037 |
| 2003-04-04 | 10774.853 |
| 2003-04-07 | 10796.273 |
| 2003-04-08 | 10766.746 |
| 2003-04-09 | 10632.474 |
| 2003-04-10 | 10689.845 |
| 2003-04-11 | 10655.112 |
| 2003-04-14 | 10854.214 |
| 2003-04-15 | 10920.067 |
| 2003-04-16 | 10801.013 |
| 2003-04-17 | 10965.006 |
| 2003-04-21 | 10955.798 |
| 2003-04-22 | 11180.425 |
| 2003-04-23 | 11275.301 |
| 2003-04-24 | 11184.919 |
| 2003-04-25 | 11041.491 |
| 2003-04-28 | 11230.453 |
| 2003-04-29 | 11267.634 |
| 2003-04-30 | 11269.525 |
| 2003-05-01 | 11283.318 |
| 2003-05-02 | 11459.292 |
| 2003-05-05 | 11437.785 |
| 2003-05-06 | 11530.52 |
| 2003-05-07 | 11478.101 |
| 2003-05-08 | 11367.932 |
| 2003-05-09 | 11523.217 |
| 2003-05-12 | 11666.801 |
| 2003-05-13 | 11640.222 |
| 2003-05-14 | 11611.36 |
| 2003-05-15 | 11695.715 |
| 2003-05-16 | 11661.405 |
| 2003-05-19 | 11392.877 |
| 2003-05-20 | 11380.035 |
| 2003-05-21 | 11428.03 |
| 2003-05-22 | 11535.527 |
| 2003-05-23 | 11565.881 |
| 2003-05-27 | 11787.399 |
| 2003-05-28 | 11809.256 |
| 2003-05-29 | 11775.867 |
| 2003-05-30 | 11958.483 |
| 2003-06-02 | 11992.214 |
| 2003-06-03 | 12037.657 |
| 2003-06-04 | 12220.903 |
| 2003-06-05 | 12284.836 |
| 2003-06-06 | 12248.217 |
| 2003-06-09 | 12089.306 |
| 2003-06-10 | 12204.149 |
| 2003-06-11 | 12358.875 |
| 2003-06-12 | 12377.806 |
| 2003-06-13 | 12250.446 |
| 2003-06-16 | 12509.08 |
| 2003-06-17 | 12520.275 |
| 2003-06-18 | 12499.439 |
| 2003-06-19 | 12317.139 |
| 2003-06-20 | 12325.25 |
| 2003-06-23 | 12141.33 |
| 2003-06-24 | 12164.524 |
| 2003-06-25 | 12093.569 |
| 2003-06-26 | 12225.386 |
| 2003-06-27 | 12126.325 |
| 2003-06-30 | 12105.528 |
| 2003-07-01 | 12179.589 |
| 2003-07-02 | 12335.584 |
| 2003-07-03 | 12247.802 |
| 2003-07-07 | 12477.639 |
| 2003-07-08 | 12538.616 |
| 2003-07-09 | 12494.078 |
| 2003-07-10 | 12326.175 |
| 2003-07-11 | 12439.909 |
| 2003-07-14 | 12524.844 |
| 2003-07-15 | 12478.921 |
| 2003-07-16 | 12398.995 |
| 2003-07-17 | 12222.963 |
| 2003-07-18 | 12356.721 |
| 2003-07-21 | 12184.43 |
| 2003-07-22 | 12300.831 |
| 2003-07-23 | 12316.363 |
| 2003-07-24 | 12241.472 |
| 2003-07-25 | 12424.933 |
| 2003-07-28 | 12421.115 |
| 2003-07-29 | 12350.845 |
| 2003-07-30 | 12332.349 |
| 2003-07-31 | 12367.762 |
| 2003-08-01 | 12190.591 |
| 2003-08-04 | 12203.537 |
| 2003-08-05 | 11999.896 |
| 2003-08-06 | 12001.52 |
| 2003-08-07 | 12072.246 |
| 2003-08-08 | 12111.381 |
| 2003-08-11 | 12161.218 |
| 2003-08-12 | 12288.937 |
| 2003-08-13 | 12225.548 |
| 2003-08-14 | 12302.321 |
| 2003-08-15 | 12310.961 |
| 2003-08-18 | 12434.412 |
| 2003-08-19 | 12486.067 |
| 2003-08-20 | 12470.594 |
| 2003-08-21 | 12527.265 |
| 2003-08-22 | 12394.723 |
| 2003-08-25 | 12364.047 |
| 2003-08-26 | 12426.366 |
| 2003-08-27 | 12445.295 |
| 2003-08-28 | 12533.222 |
| 2003-08-29 | 12598.571 |
| 2003-09-02 | 12731.111 |
| 2003-09-03 | 12784.72 |
| 2003-09-04 | 12810.515 |
| 2003-09-05 | 12732.718 |
| 2003-09-08 | 12866.192 |
| 2003-09-09 | 12766.34 |
| 2003-09-10 | 12588.447 |
| 2003-09-11 | 12663.853 |
| 2003-09-12 | 12694.957 |
| 2003-09-15 | 12650.756 |
| 2003-09-16 | 12825.719 |
| 2003-09-17 | 12790.683 |
| 2003-09-18 | 12950.544 |
| 2003-09-19 | 12922.14 |
| 2003-09-22 | 12759.863 |
| 2003-09-23 | 12844.266 |
| 2003-09-24 | 12605.387 |
| 2003-09-25 | 12501.01 |
| 2003-09-26 | 12398.253 |
| 2003-09-29 | 12522.307 |
| 2003-09-30 | 12402.392 |
| 2003-10-01 | 12685.843 |
| 2003-10-02 | 12721.612 |
| 2003-10-03 | 12854.06 |
| 2003-10-06 | 12918.367 |
| 2003-10-07 | 12983.343 |
| 2003-10-08 | 12916.18 |
| 2003-10-09 | 12986.096 |
| 2003-10-10 | 12976.318 |
| 2003-10-13 | 13082.39 |
| 2003-10-14 | 13138.205 |
| 2003-10-15 | 13091.473 |
| 2003-10-16 | 13137.819 |
| 2003-10-17 | 12993.122 |
| 2003-10-20 | 13046.981 |
| 2003-10-21 | 13078.53 |
| 2003-10-22 | 12875.959 |
| 2003-10-23 | 12904.111 |
| 2003-10-24 | 12845.311 |
| 2003-10-27 | 12901.563 |
| 2003-10-28 | 13099.682 |
| 2003-10-29 | 13133.277 |
| 2003-10-30 | 13118.107 |
| 2003-10-31 | 13155.42 |
| 2003-11-03 | 13310.642 |
| 2003-11-04 | 13251.631 |
| 2003-11-05 | 13240.845 |
| 2003-11-06 | 13319.802 |
| 2003-11-07 | 13275.24 |
| 2003-11-10 | 13178.712 |
| 2003-11-11 | 13152.432 |
| 2003-11-12 | 13323.259 |
| 2003-11-13 | 13327.027 |
| 2003-11-14 | 13217.055 |
| 2003-11-17 | 13123.855 |
| 2003-11-18 | 13008.284 |
| 2003-11-19 | 13102.645 |
| 2003-11-20 | 13001.808 |
| 2003-11-21 | 13028.978 |
| 2003-11-24 | 13251.966 |
| 2003-11-25 | 13289.69 |
| 2003-11-26 | 13346.018 |
| 2003-11-28 | 13355.823 |
| 2003-12-01 | 13523.803 |
| 2003-12-02 | 13485.857 |
| 2003-12-03 | 13435.048 |
| 2003-12-04 | 13473.304 |
| 2003-12-05 | 13370.807 |
| 2003-12-08 | 13464.521 |
| 2003-12-09 | 13337.356 |
| 2003-12-10 | 13297.318 |
| 2003-12-11 | 13471.47 |
| 2003-12-12 | 13515.305 |
| 2003-12-15 | 13412.885 |
| 2003-12-16 | 13485.496 |
| 2003-12-17 | 13503.577 |
| 2003-12-18 | 13668.146 |
| 2003-12-19 | 13663.754 |
| 2003-12-22 | 13715.61 |
| 2003-12-23 | 13764.133 |
| 2003-12-24 | 13740.459 |
| 2003-12-26 | 13767.103 |
| 2003-12-29 | 13939.085 |
| 2003-12-30 | 13947.919 |
| 2003-12-31 | 13948.165 |
| 2004-01-02 | 13852.402 |
| 2004-01-05 | 14017.532 |
| 2004-01-06 | 14041.721 |
| 2004-01-07 | 14082.773 |
| 2004-01-08 | 14150.275 |
| 2004-01-09 | 14046.657 |
| 2004-01-12 | 14124.081 |
| 2004-01-13 | 14055.499 |
| 2004-01-14 | 14167.446 |
| 2004-01-15 | 14185.182 |
| 2004-01-16 | 14287.052 |
| 2004-01-20 | 14306.691 |
| 2004-01-21 | 14398.305 |
| 2004-01-22 | 14349.696 |
| 2004-01-23 | 14339.427 |
| 2004-01-25 | 14500.098 |
| 2004-01-27 | 14365.942 |
| 2004-01-28 | 14159.708 |
| 2004-01-29 | 14196.673 |
| 2004-01-30 | 14175.44 |
| 2004-02-02 | 14139.885 |
| 2004-02-03 | 14139.169 |
| 2004-02-04 | 13997.501 |
| 2004-02-05 | 14028.795 |
| 2004-02-06 | 14227.415 |
| 2004-02-09 | 14211.218 |
| 2004-02-10 | 14293.953 |
| 2004-02-11 | 14437.079 |
| 2004-02-12 | 14367.51 |
| 2004-02-13 | 14284.417 |
| 2004-02-17 | 14425.113 |
| 2004-02-18 | 14365.311 |
| 2004-02-19 | 14288.15 |
| 2004-02-20 | 14245.529 |
| 2004-02-23 | 14177.085 |
| 2004-02-24 | 14158.473 |
| 2004-02-25 | 14232.796 |
| 2004-02-26 | 14269.255 |
| 2004-02-27 | 14282.998 |
| 2004-03-01 | 14339.628 |
| 2004-03-02 | 14258.286 |
| 2004-03-03 | 14274.645 |
| 2004-03-04 | 14338.218 |
| 2004-03-05 | 14371.306 |
| 2004-03-08 | 14252.163 |
| 2004-03-09 | 14159.034 |
| 2004-03-10 | 13945.771 |
| 2004-03-11 | 13745.185 |
| 2004-03-12 | 13931.52 |
| 2004-03-15 | 13716.124 |
| 2004-03-16 | 13774.221 |
| 2004-03-17 | 13947.651 |
| 2004-03-18 | 13921.841 |
| 2004-03-19 | 13785.183 |
| 2004-03-22 | 13595.685 |
| 2004-03-23 | 13582.45 |
| 2004-03-24 | 13543.278 |
| 2004-03-25 | 13772.342 |
| 2004-03-26 | 13768.937 |
| 2004-03-29 | 13949.734 |
| 2004-03-30 | 14019.01 |
| 2004-03-31 | 14022.007 |
| 2004-04-01 | 14063.353 |
| 2004-04-02 | 14183.634 |
| 2004-04-05 | 14281.721 |
| 2004-04-06 | 14230.962 |
| 2004-04-07 | 14161.806 |
| 2004-04-08 | 14137.598 |
| 2004-04-12 | 14196.827 |
| 2004-04-13 | 13985.6 |
| 2004-04-14 | 13956.365 |
| 2004-04-15 | 13957.733 |
| 2004-04-16 | 14026.23 |
| 2004-04-19 | 14056.465 |
| 2004-04-20 | 13840.097 |
| 2004-04-21 | 13920.205 |
| 2004-04-22 | 14123.012 |
| 2004-04-23 | 14117.796 |
| 2004-04-26 | 14066.239 |
| 2004-04-27 | 14091.106 |
| 2004-04-28 | 13886.121 |
| 2004-04-29 | 13759.078 |
| 2004-04-30 | 13666.094 |
| 2004-05-03 | 13708.106 |
| 2004-05-04 | 13737.875 |
| 2004-05-05 | 13768.224 |
| 2004-05-06 | 13659.656 |
| 2004-05-07 | 13451.131 |
| 2004-05-10 | 13278.492 |
| 2004-05-11 | 13403.524 |
| 2004-05-12 | 13415.646 |
| 2004-05-13 | 13406.533 |
| 2004-05-14 | 13386.531 |
| 2004-05-17 | 13239.408 |
| 2004-05-18 | 13340.637 |
| 2004-05-19 | 13309.155 |
| 2004-05-20 | 13316.305 |
| 2004-05-21 | 13374.422 |
| 2004-05-24 | 13418.088 |
| 2004-05-25 | 13643.884 |
| 2004-05-26 | 13681.546 |
| 2004-05-27 | 13749.116 |
| 2004-05-28 | 13753.635 |
| 2004-06-01 | 13727.349 |
| 2004-06-02 | 13768.205 |
| 2004-06-03 | 13645.513 |
| 2004-06-04 | 13722.631 |
| 2004-06-07 | 13940.511 |
| 2004-06-08 | 13951.967 |
| 2004-06-09 | 13810.428 |
| 2004-06-10 | 13860.193 |
| 2004-06-14 | 13709.808 |
| 2004-06-15 | 13810.24 |
| 2004-06-16 | 13833.365 |
| 2004-06-17 | 13817.994 |
| 2004-06-18 | 13845.374 |
| 2004-06-21 | 13791.079 |
| 2004-06-22 | 13842.852 |
| 2004-06-23 | 13968.58 |
| 2004-06-24 | 13933.296 |
| 2004-06-25 | 13894.887 |
| 2004-06-28 | 13872.364 |
| 2004-06-29 | 13908.527 |
| 2004-06-30 | 13976.837 |
| 2004-07-01 | 13854.749 |
| 2004-07-02 | 13821.319 |
| 2004-07-06 | 13693.808 |
| 2004-07-07 | 13716.279 |
| 2004-07-08 | 13583.288 |
| 2004-07-09 | 13626.684 |
| 2004-07-12 | 13634.652 |
| 2004-07-13 | 13641.778 |
| 2004-07-14 | 13600.091 |
| 2004-07-15 | 13563.62 |
| 2004-07-16 | 13489.056 |
| 2004-07-19 | 13478.763 |
| 2004-07-20 | 13589.471 |
| 2004-07-21 | 13385.788 |
| 2004-07-22 | 13401.434 |
| 2004-07-23 | 13263.655 |
| 2004-07-26 | 13210.494 |
| 2004-07-27 | 13355.701 |
| 2004-07-28 | 13345.76 |
| 2004-07-29 | 13429.422 |
| 2004-07-30 | 13449.443 |
| 2004-08-02 | 13496.056 |
| 2004-08-03 | 13399.424 |
| 2004-08-04 | 13372.18 |
| 2004-08-05 | 13154.221 |
| 2004-08-06 | 12947.681 |
| 2004-08-09 | 12952.655 |
| 2004-08-10 | 13129.689 |
| 2004-08-11 | 13084.897 |
| 2004-08-12 | 12929.693 |
| 2004-08-13 | 12943.686 |
| 2004-08-16 | 13126.373 |
| 2004-08-17 | 13165.363 |
| 2004-08-18 | 13339.37 |
| 2004-08-19 | 13286.2 |
| 2004-08-20 | 13396.724 |
| 2004-08-23 | 13354.644 |
| 2004-08-24 | 13362.859 |
| 2004-08-25 | 13470.03 |
| 2004-08-26 | 13467.442 |
| 2004-08-27 | 13509.383 |
| 2004-08-30 | 13397.465 |
| 2004-08-31 | 13464.327 |
| 2004-09-01 | 13473.219 |
| 2004-09-02 | 13619.359 |
| 2004-09-03 | 13563.48 |
| 2004-09-07 | 13662.854 |
| 2004-09-08 | 13596.408 |
| 2004-09-09 | 13637.584 |
| 2004-09-10 | 13708.944 |
| 2004-09-13 | 13744.792 |
| 2004-09-14 | 13765.913 |
| 2004-09-15 | 13678.76 |
| 2004-09-16 | 13733.499 |
| 2004-09-17 | 13779.977 |
| 2004-09-20 | 13709.056 |
| 2004-09-21 | 13800.809 |
| 2004-09-22 | 13614.558 |
| 2004-09-23 | 13563.505 |
| 2004-09-24 | 13585.315 |
| 2004-09-27 | 13493.186 |
| 2004-09-28 | 13579.199 |
| 2004-09-29 | 13644.967 |
| 2004-09-30 | 13656.988 |
| 2004-10-01 | 13788.965 |
| 2004-10-04 | 13840.274 |
| 2004-10-05 | 13827.743 |
| 2004-10-06 | 13920.611 |
| 2004-10-07 | 13775.524 |
| 2004-10-08 | 13671.533 |
| 2004-10-11 | 13698.254 |
| 2004-10-12 | 13669.588 |
| 2004-10-13 | 13567.405 |
| 2004-10-14 | 13452.031 |
| 2004-10-15 | 13514.612 |
| 2004-10-18 | 13584.687 |
| 2004-10-19 | 13462.405 |
| 2004-10-20 | 13475.909 |
| 2004-10-21 | 13531.059 |
| 2004-10-22 | 13401.607 |
| 2004-10-25 | 13401.569 |
| 2004-10-26 | 13583.328 |
| 2004-10-27 | 13760.474 |
| 2004-10-28 | 13777.169 |
| 2004-10-29 | 13801.746 |
| 2004-11-01 | 13807.181 |
| 2004-11-02 | 13802.333 |
| 2004-11-03 | 13963.808 |
| 2004-11-04 | 14171.194 |
| 2004-11-05 | 14219.037 |
| 2004-11-08 | 14201.204 |
| 2004-11-09 | 14203.945 |
| 2004-11-10 | 14205.889 |
| 2004-11-11 | 14337.218 |
| 2004-11-12 | 14468.384 |
| 2004-11-15 | 14474.815 |
| 2004-11-16 | 14375.764 |
| 2004-11-17 | 14457.43 |
| 2004-11-18 | 14466.988 |
| 2004-11-19 | 14307.57 |
| 2004-11-22 | 14395.666 |
| 2004-11-23 | 14410.135 |
| 2004-11-24 | 14482.778 |
| 2004-11-26 | 14500.749 |
| 2004-11-29 | 14468.546 |
| 2004-11-30 | 14417.126 |
| 2004-12-01 | 14679.083 |
| 2004-12-02 | 14665.049 |
| 2004-12-03 | 14678.708 |
| 2004-12-06 | 14662.047 |
| 2004-12-07 | 14487.12 |
| 2004-12-08 | 14555.802 |
| 2004-12-09 | 14623.822 |
| 2004-12-10 | 14624.56 |
| 2004-12-13 | 14747.528 |
| 2004-12-14 | 14816.248 |
| 2004-12-15 | 14863.604 |
| 2004-12-16 | 14818.512 |
| 2004-12-17 | 14738.697 |
| 2004-12-20 | 14725.413 |
| 2004-12-21 | 14861.24 |
| 2004-12-22 | 14915.888 |
| 2004-12-23 | 14927.045 |
| 2004-12-27 | 14861.452 |
| 2004-12-28 | 14986.572 |
| 2004-12-29 | 14987.297 |
| 2004-12-30 | 14994.602 |
| 2004-12-31 | 14973.738 |
| 2005-01-03 | 14797.602 |
| 2005-01-04 | 14604.606 |
| 2005-01-05 | 14519.741 |
| 2005-01-06 | 14570.218 |
| 2005-01-07 | 14540.099 |
| 2005-01-10 | 14599.938 |
| 2005-01-11 | 14501.156 |
| 2005-01-12 | 14551.058 |
| 2005-01-13 | 14448.057 |
| 2005-01-14 | 14544.905 |
| 2005-01-18 | 14687.374 |
| 2005-01-19 | 14551.221 |
| 2005-01-20 | 14440.468 |
| 2005-01-21 | 14363.355 |
| 2005-01-24 | 14290.934 |
| 2005-01-25 | 14334.134 |
| 2005-01-25 | 14425.19 |
| 2005-01-27 | 14433.304 |
| 2005-01-28 | 14393.262 |
| 2005-01-31 | 14532.211 |
| 2005-02-01 | 14546.921 |
| 2005-02-02 | 14604.654 |
| 2005-02-03 | 14563.923 |
| 2005-02-04 | 14726.04 |
| 2005-02-07 | 14707.362 |
| 2005-02-08 | 14717.663 |
| 2005-02-09 | 14575.043 |
| 2005-02-10 | 14628.407 |
| 2005-02-11 | 14737.916 |
| 2005-02-14 | 14751.245 |
| 2005-02-15 | 14794.756 |
| 2005-02-16 | 14810.368 |
| 2005-02-17 | 14695.572 |
| 2005-02-18 | 14696.007 |
| 2005-02-22 | 14476.417 |
| 2005-02-23 | 14551.6 |
| 2005-02-24 | 14666.631 |
| 2005-02-25 | 14810.604 |
| 2005-02-28 | 14723.024 |
| 2005-03-01 | 14692.842 |
| 2005-03-02 | 14688.52 |
| 2005-03-03 | 14691.98 |
| 2005-03-04 | 14826.511 |
| 2005-03-07 | 14867.554 |
| 2005-03-08 | 14787.193 |
| 2005-03-09 | 14636.924 |
| 2005-03-10 | 14642.81 |
| 2005-03-11 | 14557.129 |
| 2005-03-14 | 14647.452 |
| 2005-03-15 | 14551.526 |
| 2005-03-16 | 14431.057 |
| 2005-03-17 | 14463.209 |
| 2005-03-18 | 14444.11 |
| 2005-03-21 | 14387.293 |
| 2005-03-22 | 14256.825 |
| 2005-03-23 | 14234.512 |
| 2005-03-24 | 14237.148 |
| 2005-03-28 | 14258.882 |
| 2005-03-29 | 14136.332 |
| 2005-03-30 | 14326.843 |
| 2005-03-31 | 14331.449 |
| 2005-04-01 | 14150.662 |
| 2005-04-04 | 14187.626 |
| 2005-04-05 | 14245.458 |
| 2005-04-06 | 14276.331 |
| 2005-04-07 | 14356.731 |
| 2005-04-08 | 14231.208 |
| 2005-04-11 | 14222.046 |
| 2005-04-12 | 14302.691 |
| 2005-04-13 | 14129.978 |
| 2005-04-14 | 13977.166 |
| 2005-04-15 | 13756.846 |
| 2005-04-18 | 13800.122 |
| 2005-04-19 | 13905.096 |
| 2005-04-20 | 13721.411 |
| 2005-04-21 | 13981.545 |
| 2005-04-22 | 13867.581 |
| 2005-04-25 | 14002.082 |
| 2005-04-26 | 13880.045 |
| 2005-04-27 | 13919.272 |
| 2005-04-28 | 13755.146 |
| 2005-04-29 | 13899.64 |
| 2005-05-02 | 13986.084 |
| 2005-05-03 | 13978.579 |
| 2005-05-04 | 14157.384 |
| 2005-05-05 | 14132.821 |
| 2005-05-06 | 14128.377 |
| 2005-05-09 | 14218.777 |
| 2005-05-10 | 14076.02 |
| 2005-05-11 | 14127.103 |
| 2005-05-12 | 13980.379 |
| 2005-05-13 | 13910.157 |
| 2005-05-16 | 14053.931 |
| 2005-05-17 | 14147.686 |
| 2005-05-18 | 14308.773 |
| 2005-05-19 | 14378.15 |
| 2005-05-20 | 14362.195 |
| 2005-05-23 | 14426.307 |
| 2005-05-24 | 14431.364 |
| 2005-05-25 | 14368.146 |
| 2005-05-26 | 14470.203 |
| 2005-05-27 | 14497.79 |
| 2005-05-31 | 14433.458 |
| 2005-06-01 | 14556.471 |
| 2005-06-02 | 14590.615 |
| 2005-06-03 | 14494.729 |
| 2005-06-06 | 14520.393 |
| 2005-06-07 | 14518.973 |
| 2005-06-08 | 14478.955 |
| 2005-06-09 | 14563.251 |
| 2005-06-10 | 14533.94 |
| 2005-06-13 | 14572.49 |
| 2005-06-14 | 14620.366 |
| 2005-06-15 | 14653.115 |
| 2005-06-16 | 14722.407 |
| 2005-06-17 | 14778.849 |
| 2005-06-20 | 14769.768 |
| 2005-06-21 | 14740.691 |
| 2005-06-22 | 14750.604 |
| 2005-06-23 | 14596.893 |
| 2005-06-24 | 14494.656 |
| 2005-06-27 | 14486.603 |
| 2005-06-28 | 14632.322 |
| 2005-06-29 | 14621.271 |
| 2005-06-30 | 14534.87 |
| 2005-07-01 | 14516.017 |
| 2005-07-05 | 14652.453 |
| 2005-07-06 | 14544.254 |
| 2005-07-07 | 14583.175 |
| 2005-07-08 | 14758.836 |
| 2005-07-11 | 14862.843 |
| 2005-07-12 | 14894.248 |
| 2005-07-13 | 14894.613 |
| 2005-07-14 | 14908.525 |
| 2005-07-15 | 14928.344 |
| 2005-07-18 | 14851.466 |
| 2005-07-19 | 14967.813 |
| 2005-07-20 | 15049.528 |
| 2005-07-21 | 14938.431 |
| 2005-07-22 | 15028.905 |
| 2005-07-25 | 14963.221 |
| 2005-07-26 | 14997.476 |
| 2005-07-27 | 15058.348 |
| 2005-07-28 | 15156.959 |
| 2005-07-29 | 15057.605 |
| 2005-08-01 | 15005.055 |
| 2005-08-02 | 15113.102 |
| 2005-08-03 | 15108.218 |
| 2005-08-04 | 14984.851 |
| 2005-08-05 | 14856.782 |
| 2005-08-08 | 14801.917 |
| 2005-08-09 | 14884.209 |
| 2005-08-10 | 14864.224 |
| 2005-08-11 | 14969.641 |
| 2005-08-12 | 14887.591 |
| 2005-08-15 | 14931.04 |
| 2005-08-16 | 14755.619 |
| 2005-08-17 | 14757.619 |
| 2005-08-18 | 14735.549 |
| 2005-08-19 | 14747.148 |
| 2005-08-22 | 14777.762 |
| 2005-08-23 | 14736.725 |
| 2005-08-24 | 14660.443 |
| 2005-08-25 | 14693.142 |
| 2005-08-26 | 14595.045 |
| 2005-08-29 | 14686.864 |
| 2005-08-30 | 14643.742 |
| 2005-08-31 | 14806.801 |
| 2005-09-01 | 14648.018 |
| 2005-09-02 | 14595.06 |
| 2005-09-06 | 14775.702 |
| 2005-09-07 | 14817.083 |
| 2005-09-08 | 14759.562 |
| 2005-09-09 | 14868.616 |
| 2005-09-12 | 14868.293 |
| 2005-09-13 | 14753.983 |
| 2005-09-14 | 14692.212 |
| 2005-09-15 | 14693.026 |
| 2005-09-16 | 14794.333 |
| 2005-09-19 | 14718.027 |
| 2005-09-20 | 14604.591 |
| 2005-09-21 | 14454.157 |
| 2005-09-22 | 14496.052 |
| 2005-09-23 | 14520.035 |
| 2005-09-26 | 14542.425 |
| 2005-09-27 | 14539.144 |
| 2005-09-28 | 14543.886 |
| 2005-09-29 | 14678.814 |
| 2005-09-30 | 14714.411 |
| 2005-10-03 | 14684.852 |
| 2005-10-04 | 14540.085 |
| 2005-10-05 | 14301.158 |
| 2005-10-06 | 14224.635 |
| 2005-10-07 | 14284.059 |
| 2005-10-10 | 14180.769 |
| 2005-10-11 | 14136.329 |
| 2005-10-12 | 14021.603 |
| 2005-10-13 | 14007.993 |
| 2005-10-14 | 14142.782 |
| 2005-10-17 | 14186.875 |
| 2005-10-18 | 14039.599 |
| 2005-10-19 | 14242.989 |
| 2005-10-20 | 14039.217 |
| 2005-10-21 | 14091.352 |
| 2005-10-24 | 14333.409 |
| 2005-10-25 | 14295.112 |
| 2005-10-26 | 14230.215 |
| 2005-10-27 | 14052.301 |
| 2005-10-28 | 14276.316 |
| 2005-10-31 | 14414.785 |
| 2005-11-01 | 14492.33 |
| 2005-11-02 | 14657.867 |
| 2005-11-03 | 14718.254 |
| 2005-11-04 | 14719.856 |
| 2005-11-07 | 14758.994 |
| 2005-11-08 | 14701.498 |
| 2005-11-09 | 14728.782 |
| 2005-11-10 | 14846.798 |
| 2005-11-11 | 14892.429 |
| 2005-11-14 | 14881.527 |
| 2005-11-15 | 14808.997 |
| 2005-11-16 | 14826.705 |
| 2005-11-17 | 14988.195 |
| 2005-11-18 | 15051.739 |
| 2005-11-21 | 15142.482 |
| 2005-11-22 | 15222.347 |
| 2005-11-23 | 15273.098 |
| 2005-11-25 | 15301.454 |
| 2005-11-28 | 15146.361 |
| 2005-11-29 | 15148.698 |
| 2005-11-30 | 15084.034 |
| 2005-12-01 | 15342.719 |
| 2005-12-02 | 15351.984 |
| 2005-12-05 | 15303.373 |
| 2005-12-06 | 15321.516 |
| 2005-12-07 | 15247.264 |
| 2005-12-08 | 15246.708 |
| 2005-12-09 | 15289.162 |
| 2005-12-12 | 15306.675 |
| 2005-12-13 | 15372.327 |
| 2005-12-14 | 15427.965 |
| 2005-12-15 | 15390.349 |
| 2005-12-16 | 15347.085 |
| 2005-12-19 | 15234.335 |
| 2005-12-20 | 15237.818 |
| 2005-12-21 | 15290.988 |
| 2005-12-22 | 15361.067 |
| 2005-12-23 | 15374.879 |
| 2005-12-27 | 15223.219 |
| 2005-12-28 | 15252.901 |
| 2005-12-29 | 15211.62 |
| 2005-12-30 | 15140.235 |
| 2006-01-03 | 15261.208 |
| 2006-01-04 | 15332.761 |
| 2006-01-05 | 15340.36 |
| 2006-01-06 | 15486.647 |
| 2006-01-09 | 15560.241 |
| 2006-01-10 | 15574.37 |
| 2006-01-11 | 15618.135 |
| 2006-01-12 | 15518.889 |
| 2006-01-13 | 15538.119 |
| 2006-01-17 | 15480.946 |
| 2006-01-18 | 15426.149 |
| 2006-01-19 | 15531.721 |
| 2006-01-20 | 15262.589 |
| 2006-01-23 | 15297.759 |
| 2006-01-24 | 15366.888 |
| 2006-01-25 | 15331.345 |
| 2006-01-25 | 15453.686 |
| 2006-01-27 | 15560.733 |
| 2006-01-30 | 15579.963 |
| 2006-01-31 | 15548.994 |
| 2006-02-01 | 15532.271 |
| 2006-02-02 | 15395.946 |
| 2006-02-03 | 15318.451 |
| 2006-02-06 | 15342.158 |
| 2006-02-07 | 15196.872 |
| 2006-02-08 | 15306.028 |
| 2006-02-09 | 15277.038 |
| 2006-02-10 | 15303.141 |
| 2006-02-13 | 15231.696 |
| 2006-02-14 | 15377.725 |
| 2006-02-15 | 15438.784 |
| 2006-02-16 | 15558.375 |
| 2006-02-17 | 15539.172 |
| 2006-02-21 | 15488.008 |
| 2006-02-22 | 15600.794 |
| 2006-02-23 | 15556.578 |
| 2006-02-24 | 15585.915 |
| 2006-02-27 | 15645.01 |
| 2006-02-28 | 15480.125 |
| 2006-03-01 | 15532.404 |
| 2006-03-02 | 15514.856 |
| 2006-03-03 | 15492.875 |
| 2006-03-06 | 15383.081 |
| 2006-03-07 | 15317.962 |
| 2006-03-08 | 15337.202 |
| 2006-03-09 | 15268.45 |
| 2006-03-10 | 15376.731 |
| 2006-03-13 | 15407.944 |
| 2006-03-14 | 15567.299 |
| 2006-03-15 | 15643.188 |
| 2006-03-16 | 15666.633 |
| 2006-03-17 | 15698.442 |
| 2006-03-20 | 15681.847 |
| 2006-03-21 | 15575.65 |
| 2006-03-22 | 15672.852 |
| 2006-03-23 | 15649.526 |
| 2006-03-24 | 15686.183 |
| 2006-03-27 | 15675.771 |
| 2006-03-28 | 15592.865 |
| 2006-03-29 | 15731.645 |
| 2006-03-30 | 15706.115 |
| 2006-03-31 | 15672.685 |
| 2006-04-03 | 15547.937 |
| 2006-04-04 | 15632.435 |
| 2006-04-05 | 15702.143 |
| 2006-04-06 | 15678.978 |
| 2006-04-07 | 15521.251 |
| 2006-04-10 | 15518.499 |
| 2006-04-11 | 15388.037 |
| 2006-04-12 | 15415.774 |
| 2006-04-13 | 15433.93 |
| 2006-04-17 | 15397.156 |
| 2006-04-18 | 15666.232 |
| 2006-04-19 | 15726.431 |
| 2006-04-20 | 15729.927 |
| 2006-04-21 | 15723.737 |
| 2006-04-24 | 15678.092 |
| 2006-04-25 | 15610.888 |
| 2006-04-26 | 15641.188 |
| 2006-04-27 | 15674.572 |
| 2006-04-28 | 15688.7 |
| 2006-05-01 | 15553.028 |
| 2006-05-02 | 15638.296 |
| 2006-05-03 | 15590.96 |
| 2006-05-04 | 15655.199 |
| 2006-05-05 | 15818.518 |
| 2006-05-08 | 15816.061 |
| 2006-05-09 | 15817.942 |
| 2006-05-10 | 15786.886 |
| 2006-05-11 | 15571.083 |
| 2006-05-12 | 15373.535 |
| 2006-05-15 | 15379.577 |
| 2006-05-16 | 15358.7 |
| 2006-05-17 | 15105.024 |
| 2006-05-18 | 14998.974 |
| 2006-05-19 | 15059.781 |
| 2006-05-22 | 14978.921 |
| 2006-05-23 | 14916.104 |
| 2006-05-24 | 14923.121 |
| 2006-05-25 | 15110.584 |
| 2006-05-26 | 15202.587 |
| 2006-05-30 | 14956.834 |
| 2006-05-31 | 15094.915 |
| 2006-06-01 | 15261.037 |
| 2006-06-02 | 15292.852 |
| 2006-06-05 | 15006.394 |
| 2006-06-06 | 14964.008 |
| 2006-06-07 | 14873.793 |
| 2006-06-08 | 14874.662 |
| 2006-06-09 | 14815.899 |
| 2006-06-12 | 14595.043 |
| 2006-06-13 | 14426.063 |
| 2006-06-14 | 14494.058 |
| 2006-06-15 | 14835.232 |
| 2006-06-16 | 14775.683 |
| 2006-06-19 | 14629.932 |
| 2006-06-20 | 14616.699 |
| 2006-06-21 | 14784.341 |
| 2006-06-22 | 14711.477 |
| 2006-06-23 | 14722.915 |
| 2006-06-26 | 14801.551 |
| 2006-06-27 | 14658.662 |
| 2006-06-28 | 14727.303 |
| 2006-06-29 | 15069.943 |
| 2006-06-30 | 15074.073 |
| 2006-07-03 | 15141.696 |
| 2006-07-05 | 15013.954 |
| 2006-07-06 | 15044.472 |
| 2006-07-07 | 14925.585 |
| 2006-07-10 | 14937.866 |
| 2006-07-11 | 14998.608 |
| 2006-07-12 | 14829.214 |
| 2006-07-13 | 14618.683 |
| 2006-07-14 | 14533.003 |
| 2006-07-17 | 14499.363 |
| 2006-07-18 | 14525.658 |
| 2006-07-19 | 14812.125 |
| 2006-07-20 | 14644.965 |
| 2006-07-21 | 14512.475 |
| 2006-07-24 | 14770.648 |
| 2006-07-25 | 14878.248 |
| 2006-07-26 | 14862.761 |
| 2006-07-27 | 14777.935 |
| 2006-07-28 | 14970.349 |
| 2006-07-31 | 14959.892 |
| 2006-08-01 | 14843.667 |
| 2006-08-02 | 14934.969 |
| 2006-08-03 | 14973.119 |
| 2006-08-04 | 14956.145 |
| 2006-08-07 | 14904.219 |
| 2006-08-08 | 14837.842 |
| 2006-08-09 | 14759.264 |
| 2006-08-10 | 14829.273 |
| 2006-08-11 | 14757.233 |
| 2006-08-14 | 14776.273 |
| 2006-08-15 | 14991.715 |
| 2006-08-16 | 15128.242 |
| 2006-08-17 | 15152.594 |
| 2006-08-18 | 15201.005 |
| 2006-08-21 | 15136.647 |
| 2006-08-22 | 15152.092 |
| 2006-08-23 | 15066.662 |
| 2006-08-24 | 15092.625 |
| 2006-08-25 | 15084.511 |
| 2006-08-28 | 15171.914 |
| 2006-08-29 | 15220.174 |
| 2006-08-30 | 15238.899 |
| 2006-08-31 | 15249.09 |
| 2006-09-01 | 15401.486 |
| 2006-09-05 | 15441.337 |
| 2006-09-06 | 15265.882 |
| 2006-09-07 | 15191 |
| 2006-09-08 | 15241.844 |
| 2006-09-11 | 15236.506 |
| 2006-09-12 | 15418.578 |
| 2006-09-13 | 15490.246 |
| 2006-09-14 | 15462.513 |
| 2006-09-15 | 15501.215 |
| 2006-09-18 | 15512.007 |
| 2006-09-19 | 15470.607 |
| 2006-09-20 | 15555.461 |
| 2006-09-21 | 15469.129 |
| 2006-09-22 | 15412.337 |
| 2006-09-25 | 15544.562 |
| 2006-09-26 | 15657.149 |
| 2006-09-27 | 15675.591 |
| 2006-09-28 | 15701.681 |
| 2006-09-29 | 15656.75 |
| 2006-10-02 | 15675.391 |
| 2006-10-03 | 15694.688 |
| 2006-10-04 | 15893.771 |
| 2006-10-05 | 15965.121 |
| 2006-10-06 | 15917.68 |
| 2006-10-09 | 15951.403 |
| 2006-10-10 | 15990.481 |
| 2006-10-11 | 15940.186 |
| 2006-10-12 | 16109.674 |
| 2006-10-13 | 16155.334 |
| 2006-10-16 | 16215.856 |
| 2006-10-17 | 16148.61 |
| 2006-10-18 | 16161.751 |
| 2006-10-19 | 16185.4 |
| 2006-10-20 | 16180.576 |
| 2006-10-23 | 16274.255 |
| 2006-10-24 | 16279.586 |
| 2006-10-25 | 16341.548 |
| 2006-10-26 | 16447.282 |
| 2006-10-27 | 16301.726 |
| 2006-10-30 | 16318.075 |
| 2006-10-31 | 16311.929 |
| 2006-11-01 | 16194.625 |
| 2006-11-02 | 16181.725 |
| 2006-11-03 | 16164.278 |
| 2006-11-06 | 16353.131 |
| 2006-11-07 | 16386.373 |
| 2006-11-08 | 16436.873 |
| 2006-11-09 | 16346.599 |
| 2006-11-10 | 16392.209 |
| 2006-11-13 | 16436.424 |
| 2006-11-14 | 16559.031 |
| 2006-11-15 | 16618.214 |
| 2006-11-16 | 16645.573 |
| 2006-11-17 | 16654.043 |
| 2006-11-20 | 16660.812 |
| 2006-11-21 | 16699.05 |
| 2006-11-22 | 16744.235 |
| 2006-11-24 | 16699.085 |
| 2006-11-27 | 16442.284 |
| 2006-11-28 | 16492.323 |
| 2006-11-29 | 16650.085 |
| 2006-11-30 | 16676.003 |
| 2006-12-01 | 16605.222 |
| 2006-12-04 | 16770.334 |
| 2006-12-05 | 16834.453 |
| 2006-12-06 | 16817.61 |
| 2006-12-07 | 16749.444 |
| 2006-12-08 | 16775.264 |
| 2006-12-11 | 16805.72 |
| 2006-12-12 | 16775.429 |
| 2006-12-13 | 16790.586 |
| 2006-12-14 | 16923.473 |
| 2006-12-15 | 16934.502 |
| 2006-12-18 | 16854.777 |
| 2006-12-19 | 16881.269 |
| 2006-12-20 | 16867.941 |
| 2006-12-21 | 16802.405 |
| 2006-12-22 | 16723.105 |
| 2006-12-26 | 16797.793 |
| 2006-12-27 | 16922.671 |
| 2006-12-28 | 16896.71 |
| 2006-12-29 | 16817.338 |
| 2007-01-03 | 16753.412 |
| 2007-01-04 | 16780.682 |
| 2007-01-05 | 16657.09 |
| 2007-01-08 | 16695.132 |
| 2007-01-09 | 16704.022 |
| 2007-01-10 | 16748.52 |
| 2007-01-11 | 16875.158 |
| 2007-01-12 | 16964.248 |
| 2007-01-16 | 16971.88 |
| 2007-01-17 | 16953.97 |
| 2007-01-18 | 16875.911 |
| 2007-01-19 | 16940.482 |
| 2007-01-22 | 16851.063 |
| 2007-01-23 | 16923.76 |
| 2007-01-24 | 17072.259 |
| 2007-01-25 | 16885.071 |
| 2007-01-26 | 16880.638 |
| 2007-01-29 | 16885.988 |
| 2007-01-30 | 16979.159 |
| 2007-01-31 | 17088.804 |
| 2007-02-01 | 17095.482 |
| 2007-02-02 | 17127.146 |
| 2007-02-05 | 17108.01 |
| 2007-02-06 | 17132.362 |
| 2007-02-07 | 17173.243 |
| 2007-02-08 | 17156.505 |
| 2007-02-09 | 17026.084 |
| 2007-02-12 | 16963.88 |
| 2007-02-13 | 17091.435 |
| 2007-02-14 | 17209.141 |
| 2007-02-15 | 17231.775 |
| 2007-02-16 | 17233.822 |
| 2007-02-20 | 17307.383 |
| 2007-02-21 | 17295.195 |
| 2007-02-22 | 17286.528 |
| 2007-02-23 | 17229.353 |
| 2007-02-26 | 17198.742 |
| 2007-02-27 | 16613.359 |
| 2007-02-28 | 16693.377 |
| 2007-03-01 | 16501.502 |
| 2007-03-02 | 16297.61 |
| 2007-03-05 | 16107.998 |
| 2007-03-06 | 16373.22 |
| 2007-03-07 | 16335.989 |
| 2007-03-08 | 16453.004 |
| 2007-03-09 | 16475.12 |
| 2007-03-12 | 16525.971 |
| 2007-03-13 | 16188.512 |
| 2007-03-14 | 16281.359 |
| 2007-03-15 | 16357.445 |
| 2007-03-16 | 16290.945 |
| 2007-03-19 | 16470.321 |
| 2007-03-20 | 16578.249 |
| 2007-03-21 | 16850.298 |
| 2007-03-22 | 16854.355 |
| 2007-03-23 | 16872.924 |
| 2007-03-26 | 16881.258 |
| 2007-03-27 | 16778.258 |
| 2007-03-28 | 16656.038 |
| 2007-03-29 | 16706.901 |
| 2007-03-30 | 16702.311 |
| 2007-04-02 | 16639.321 |
| 2007-04-03 | 16792.457 |
| 2007-04-04 | 16808.522 |
| 2007-04-05 | 16860.669 |
| 2007-04-09 | 16869.537 |
| 2007-04-10 | 16912.655 |
| 2007-04-11 | 16806.173 |
| 2007-04-12 | 16909.039 |
| 2007-04-13 | 16971.297 |
| 2007-04-16 | 17150.103 |
| 2007-04-17 | 17172.25 |
| 2007-04-18 | 17170.084 |
| 2007-04-19 | 17131.896 |
| 2007-04-20 | 17286.24 |
| 2007-04-23 | 17256.251 |
| 2007-04-24 | 17243.145 |
| 2007-04-25 | 17401.982 |
| 2007-04-26 | 17399.241 |
| 2007-04-27 | 17381.644 |
| 2007-04-30 | 17219.951 |
| 2007-05-01 | 17151.421 |
| 2007-05-02 | 17286.846 |
| 2007-05-03 | 17351.736 |
| 2007-05-04 | 17392.063 |
| 2007-05-07 | 17424.731 |
| 2007-05-08 | 17402.307 |
| 2007-05-09 | 17467.038 |
| 2007-05-10 | 17222.974 |
| 2007-05-11 | 17392.566 |
| 2007-05-14 | 17342.671 |
| 2007-05-15 | 17293.885 |
| 2007-05-16 | 17426.185 |
| 2007-05-17 | 17406.772 |
| 2007-05-18 | 17519.017 |
| 2007-05-21 | 17577.292 |
| 2007-05-22 | 17596.636 |
| 2007-05-23 | 17568.363 |
| 2007-05-24 | 17377.869 |
| 2007-05-25 | 17478.061 |
| 2007-05-29 | 17531.265 |
| 2007-05-30 | 17675 |
| 2007-05-31 | 17698.923 |
| 2007-06-01 | 17745.243 |
| 2007-06-04 | 17786.966 |
| 2007-06-05 | 17689.972 |
| 2007-06-06 | 17528.727 |
| 2007-06-07 | 17216.805 |
| 2007-06-08 | 17402.967 |
| 2007-06-11 | 17417.761 |
| 2007-06-12 | 17234.57 |
| 2007-06-13 | 17476.597 |
| 2007-06-14 | 17562.909 |
| 2007-06-15 | 17687.23 |
| 2007-06-18 | 17667.249 |
| 2007-06-19 | 17696.769 |
| 2007-06-20 | 17469.32 |
| 2007-06-21 | 17566.302 |
| 2007-06-22 | 17368.979 |
| 2007-06-25 | 17296.102 |
| 2007-06-26 | 17238.717 |
| 2007-06-27 | 17402.658 |
| 2007-06-28 | 17405.537 |
| 2007-06-29 | 17377.353 |
| 2007-07-02 | 17573.766 |
| 2007-07-03 | 17632.982 |
| 2007-07-05 | 17654.18 |
| 2007-07-06 | 17720.813 |
| 2007-07-09 | 17739.68 |
| 2007-07-10 | 17488.072 |
| 2007-07-11 | 17578.417 |
| 2007-07-12 | 17887.196 |
| 2007-07-13 | 17942.058 |
| 2007-07-16 | 17889.664 |
| 2007-07-17 | 17890.167 |
| 2007-07-18 | 17850.742 |
| 2007-07-19 | 17936.105 |
| 2007-07-20 | 17719.83 |
| 2007-07-23 | 17779.024 |
| 2007-07-24 | 17419.965 |
| 2007-07-25 | 17474.45 |
| 2007-07-26 | 17070.744 |
| 2007-07-27 | 16810.554 |
| 2007-07-30 | 16972.789 |
| 2007-07-31 | 16778.421 |
| 2007-08-01 | 16892.523 |
| 2007-08-02 | 16977.721 |
| 2007-08-03 | 16522.672 |
| 2007-08-06 | 16855.567 |
| 2007-08-07 | 16970.475 |
| 2007-08-08 | 17225.475 |
| 2007-08-09 | 16760.775 |
| 2007-08-10 | 16761.588 |
| 2007-08-13 | 16752.807 |
| 2007-08-14 | 16440.232 |
| 2007-08-15 | 16195.329 |
| 2007-08-16 | 16245.644 |
| 2007-08-17 | 16636.217 |
| 2007-08-20 | 16651.145 |
| 2007-08-21 | 16681.38 |
| 2007-08-22 | 16887.233 |
| 2007-08-23 | 16852.854 |
| 2007-08-24 | 17053.727 |
| 2007-08-27 | 16908.47 |
| 2007-08-28 | 16514.99 |
| 2007-08-29 | 16868.378 |
| 2007-08-30 | 16803.042 |
| 2007-08-31 | 16998.191 |
| 2007-09-04 | 17133.665 |
| 2007-09-05 | 16949.979 |
| 2007-09-06 | 17016.905 |
| 2007-09-07 | 16732.064 |
| 2007-09-10 | 16684.125 |
| 2007-09-11 | 16907.69 |
| 2007-09-12 | 16900.281 |
| 2007-09-13 | 17021.528 |
| 2007-09-14 | 17042.695 |
| 2007-09-17 | 16942.044 |
| 2007-09-18 | 17435.665 |
| 2007-09-19 | 17549.252 |
| 2007-09-20 | 17435.54 |
| 2007-09-21 | 17512.307 |
| 2007-09-24 | 17425.481 |
| 2007-09-25 | 17415.434 |
| 2007-09-26 | 17511.279 |
| 2007-09-27 | 17595.068 |
| 2007-09-28 | 17538.668 |
| 2007-10-01 | 17744.734 |
| 2007-10-02 | 17766.778 |
| 2007-10-03 | 17678.247 |
| 2007-10-04 | 17717.551 |
| 2007-10-05 | 17913.264 |
| 2007-10-08 | 17863.82 |
| 2007-10-09 | 18007.822 |
| 2007-10-10 | 17998.184 |
| 2007-10-11 | 17894.079 |
| 2007-10-12 | 17988.01 |
| 2007-10-15 | 17827.273 |
| 2007-10-16 | 17709.622 |
| 2007-10-17 | 17746.636 |
| 2007-10-18 | 17735.062 |
| 2007-10-19 | 17287.586 |
| 2007-10-22 | 17371.047 |
| 2007-10-23 | 17528.88 |
| 2007-10-24 | 17473.523 |
| 2007-10-25 | 17442.969 |
| 2007-10-26 | 17679.067 |
| 2007-10-29 | 17751.25 |
| 2007-10-30 | 17637.929 |
| 2007-10-31 | 17855.925 |
| 2007-11-01 | 17283.587 |
| 2007-11-02 | 17292.342 |
| 2007-11-05 | 17184.865 |
| 2007-11-06 | 17389.728 |
| 2007-11-07 | 16904.338 |
| 2007-11-08 | 16899.23 |
| 2007-11-09 | 16658.659 |
| 2007-11-12 | 16469.98 |
| 2007-11-13 | 16932.006 |
| 2007-11-14 | 16819.478 |
| 2007-11-15 | 16607.265 |
| 2007-11-16 | 16679.033 |
| 2007-11-19 | 16379.333 |
| 2007-11-20 | 16427.726 |
| 2007-11-21 | 16181.866 |
| 2007-11-23 | 16442.233 |
| 2007-11-26 | 16092.011 |
| 2007-11-27 | 16307.836 |
| 2007-11-28 | 16780.451 |
| 2007-11-29 | 16787.45 |
| 2007-11-30 | 16911.643 |
| 2007-12-03 | 16827.845 |
| 2007-12-04 | 16718.46 |
| 2007-12-05 | 16957.958 |
| 2007-12-06 | 17229.765 |
| 2007-12-07 | 17220.404 |
| 2007-12-10 | 17352.149 |
| 2007-12-11 | 16912.66 |
| 2007-12-12 | 16992.455 |
| 2007-12-13 | 16999.833 |
| 2007-12-14 | 16764.426 |
| 2007-12-17 | 16495.078 |
| 2007-12-18 | 16603.964 |
| 2007-12-19 | 16596.575 |
| 2007-12-20 | 16699.625 |
| 2007-12-21 | 16975.807 |
| 2007-12-24 | 17124.97 |
| 2007-12-26 | 17142.015 |
| 2007-12-27 | 16881.178 |
| 2007-12-28 | 16899.152 |
| 2007-12-31 | 16794.833 |
| 2008-01-02 | 16479.452 |
| 2008-01-03 | 16450.527 |
| 2008-01-04 | 16025.312 |
| 2008-01-07 | 16046.681 |
| 2008-01-08 | 15746.042 |
| 2008-01-09 | 15923.775 |
| 2008-01-10 | 16064.025 |
| 2008-01-11 | 15835.512 |
| 2008-01-14 | 15997.729 |
| 2008-01-15 | 15609.175 |
| 2008-01-16 | 15531.523 |
| 2008-01-17 | 15099.271 |
| 2008-01-18 | 15007.692 |
| 2008-01-22 | 14873.735 |
| 2008-01-23 | 15193.399 |
| 2008-01-24 | 15345.985 |
| 2008-01-25 | 15137.567 |
| 2008-01-28 | 15404.929 |
| 2008-01-29 | 15494.095 |
| 2008-01-30 | 15400.294 |
| 2008-01-31 | 15670.994 |
| 2008-02-01 | 15844.247 |
| 2008-02-04 | 15690.787 |
| 2008-02-05 | 15220.309 |
| 2008-02-06 | 15087.617 |
| 2008-02-07 | 15211.111 |
| 2008-02-08 | 15162.694 |
| 2008-02-11 | 15249.128 |
| 2008-02-12 | 15345.49 |
| 2008-02-13 | 15565.774 |
| 2008-02-14 | 15354.946 |
| 2008-02-15 | 15351.348 |
| 2008-02-19 | 15343.455 |
| 2008-02-20 | 15470.109 |
| 2008-02-21 | 15265.724 |
| 2008-02-22 | 15362.93 |
| 2008-02-25 | 15591.197 |
| 2008-02-26 | 15703.009 |
| 2008-02-27 | 15680.128 |
| 2008-02-28 | 15535.73 |
| 2008-02-29 | 15130.097 |
| 2008-03-03 | 14994.165 |
| 2008-03-04 | 14934.76 |
| 2008-03-05 | 15019.347 |
| 2008-03-06 | 14675.713 |
| 2008-03-07 | 14550.215 |
| 2008-03-10 | 14293.966 |
| 2008-03-11 | 14811.29 |
| 2008-03-12 | 14691.844 |
| 2008-03-13 | 14789.262 |
| 2008-03-14 | 14483.909 |
| 2008-03-17 | 14299.741 |
| 2008-03-18 | 14887.461 |
| 2008-03-19 | 14533.371 |
| 2008-03-20 | 14866.816 |
| 2008-03-24 | 15128.069 |
| 2008-03-25 | 15186.961 |
| 2008-03-26 | 15069.556 |
| 2008-03-27 | 14897.382 |
| 2008-03-28 | 14776.208 |
| 2008-03-31 | 14861.899 |
| 2008-04-01 | 15275.555 |
| 2008-04-02 | 15263.4 |
| 2008-04-03 | 15292.829 |
| 2008-04-04 | 15317.228 |
| 2008-04-07 | 15341.118 |
| 2008-04-08 | 15279.644 |
| 2008-04-09 | 15131.655 |
| 2008-04-10 | 15215.223 |
| 2008-04-11 | 14908.852 |
| 2008-04-14 | 14859.156 |
| 2008-04-15 | 14929.062 |
| 2008-04-16 | 15276.275 |
| 2008-04-17 | 15265.428 |
| 2008-04-18 | 15531.633 |
| 2008-04-21 | 15507.4 |
| 2008-04-22 | 15361.14 |
| 2008-04-23 | 15401.483 |
| 2008-04-24 | 15501.96 |
| 2008-04-25 | 15611.311 |
| 2008-04-28 | 15609.893 |
| 2008-04-29 | 15548.519 |
| 2008-04-30 | 15502.624 |
| 2008-05-01 | 15624.921 |
| 2008-05-02 | 15658.786 |
| 2008-05-05 | 15601.649 |
| 2008-05-06 | 15721.922 |
| 2008-05-07 | 15456.171 |
| 2008-05-08 | 15515.944 |
| 2008-05-09 | 15426.932 |
| 2008-05-12 | 15593.837 |
| 2008-05-13 | 15609.868 |
| 2008-05-14 | 15664.389 |
| 2008-05-15 | 15827.075 |
| 2008-05-16 | 15848.534 |
| 2008-05-19 | 15847.82 |
| 2008-05-20 | 15723.416 |
| 2008-05-21 | 15475.465 |
| 2008-05-22 | 15522.603 |
| 2008-05-23 | 15332.898 |
| 2008-05-27 | 15447.842 |
| 2008-05-28 | 15526.987 |
| 2008-05-29 | 15621.416 |
| 2008-05-30 | 15669.444 |
| 2008-06-02 | 15365.316 |
| 2008-06-03 | 15296.806 |
| 2008-06-04 | 15296.74 |
| 2008-06-05 | 15599.252 |
| 2008-06-06 | 15147.47 |
| 2008-06-09 | 15139.159 |
| 2008-06-10 | 15088.543 |
| 2008-06-11 | 14836.778 |
| 2008-06-12 | 14879.192 |
| 2008-06-13 | 15109.429 |
| 2008-06-16 | 15139.92 |
| 2008-06-17 | 15056.332 |
| 2008-06-18 | 14912.98 |
| 2008-06-19 | 14967.088 |
| 2008-06-20 | 14701.747 |
| 2008-06-23 | 14680.883 |
| 2008-06-24 | 14600.058 |
| 2008-06-25 | 14693.295 |
| 2008-06-26 | 14277.748 |
| 2008-06-27 | 14229.775 |
| 2008-06-30 | 14221.638 |
| 2008-07-01 | 14184.63 |
| 2008-07-02 | 13897.15 |
| 2008-07-03 | 13868.084 |
| 2008-07-07 | 13747.101 |
| 2008-07-08 | 13998.232 |
| 2008-07-09 | 13697.842 |
| 2008-07-10 | 13793.2 |
| 2008-07-11 | 13673.256 |
| 2008-07-14 | 13545.401 |
| 2008-07-15 | 13407.743 |
| 2008-07-16 | 13746.982 |
| 2008-07-17 | 13905.991 |
| 2008-07-18 | 13898.427 |
| 2008-07-21 | 13928.337 |
| 2008-07-22 | 14120.156 |
| 2008-07-23 | 14161.386 |
| 2008-07-24 | 13819.918 |
| 2008-07-25 | 13891.49 |
| 2008-07-28 | 13649.167 |
| 2008-07-29 | 13959.881 |
| 2008-07-30 | 14178.732 |
| 2008-07-31 | 14010.298 |
| 2008-08-01 | 14002.691 |
| 2008-08-04 | 13839.937 |
| 2008-08-05 | 14203.753 |
| 2008-08-06 | 14270.104 |
| 2008-08-07 | 14021.726 |
| 2008-08-08 | 14338.324 |
| 2008-08-11 | 14458.738 |
| 2008-08-12 | 14301.895 |
| 2008-08-13 | 14282.262 |
| 2008-08-14 | 14372.113 |
| 2008-08-15 | 14419.538 |
| 2008-08-18 | 14209.077 |
| 2008-08-19 | 14070.106 |
| 2008-08-20 | 14147.007 |
| 2008-08-21 | 14165.325 |
| 2008-08-22 | 14325.428 |
| 2008-08-25 | 14049.485 |
| 2008-08-26 | 14099.887 |
| 2008-08-27 | 14223.647 |
| 2008-08-28 | 14437.617 |
| 2008-08-29 | 14259.403 |
| 2008-09-02 | 14213.829 |
| 2008-09-03 | 14173.367 |
| 2008-09-04 | 13767.138 |
| 2008-09-05 | 13820.122 |
| 2008-09-08 | 14060.065 |
| 2008-09-09 | 13574.283 |
| 2008-09-10 | 13676.172 |
| 2008-09-11 | 13834.375 |
| 2008-09-12 | 13887.903 |
| 2008-09-15 | 13256.387 |
| 2008-09-16 | 13488.67 |
| 2008-09-17 | 12864.29 |
| 2008-09-18 | 13436.828 |
| 2008-09-19 | 14015.48 |
| 2008-09-22 | 13449.971 |
| 2008-09-23 | 13244.06 |
| 2008-09-24 | 13200.465 |
| 2008-09-25 | 13424.088 |
| 2008-09-26 | 13433.292 |
| 2008-09-29 | 12318.909 |
| 2008-09-30 | 12920.18 |
| 2008-10-01 | 12978.813 |
| 2008-10-02 | 12413.15 |
| 2008-10-03 | 12225.042 |
| 2008-10-06 | 11725.752 |
| 2008-10-07 | 11053.412 |
| 2008-10-08 | 10909.927 |
| 2008-10-09 | 10098.279 |
| 2008-10-10 | 10024.465 |
| 2008-10-13 | 11167.365 |
| 2008-10-14 | 11062.71 |
| 2008-10-15 | 10068.021 |
| 2008-10-16 | 10495.574 |
| 2008-10-17 | 10457.051 |
| 2008-10-20 | 10929.128 |
| 2008-10-21 | 10607.197 |
| 2008-10-22 | 9980.611 |
| 2008-10-23 | 10014.1 |
| 2008-10-24 | 9678.716 |
| 2008-10-27 | 9344.816 |
| 2008-10-28 | 10266.438 |
| 2008-10-29 | 10236.741 |
| 2008-10-30 | 10534.625 |
| 2008-10-31 | 10736.514 |
| 2008-11-03 | 10925.435 |
| 2008-11-04 | 11323.295 |
| 2008-11-05 | 10738.126 |
| 2008-11-06 | 10212.704 |
| 2008-11-07 | 10486.362 |
| 2008-11-10 | 10331.582 |
| 2008-11-11 | 10095.473 |
| 2008-11-12 | 9565.479 |
| 2008-11-13 | 10219.393 |
| 2008-11-14 | 9773.227 |
| 2008-11-17 | 9534.384 |
| 2008-11-18 | 9597.482 |
| 2008-11-19 | 8980.299 |
| 2008-11-20 | 8372.058 |
| 2008-11-21 | 8881.478 |
| 2008-11-24 | 9455.711 |
| 2008-11-25 | 9544.805 |
| 2008-11-26 | 9921.15 |
| 2008-11-28 | 10023.489 |
| 2008-12-01 | 9201.979 |
| 2008-12-02 | 9573.471 |
| 2008-12-03 | 9820.788 |
| 2008-12-04 | 9531.226 |
| 2008-12-05 | 9892.641 |
| 2008-12-08 | 10278.003 |
| 2008-12-09 | 10043.457 |
| 2008-12-10 | 10178.942 |
| 2008-12-11 | 9856.488 |
| 2008-12-12 | 9964.007 |
| 2008-12-15 | 9810.202 |
| 2008-12-16 | 10324.652 |
| 2008-12-17 | 10265.356 |
| 2008-12-18 | 10060.656 |
| 2008-12-19 | 10104.18 |
| 2008-12-22 | 9908.991 |
| 2008-12-23 | 9821.015 |
| 2008-12-24 | 9863.825 |
| 2008-12-26 | 9929.111 |
| 2008-12-29 | 9863.44 |
| 2008-12-30 | 10110.43 |
| 2008-12-31 | 10288.963 |
| 2009-01-02 | 10557.078 |
| 2009-01-05 | 10532.931 |
| 2009-01-06 | 10639.093 |
| 2009-01-07 | 10317.033 |
| 2009-01-08 | 10365.351 |
| 2009-01-09 | 10130.096 |
| 2009-01-12 | 9889.194 |
| 2009-01-13 | 9925.19 |
| 2009-01-14 | 9583.458 |
| 2009-01-15 | 9623.547 |
| 2009-01-16 | 9698.74 |
| 2009-01-20 | 9168.979 |
| 2009-01-21 | 9564.812 |
| 2009-01-22 | 9399.802 |
| 2009-01-23 | 9452.934 |
| 2009-01-26 | 9505.412 |
| 2009-01-27 | 9609.77 |
| 2009-01-28 | 9936.238 |
| 2009-01-29 | 9603.919 |
| 2009-01-30 | 9397.142 |
| 2009-02-02 | 9359.773 |
| 2009-02-03 | 9493.656 |
| 2009-02-04 | 9433.26 |
| 2009-02-05 | 9585.371 |
| 2009-02-06 | 9854.831 |
| 2009-02-09 | 9859.755 |
| 2009-02-10 | 9399.596 |
| 2009-02-11 | 9467.911 |
| 2009-02-12 | 9492.859 |
| 2009-02-13 | 9406.842 |
| 2009-02-17 | 8989.971 |
| 2009-02-18 | 8961.624 |
| 2009-02-19 | 8849.874 |
| 2009-02-20 | 8752.247 |
| 2009-02-23 | 8441.988 |
| 2009-02-24 | 8787.751 |
| 2009-02-25 | 8684.492 |
| 2009-02-26 | 8547.176 |
| 2009-02-27 | 8384.049 |
| 2009-03-02 | 7960.72 |
| 2009-03-03 | 7904.589 |
| 2009-03-04 | 8096.986 |
| 2009-03-05 | 7750.933 |
| 2009-03-06 | 7761.004 |
| 2009-03-09 | 7674.894 |
| 2009-03-10 | 8172.03 |
| 2009-03-11 | 8190.013 |
| 2009-03-12 | 8534.141 |
| 2009-03-13 | 8589.724 |
| 2009-03-16 | 8538.696 |
| 2009-03-17 | 8815.648 |
| 2009-03-18 | 9008.896 |
| 2009-03-19 | 8913.017 |
| 2009-03-20 | 8730.064 |
| 2009-03-23 | 9341.6 |
| 2009-03-24 | 9141.246 |
| 2009-03-25 | 9237.942 |
| 2009-03-26 | 9486.158 |
| 2009-03-27 | 9273.338 |
| 2009-03-30 | 8954.444 |
| 2009-03-31 | 9078.971 |
| 2009-04-01 | 9200.863 |
| 2009-04-02 | 9489.159 |
| 2009-04-03 | 9599.188 |
| 2009-04-06 | 9508.18 |
| 2009-04-07 | 9264.657 |
| 2009-04-08 | 9386.943 |
| 2009-04-09 | 9761.492 |
| 2009-04-13 | 9789.097 |
| 2009-04-14 | 9583.628 |
| 2009-04-15 | 9702.509 |
| 2009-04-16 | 9868.754 |
| 2009-04-17 | 9923.997 |
| 2009-04-20 | 9484.75 |
| 2009-04-21 | 9706.45 |
| 2009-04-22 | 9645.156 |
| 2009-04-23 | 9711.305 |
| 2009-04-24 | 9893.49 |
| 2009-04-27 | 9787.747 |
| 2009-04-28 | 9771.036 |
| 2009-04-29 | 10009.413 |
| 2009-04-30 | 10004.982 |
| 2009-05-01 | 10015.865 |
| 2009-05-04 | 10365.806 |
| 2009-05-05 | 10328.675 |
| 2009-05-06 | 10477.311 |
| 2009-05-07 | 10317.667 |
| 2009-05-08 | 10584.553 |
| 2009-05-11 | 10361.888 |
| 2009-05-12 | 10328.998 |
| 2009-05-13 | 10016.689 |
| 2009-05-14 | 10131.722 |
| 2009-05-15 | 10022.032 |
| 2009-05-18 | 10345.593 |
| 2009-05-19 | 10332.092 |
| 2009-05-20 | 10285.845 |
| 2009-05-21 | 10112.088 |
| 2009-05-22 | 10093.745 |
| 2009-05-26 | 10377.226 |
| 2009-05-27 | 10189.511 |
| 2009-05-28 | 10328.007 |
| 2009-05-29 | 10472.024 |
| 2009-06-01 | 10667.457 |
| 2009-06-02 | 10697.154 |
| 2009-06-03 | 10548.912 |
| 2009-06-04 | 10677.212 |
| 2009-06-05 | 10655.174 |
| 2009-06-08 | 10630.587 |
| 2009-06-09 | 10679.817 |
| 2009-06-10 | 10639.36 |
| 2009-06-11 | 10705.11 |
| 2009-06-12 | 10706.148 |
| 2009-06-15 | 10447.881 |
| 2009-06-16 | 10306.459 |
| 2009-06-17 | 10290.556 |
| 2009-06-18 | 10367.486 |
| 2009-06-19 | 10404.941 |
| 2009-06-22 | 10074.258 |
| 2009-06-23 | 10085.79 |
| 2009-06-24 | 10167.299 |
| 2009-06-25 | 10386.953 |
| 2009-06-26 | 10395.66 |
| 2009-06-29 | 10477.213 |
| 2009-06-30 | 10404.61 |
| 2009-07-01 | 10480.157 |
| 2009-07-02 | 10178.417 |
| 2009-07-06 | 10176.792 |
| 2009-07-07 | 9974.707 |
| 2009-07-08 | 9954.016 |
| 2009-07-09 | 9986.711 |
| 2009-07-10 | 9959.697 |
| 2009-07-13 | 10198.058 |
| 2009-07-14 | 10250.152 |
| 2009-07-15 | 10568.019 |
| 2009-07-16 | 10673.057 |
| 2009-07-17 | 10659.628 |
| 2009-07-20 | 10796.554 |
| 2009-07-21 | 10823.148 |
| 2009-07-22 | 10834.82 |
| 2009-07-23 | 11089.739 |
| 2009-07-24 | 11136.505 |
| 2009-07-27 | 11166.614 |
| 2009-07-28 | 11145.149 |
| 2009-07-29 | 11081.892 |
| 2009-07-30 | 11226.412 |
| 2009-07-31 | 11228.479 |
| 2009-08-03 | 11395.014 |
| 2009-08-04 | 11419.619 |
| 2009-08-05 | 11407.256 |
| 2009-08-06 | 11324.532 |
| 2009-08-07 | 11501.637 |
| 2009-08-10 | 11454.943 |
| 2009-08-11 | 11316.371 |
| 2009-08-12 | 11444.642 |
| 2009-08-13 | 11529.98 |
| 2009-08-14 | 11412.759 |
| 2009-08-17 | 11129.615 |
| 2009-08-18 | 11249.979 |
| 2009-08-19 | 11330.266 |
| 2009-08-20 | 11448.061 |
| 2009-08-21 | 11663.358 |
| 2009-08-24 | 11649.539 |
| 2009-08-25 | 11684.566 |
| 2009-08-26 | 11681.588 |
| 2009-08-27 | 11715.743 |
| 2009-08-28 | 11693.477 |
| 2009-08-31 | 11593.625 |
| 2009-09-01 | 11265.596 |
| 2009-09-02 | 11324.991 |
| 2009-09-03 | 11394.526 |
| 2009-09-04 | 11548.034 |
| 2009-09-08 | 11659.87 |
| 2009-09-09 | 11764.376 |
| 2009-09-10 | 11893.052 |
| 2009-09-11 | 11883.221 |
| 2009-09-14 | 11962.4 |
| 2009-09-15 | 12013.319 |
| 2009-09-16 | 12205.182 |
| 2009-09-17 | 12167.918 |
| 2009-09-18 | 12193.07 |
| 2009-09-21 | 12160.545 |
| 2009-09-22 | 12249.279 |
| 2009-09-23 | 12086.767 |
| 2009-09-24 | 11982.503 |
| 2009-09-25 | 11908.328 |
| 2009-09-28 | 12127.194 |
| 2009-09-29 | 12072.218 |
| 2009-09-30 | 12063.258 |
| 2009-10-01 | 11730 |
| 2009-10-02 | 11671.311 |
| 2009-10-05 | 11854.093 |
| 2009-10-06 | 12019.631 |
| 2009-10-07 | 12055.516 |
| 2009-10-08 | 12153.954 |
| 2009-10-09 | 12272.112 |
| 2009-10-13 | 12199.902 |
| 2009-10-14 | 12455.587 |
| 2009-10-15 | 12503.452 |
| 2009-10-16 | 12394.664 |
| 2009-10-19 | 12517.226 |
| 2009-10-20 | 12422.631 |
| 2009-10-21 | 12315.319 |
| 2009-10-22 | 12439.94 |
| 2009-10-23 | 12289.157 |
| 2009-10-26 | 12136.072 |
| 2009-10-27 | 12078.881 |
| 2009-10-28 | 11803.762 |
| 2009-10-29 | 12074.102 |
| 2009-10-30 | 11732.951 |
| 2009-11-02 | 11790.825 |
| 2009-11-03 | 11845.731 |
| 2009-11-04 | 11849.494 |
| 2009-11-05 | 12086.304 |
| 2009-11-06 | 12115.418 |
| 2009-11-09 | 12375.995 |
| 2009-11-10 | 12373.288 |
| 2009-11-11 | 12433.178 |
| 2009-11-12 | 12300.909 |
| 2009-11-13 | 12369.646 |
| 2009-11-16 | 12573.457 |
| 2009-11-17 | 12575.702 |
| 2009-11-18 | 12574.557 |
| 2009-11-19 | 12383.95 |
| 2009-11-20 | 12301.921 |
| 2009-11-23 | 12502.135 |
| 2009-11-24 | 12439.714 |
| 2009-11-25 | 12506.954 |
| 2009-11-27 | 12286.693 |
| 2009-11-30 | 12331.597 |
| 2009-12-01 | 12590.778 |
| 2009-12-02 | 12616.74 |
| 2009-12-03 | 12507.831 |
| 2009-12-04 | 12599.487 |
| 2009-12-07 | 12576.066 |
| 2009-12-08 | 12454.053 |
| 2009-12-09 | 12493.152 |
| 2009-12-10 | 12554.02 |
| 2009-12-11 | 12609.994 |
| 2009-12-14 | 12716.563 |
| 2009-12-15 | 12654.885 |
| 2009-12-16 | 12684.143 |
| 2009-12-17 | 12538.553 |
| 2009-12-18 | 12598.611 |
| 2009-12-21 | 12751.59 |
| 2009-12-22 | 12781.724 |
| 2009-12-23 | 12878.374 |
| 2009-12-24 | 12946.742 |
| 2009-12-28 | 12957.382 |
| 2009-12-29 | 12941.527 |
| 2009-12-30 | 12942.271 |
| 2009-12-31 | 12813.334 |
| 2010-01-04 | 12914.764 |
| 2010-01-05 | 12954.958 |
| 2010-01-06 | 12966.679 |
| 2010-01-07 | 13018.045 |
| 2010-01-08 | 13060.425 |
| 2010-01-11 | 13079.133 |
| 2010-01-12 | 12937.371 |
| 2010-01-13 | 13050.022 |
| 2010-01-14 | 13081.253 |
| 2010-01-15 | 12937.239 |
| 2010-01-19 | 13103.816 |
| 2010-01-20 | 12970.579 |
| 2010-01-21 | 12741.871 |
| 2010-01-22 | 12466.443 |
| 2010-01-25 | 12515.481 |
| 2010-01-26 | 12460.995 |
| 2010-01-27 | 12522.313 |
| 2010-01-28 | 12312.818 |
| 2010-01-29 | 12249.643 |
| 2010-02-01 | 12421.528 |
| 2010-02-02 | 12573.05 |
| 2010-02-03 | 12504.785 |
| 2010-02-04 | 12108.105 |
| 2010-02-05 | 12143.501 |
| 2010-02-08 | 12043.979 |
| 2010-02-09 | 12198.983 |
| 2010-02-10 | 12173.076 |
| 2010-02-11 | 12309.805 |
| 2010-02-12 | 12301.876 |
| 2010-02-15 | 12244.581 |
| 2010-02-16 | 12521.489 |
| 2010-02-17 | 12581.704 |
| 2010-02-18 | 12659.964 |
| 2010-02-19 | 12691.242 |
| 2010-02-22 | 12683.587 |
| 2010-02-23 | 12528.517 |
| 2010-02-24 | 12580.156 |
| 2010-02-25 | 12626.227 |
| 2010-02-26 | 12643.249 |
| 2010-03-01 | 12740.938 |
| 2010-03-02 | 12783.167 |
| 2010-03-03 | 12790.922 |
| 2010-03-04 | 12836.017 |
| 2010-03-05 | 13022.641 |
| 2010-03-08 | 13029.214 |
| 2010-03-09 | 13055.212 |
| 2010-03-10 | 13123.155 |
| 2010-03-11 | 13175.611 |
| 2010-03-12 | 13177.197 |
| 2010-03-15 | 13171.75 |
| 2010-03-16 | 13277.11 |
| 2010-03-17 | 13355.017 |
| 2010-03-18 | 13271.641 |
| 2010-03-19 | 13252.435 |
| 2010-03-22 | 13339.453 |
| 2010-03-23 | 13439.223 |
| 2010-03-24 | 13362.673 |
| 2010-03-25 | 13327.454 |
| 2010-03-26 | 13333.82 |
| 2010-03-29 | 13411.814 |
| 2010-03-30 | 13415.467 |
| 2010-03-31 | 13367.966 |
| 2010-04-01 | 13445.095 |
| 2010-04-05 | 13577.437 |
| 2010-04-06 | 13505.747 |
| 2010-04-07 | 13533.251 |
| 2010-04-08 | 13573.136 |
| 2010-04-09 | 13665.101 |
| 2010-04-12 | 13693.729 |
| 2010-04-13 | 13707.224 |
| 2010-04-14 | 13875.193 |
| 2010-04-15 | 13883.633 |
| 2010-04-16 | 13667.209 |
| 2010-04-17 | 13704.462 |
| 2010-04-20 | 13831.421 |
| 2010-04-21 | 13830.144 |
| 2010-04-22 | 13885.063 |
| 2010-04-23 | 13990.612 |
| 2010-04-26 | 13935.594 |
| 2010-04-27 | 13605.716 |
| 2010-04-28 | 13688.237 |
| 2010-04-29 | 13866.775 |
| 2010-04-30 | 13623.24 |
| 2010-05-03 | 13801.102 |
| 2010-05-04 | 13455.704 |
| 2010-05-05 | 13342.994 |
| 2010-05-06 | 12899.93 |
| 2010-05-07 | 12678.098 |
| 2010-05-10 | 13254.132 |
| 2010-05-11 | 13228.57 |
| 2010-05-12 | 13439.318 |
| 2010-05-13 | 13288.619 |
| 2010-05-14 | 13027.587 |
| 2010-05-15 | 13037.417 |
| 2010-05-16 | 12847.115 |
| 2010-05-17 | 12762.934 |
| 2010-05-18 | 12247.177 |
| 2010-05-19 | 12433.41 |
| 2010-05-24 | 12281.478 |
| 2010-05-25 | 12279.918 |
| 2010-05-26 | 12240.642 |
| 2010-05-27 | 12662.366 |
| 2010-05-28 | 12509.67 |
| 2010-06-01 | 12281.096 |
| 2010-06-02 | 12602.97 |
| 2010-06-03 | 12671.387 |
| 2010-06-04 | 12215.758 |
| 2010-06-07 | 12028.611 |
| 2010-06-08 | 12136.332 |
| 2010-06-09 | 12085.617 |
| 2010-06-10 | 12447.067 |
| 2010-06-11 | 12521.48 |
| 2010-06-14 | 12516.642 |
| 2010-06-15 | 12813.246 |
| 2010-06-16 | 12795.718 |
| 2010-06-17 | 12804.924 |
| 2010-06-18 | 12818.062 |
| 2010-06-21 | 12758.261 |
| 2010-06-22 | 12543.998 |
| 2010-06-23 | 12509.992 |
| 2010-06-24 | 12289.308 |
| 2010-06-25 | 12366.932 |
| 2010-06-28 | 12335.95 |
| 2010-06-29 | 11935.764 |
| 2010-06-30 | 11819.711 |
| 2010-07-01 | 11773.205 |
| 2010-07-02 | 11706.462 |
| 2010-07-06 | 11739.053 |
| 2010-07-07 | 12114.184 |
| 2010-07-08 | 12232.276 |
| 2010-07-09 | 12333.729 |
| 2010-07-12 | 12320.354 |
| 2010-07-13 | 12538.535 |
| 2010-07-14 | 12531.733 |
| 2010-07-15 | 12533.239 |
| 2010-07-16 | 12163.753 |
| 2010-07-19 | 12234.689 |
| 2010-07-20 | 12389.336 |
| 2010-07-21 | 12225.441 |
| 2010-07-22 | 12519.122 |
| 2010-07-23 | 12647.576 |
| 2010-07-26 | 12804.264 |
| 2010-07-27 | 12771.804 |
| 2010-07-28 | 12668.331 |
| 2010-07-29 | 12619.974 |
| 2010-07-30 | 12630.914 |
| 2010-08-02 | 12876.006 |
| 2010-08-03 | 12803.957 |
| 2010-08-04 | 12895.828 |
| 2010-08-05 | 12863.358 |
| 2010-08-06 | 12816.42 |
| 2010-08-09 | 12895.305 |
| 2010-08-10 | 12790.503 |
| 2010-08-11 | 12412.574 |
| 2010-08-12 | 12349.085 |
| 2010-08-13 | 12293.991 |
| 2010-08-16 | 12307.805 |
| 2010-08-17 | 12468.454 |
| 2010-08-18 | 12491.023 |
| 2010-08-19 | 12272.555 |
| 2010-08-20 | 12237.85 |
| 2010-08-23 | 12176.061 |
| 2010-08-24 | 12000.224 |
| 2010-08-25 | 12055.264 |
| 2010-08-26 | 11964.135 |
| 2010-08-27 | 12100 |
| 2010-08-30 | 11989.812 |
| 2010-08-31 | 11994.795 |
| 2010-09-01 | 12348.541 |
| 2010-09-02 | 12470.118 |
| 2010-09-03 | 12636.601 |
| 2010-09-07 | 12401.762 |
| 2010-09-08 | 12559.113 |
| 2010-09-09 | 12610.568 |
| 2010-09-10 | 12667.744 |
| 2010-09-13 | 12827.395 |
| 2010-09-14 | 12817.817 |
| 2010-09-15 | 12863.213 |
| 2010-09-16 | 12850.279 |
| 2010-09-17 | 12870.765 |
| 2010-09-20 | 13079.179 |
| 2010-09-21 | 13035.352 |
| 2010-09-22 | 12964.979 |
| 2010-09-23 | 12858.593 |
| 2010-09-24 | 13144.713 |
| 2010-09-27 | 13081.38 |
| 2010-09-28 | 13154.335 |
| 2010-09-29 | 13132.748 |
| 2010-09-30 | 13099.077 |
| 2010-10-01 | 13139.01 |
| 2010-10-04 | 13028.26 |
| 2010-10-05 | 13302.761 |
| 2010-10-06 | 13277.849 |
| 2010-10-07 | 13259.238 |
| 2010-10-08 | 13355.131 |
| 2010-10-09 | 13359.92 |
| 2010-10-10 | 13412.073 |
| 2010-10-11 | 13519.72 |
| 2010-10-12 | 13469.33 |
| 2010-10-13 | 13495.342 |
| 2010-10-18 | 13589.994 |
| 2010-10-19 | 13364.371 |
| 2010-10-20 | 13508.652 |
| 2010-10-21 | 13521.407 |
| 2010-10-22 | 13566.584 |
| 2010-10-25 | 13606.82 |
| 2010-10-26 | 13610.694 |
| 2010-10-27 | 13575.378 |
| 2010-10-28 | 13581.287 |
| 2010-10-29 | 13592.323 |
| 2010-11-01 | 13590.698 |
| 2010-11-02 | 13714.379 |
| 2010-11-03 | 13760.973 |
| 2010-11-04 | 14026.774 |
| 2010-11-05 | 14085.531 |
| 2010-11-08 | 14064.382 |
| 2010-11-09 | 13944.596 |
| 2010-11-10 | 14018.746 |
| 2010-11-11 | 13968.127 |
| 2010-11-12 | 13788.475 |
| 2010-11-15 | 13774.844 |
| 2010-11-16 | 13544.725 |
| 2010-11-17 | 13558.519 |
| 2010-11-18 | 13686.312 |
| 2010-11-19 | 13813.659 |
| 2010-11-22 | 13810.722 |
| 2010-11-23 | 13622.051 |
| 2010-11-24 | 13839.355 |
| 2010-11-26 | 13746.417 |
| 2010-11-29 | 13724.475 |
| 2010-11-30 | 13643.134 |
| 2010-12-01 | 13974.333 |
| 2010-12-02 | 14143.117 |
| 2010-12-03 | 14193.167 |
| 2010-12-06 | 14189.128 |
| 2010-12-07 | 14200.743 |
| 2010-12-08 | 14233.687 |
| 2010-12-09 | 14287.678 |
| 2010-12-10 | 14306.061 |
| 2010-12-13 | 14371.972 |
| 2010-12-14 | 14376.262 |
| 2010-12-15 | 14298.387 |
| 2010-12-16 | 14391.512 |
| 2010-12-17 | 14412.492 |
| 2010-12-20 | 14384.918 |
| 2010-12-21 | 14399.245 |
| 2010-12-22 | 14406.861 |
| 2010-12-23 | 14414.477 |
| 2010-12-27 | 14587.848 |
| 2010-12-28 | 14589.594 |
| 2010-12-29 | 14613.708 |
| 2010-12-30 | 14598.971 |
| 2010-12-31 | 14583.983 |
| 2011-01-03 | 14612.453 |
| 2011-01-04 | 14564.182 |
| 2011-01-05 | 14650.326 |
| 2011-01-06 | 14619.911 |
| 2011-01-07 | 14592.922 |
| 2011-01-10 | 14587.615 |
| 2011-01-11 | 14645.581 |
| 2011-01-12 | 14770.864 |
| 2011-01-13 | 14747.777 |
| 2011-01-14 | 14852.567 |
| 2011-01-18 | 14879.977 |
| 2011-01-19 | 14691.583 |
| 2011-01-20 | 14646.154 |
| 2011-01-21 | 14660.789 |
| 2011-01-24 | 14753.96 |
| 2011-01-25 | 14756.9 |
| 2011-01-26 | 14848.135 |
| 2011-01-27 | 14886.549 |
| 2011-01-28 | 14609.599 |
| 2011-01-31 | 14718.691 |
| 2011-02-01 | 14894.52 |
| 2011-02-02 | 14856.047 |
| 2011-02-03 | 14893.251 |
| 2011-02-04 | 14862.404 |
| 2011-02-07 | 15035.429 |
| 2011-02-08 | 15147.639 |
| 2011-02-09 | 15053.348 |
| 2011-02-10 | 15074.612 |
| 2011-02-11 | 15171.606 |
| 2011-02-14 | 15217.382 |
| 2011-02-15 | 15160.205 |
| 2011-02-16 | 15260.996 |
| 2011-02-17 | 15313.978 |
| 2011-02-18 | 15334.618 |
| 2011-02-22 | 15000.538 |
| 2011-02-23 | 14883.711 |
| 2011-02-24 | 14882.452 |
| 2011-02-25 | 15066.717 |
| 2011-02-28 | 15135.446 |
| 2011-03-01 | 14747.639 |
| 2011-03-02 | 14782.001 |
| 2011-03-03 | 15038.761 |
| 2011-03-04 | 14934.779 |
| 2011-03-07 | 14791.066 |
| 2011-03-08 | 14928.25 |
| 2011-03-09 | 14898.979 |
| 2011-03-10 | 14609.624 |
| 2011-03-11 | 14707.503 |
| 2011-03-12 | 14619.168 |
| 2011-03-13 | 14465.666 |
| 2011-03-14 | 14214.594 |
| 2011-03-15 | 14377.651 |
| 2011-03-16 | 14444.618 |
| 2011-03-21 | 14677.38 |
| 2011-03-22 | 14552.307 |
| 2011-03-23 | 14661.946 |
| 2011-03-24 | 14800.312 |
| 2011-03-25 | 14858.502 |
| 2011-03-28 | 14810.75 |
| 2011-03-29 | 14915.819 |
| 2011-03-30 | 15033.915 |
| 2011-03-31 | 15020.312 |
| 2011-04-01 | 15001.702 |
| 2011-04-04 | 15011.449 |
| 2011-04-05 | 15021.345 |
| 2011-04-06 | 15046.132 |
| 2011-04-07 | 15013.82 |
| 2011-04-08 | 14941.587 |
| 2011-04-11 | 14884.701 |
| 2011-04-12 | 14759.232 |
| 2011-04-13 | 14773.52 |
| 2011-04-14 | 14776.97 |
| 2011-04-15 | 14843.859 |
| 2011-04-19 | 14745.135 |
| 2011-04-20 | 14959.325 |
| 2011-04-21 | 15044.936 |
| 2011-04-25 | 15024.361 |
| 2011-04-26 | 15157.143 |
| 2011-04-27 | 15251.199 |
| 2011-04-28 | 15301.778 |
| 2011-04-29 | 15341.35 |
| 2011-05-02 | 15221.758 |
| 2011-05-03 | 15142.005 |
| 2011-05-04 | 15025.91 |
| 2011-05-05 | 14903.62 |
| 2011-05-06 | 14965.623 |
| 2011-05-09 | 15047.146 |
| 2011-05-10 | 15177.989 |
| 2011-05-11 | 15002.598 |
| 2011-05-12 | 15076.378 |
| 2011-05-13 | 14944.555 |
| 2011-05-16 | 14831.62 |
| 2011-05-17 | 14811.542 |
| 2011-05-18 | 14963.706 |
| 2011-05-19 | 14997.226 |
| 2011-05-20 | 14889.936 |
| 2011-05-23 | 14698.67 |
| 2011-05-24 | 14680.941 |
| 2011-05-25 | 14746.484 |
| 2011-05-26 | 14825.468 |
| 2011-05-27 | 14895.551 |
| 2011-05-31 | 15050.464 |
| 2011-06-01 | 14866.651 |
| 2011-06-02 | 14698.041 |
| 2011-06-03 | 14544.987 |
| 2011-06-06 | 14369.46 |
| 2011-06-07 | 14367.636 |
| 2011-06-08 | 14287.533 |
| 2011-06-09 | 14391.658 |
| 2011-06-10 | 14191.487 |
| 2011-06-13 | 14186.731 |
| 2011-06-14 | 14378.824 |
| 2011-06-15 | 14134.162 |
| 2011-06-16 | 14148.282 |
| 2011-06-17 | 14181.743 |
| 2011-06-20 | 14264.587 |
| 2011-06-21 | 14480.734 |
| 2011-06-22 | 14393.556 |
| 2011-06-23 | 14368.732 |
| 2011-06-24 | 14215.678 |
| 2011-06-27 | 14339.205 |
| 2011-06-28 | 14530.466 |
| 2011-06-29 | 14648.141 |
| 2011-06-30 | 14787.772 |
| 2011-07-01 | 14989.003 |
| 2011-07-05 | 14980.406 |
| 2011-07-06 | 15005.777 |
| 2011-07-07 | 15171.055 |
| 2011-07-08 | 15073.344 |
| 2011-07-11 | 14786.049 |
| 2011-07-12 | 14780.233 |
| 2011-07-13 | 14721.906 |
| 2011-07-14 | 14658.669 |
| 2011-07-15 | 14751.143 |
| 2011-07-18 | 14611.657 |
| 2011-07-19 | 14861.929 |
| 2011-07-20 | 14783.71 |
| 2011-07-21 | 15034.635 |
| 2011-07-25 | 14955.025 |
| 2011-07-26 | 14885.593 |
| 2011-07-27 | 14560.758 |
| 2011-07-28 | 14516.855 |
| 2011-07-29 | 14436.128 |
| 2011-08-01 | 14339.26 |
| 2011-08-02 | 13956.71 |
| 2011-08-17 | 13211.185 |
| 2011-08-18 | 12596.504 |
| 2011-08-19 | 12400.496 |
| 2011-08-22 | 12392.521 |
| 2011-08-23 | 12835.812 |
| 2011-08-24 | 13004.954 |
| 2011-08-25 | 12782.405 |
| 2011-08-30 | 13448.78 |
| 2011-08-31 | 13508.134 |
| 2011-09-01 | 13307.417 |
| 2011-09-02 | 12956.942 |
| 2011-09-06 | 12864.767 |
| 2011-09-07 | 13256.966 |
| 2011-09-09 | 12756.552 |
| 2011-09-12 | 12841.834 |
| 2011-09-13 | 12976.655 |
| 2011-09-14 | 13159.881 |
| 2011-09-15 | 13373.312 |
| 2011-09-16 | 13430.803 |
| 2011-09-19 | 13296.632 |
| 2011-09-20 | 13239.634 |
| 2011-09-21 | 12845.243 |
| 2011-09-22 | 12423.638 |
| 2011-09-26 | 12790.606 |
| 2011-09-27 | 12947.038 |
| 2011-09-28 | 12641.234 |
| 2011-09-29 | 12741.487 |
| 2011-10-03 | 12046.952 |
| 2011-10-04 | 12368.716 |
| 2011-10-05 | 12592.144 |
| 2011-10-06 | 12840.224 |
| 2011-10-07 | 12704.799 |
| 2011-10-11 | 13161.494 |
| 2011-10-12 | 13303.469 |
| 2011-10-13 | 13275.326 |
| 2011-10-14 | 13509.277 |
| 2011-10-18 | 13513.304 |
| 2011-10-20 | 13385.605 |
| 2011-10-21 | 13641.854 |
| 2011-10-24 | 13864.64 |
| 2011-10-25 | 13573.048 |
| 2011-10-26 | 13727.228 |
| 2011-10-27 | 14213.842 |
| 2011-10-31 | 13867.457 |
| 2011-11-01 | 13479.406 |
| 2011-11-02 | 13709.052 |
| 2011-11-03 | 13972.871 |
| 2011-11-07 | 13962.37 |
| 2011-11-08 | 14121.994 |
| 2011-11-09 | 13587.811 |
| 2011-11-10 | 13696.341 |
| 2011-11-11 | 13968.757 |
| 2011-11-14 | 13838.005 |
| 2011-11-15 | 13912.551 |
| 2011-11-17 | 13458.563 |
| 2011-11-18 | 13452.387 |
| 2011-11-21 | 13200.867 |
| 2011-11-22 | 13140.083 |
| 2011-11-28 | 13187.21 |
| 2011-11-29 | 13206.033 |
| 2011-11-30 | 13784.618 |
| 2011-12-01 | 13787.755 |
| 2011-12-02 | 13796.373 |
| 2011-12-03 | 13951.539 |
| 2011-12-04 | 13971.864 |
| 2011-12-05 | 13659.285 |
| 2011-12-06 | 13908.452 |
| 2011-12-12 | 13555.971 |
| 2011-12-13 | 13393.821 |
| 2011-12-14 | 13448.933 |
| 2011-12-19 | 13339.132 |
| 2011-12-20 | 13746.018 |
| 2011-12-23 | 14001.008 |
| 2012-01-03 | 14057.707 |
| 2012-01-04 | 14048.024 |
| 2012-01-05 | 14102.632 |
| 2012-01-06 | 14070.77 |
| 2012-01-09 | 14105.278 |
| 2012-01-10 | 14241.713 |
| 2012-01-11 | 14259.429 |
| 2012-01-12 | 14298.914 |
| 2012-01-13 | 14226.213 |
| 2012-01-17 | 14275.349 |
| 2012-01-18 | 14446.124 |
| 2012-01-19 | 14522.186 |
| 2012-01-20 | 14527.846 |
| 2012-01-23 | 14531.269 |
| 2012-01-24 | 14537.276 |
| 2012-01-25 | 14668.492 |
| 2012-01-27 | 14587.725 |
| 2012-01-30 | 14538.925 |
| 2012-01-31 | 14533.065 |
| 2012-02-01 | 14627.139 |
| 2012-02-06 | 14873.406 |
| 2012-02-07 | 14895.561 |
| 2012-02-08 | 14925.338 |
| 2012-02-09 | 14945.58 |
| 2012-02-10 | 14832.348 |
| 2012-02-13 | 14941.795 |
| 2012-02-14 | 14923.916 |
| 2012-02-15 | 14848.345 |
| 2012-02-16 | 15032.13 |
| 2012-02-17 | 15056.292 |
| 2012-02-28 | 15140.918 |
| 2012-02-29 | 15056.324 |
| 2012-03-01 | 15039.352 |
| 2012-03-05 | 14913.795 |
| 2012-03-06 | 14671.616 |
| 2012-03-07 | 14785.416 |
| 2012-03-08 | 14931.612 |
| 2012-03-12 | 14993 |
| 2012-03-13 | 15263.207 |
| 2012-03-14 | 15222.032 |
| 2012-03-15 | 15319.354 |
| 2012-03-16 | 15330.862 |
| 2012-03-19 | 15398.082 |
| 2012-03-20 | 15336.299 |
| 2012-03-21 | 15318.846 |
| 2012-03-22 | 15201.787 |
| 2012-03-23 | 15261.64 |
| 2012-03-27 | 15424.376 |
| 2012-03-28 | 15343.293 |
| 2012-03-29 | 15316.407 |
| 2012-03-30 | 15363.133 |
| 2012-04-03 | 15378.384 |
| 2012-04-04 | 15205.958 |
| 2012-04-05 | 15197.455 |
| 2012-04-10 | 14737.759 |
| 2012-04-11 | 14863.082 |
| 2012-04-12 | 15077.738 |
| 2012-04-13 | 14895.629 |
| 2012-04-18 | 15044.643 |
| 2012-04-19 | 14967.291 |
| 2012-04-20 | 14988.51 |
| 2012-04-23 | 14846.52 |
| 2012-04-25 | 15103.839 |
| 2012-04-27 | 15265.558 |
| 2012-05-01 | 15287.833 |
| 2012-05-02 | 15263.886 |
| 2012-05-03 | 15121.46 |
| 2012-05-04 | 14880.099 |
| 2012-05-07 | 14888.012 |
| 2012-05-08 | 14823.941 |
| 2012-05-10 | 14768.145 |
| 2012-05-11 | 14726.228 |
| 2012-05-14 | 14554.915 |
| 2012-05-15 | 14479.274 |
| 2012-05-16 | 14409.993 |
| 2012-05-17 | 14166.653 |
| 2012-05-23 | 14330.25 |
| 2012-05-24 | 14347.661 |
| 2012-05-25 | 14324.419 |
| 2012-05-29 | 14488.72 |
| 2012-05-30 | 14264.667 |
| 2012-05-31 | 14231.595 |
| 2012-06-04 | 14253.532 |
| 2012-06-05 | 13972.349 |
| 2012-06-06 | 14294.774 |
| 2012-06-07 | 14275.263 |
| 2012-06-08 | 14395.389 |
| 2012-06-11 | 14192.343 |
| 2012-06-12 | 14353.152 |
| 2012-06-13 | 14238.533 |
| 2012-06-14 | 14384.342 |
| 2012-06-15 | 14532.776 |
| 2012-06-18 | 14566.508 |
| 2012-06-19 | 14725.574 |
| 2012-06-20 | 14703.998 |
| 2012-06-21 | 14372.393 |
| 2012-06-22 | 14482.582 |
| 2012-06-23 | 14323.579 |
| 2012-06-24 | 14454.037 |
| 2012-06-25 | 14425.367 |
| 2012-06-26 | 14789.853 |
| 2012-07-10 | 14623.212 |
| 2012-07-11 | 14612.188 |
| 2012-07-12 | 14544.687 |
| 2012-07-16 | 14733.394 |
| 2012-07-17 | 14834.61 |
| 2012-07-18 | 14931.836 |
| 2012-07-19 | 14965.239 |
| 2012-07-20 | 14813.259 |
| 2012-07-21 | 14669.051 |
| 2012-07-22 | 14527.212 |
| 2012-07-23 | 14525.632 |
| 2012-07-24 | 14743.514 |
| 2012-07-25 | 15020.512 |
| 2012-07-26 | 15002.621 |
| 2012-07-27 | 14930.268 |
| 2012-08-01 | 14773.877 |
| 2012-08-02 | 14671.837 |
| 2012-08-07 | 15087.292 |
| 2012-08-08 | 15089.338 |
| 2012-08-09 | 15103.452 |
| 2012-08-10 | 15129.644 |
| 2012-08-20 | 15275.482 |
| 2012-08-21 | 15227.902 |
| 2012-08-22 | 15226.301 |
| 2012-08-23 | 15109.775 |
| 2012-08-24 | 15196.854 |
| 2012-08-29 | 15211.857 |
| 2012-08-30 | 15092.148 |
| 2012-08-31 | 15168.524 |
| 2012-09-04 | 15113.616 |
| 2012-09-05 | 15102.939 |
| 2012-09-06 | 15404.182 |
| 2012-09-10 | 15381.83 |
| 2012-09-11 | 15427.08 |
| 2012-09-12 | 15469.058 |
| 2012-09-13 | 15704.17 |
| 2012-09-14 | 15793.661 |
| 2012-09-17 | 15725.772 |
| 2012-09-18 | 15698.369 |
| 2012-09-19 | 15722.058 |
| 2012-09-20 | 15693.668 |
| 2012-09-21 | 15700.838 |
| 2012-09-25 | 15479.57 |
| 2012-09-26 | 15391.129 |
| 2012-09-27 | 15540.681 |
| 2012-10-01 | 15516.608 |
| 2012-10-02 | 15533.504 |
| 2012-10-03 | 15585.676 |
| 2012-10-04 | 15697.325 |
| 2012-10-09 | 15474.161 |
| 2012-10-10 | 15387.589 |
| 2012-10-11 | 15405.185 |
| 2012-10-12 | 15350.935 |
| 2012-10-15 | 15469.684 |
| 2012-10-16 | 15621.846 |
| 2012-10-17 | 15694.485 |
| 2012-10-18 | 15650.011 |
| 2012-10-19 | 15394.082 |
| 2012-10-22 | 15340.84 |
| 2012-10-23 | 15197.898 |
| 2012-10-24 | 15162.15 |
| 2012-10-25 | 15203.331 |
| 2012-10-26 | 15182.566 |
| 2012-10-31 | 15201.891 |
| 2012-11-01 | 15450.504 |
| 2012-11-05 | 15332.533 |
| 2012-11-06 | 15450.876 |
| 2012-11-07 | 15094.648 |
| 2012-11-12 | 14921.962 |
| 2012-11-13 | 14858.211 |
| 2012-11-14 | 14642.534 |
| 2012-11-15 | 14605.54 |
| 2012-11-16 | 14696.019 |
| 2012-11-19 | 14984.587 |
| 2012-11-20 | 14999.879 |
| 2012-11-26 | 15211.047 |
| 2012-11-27 | 15146.355 |
| 2012-11-28 | 15263.509 |
| 2012-11-29 | 15343.421 |
| 2012-11-30 | 15351.764 |
| 2012-12-03 | 15324.371 |
| 2012-12-04 | 15299.428 |
| 2012-12-05 | 15315.611 |
| 2012-12-06 | 15360.21 |
| 2012-12-07 | 15402.944 |
| 2012-12-11 | 15519.398 |
| 2012-12-12 | 15509.726 |
| 2012-12-13 | 15418.028 |
| 2012-12-17 | 15535.239 |
| 2012-12-18 | 15721.267 |
| 2012-12-19 | 15632.95 |
| 2013-01-02 | 15898.1 |
| 2013-01-03 | 15879.68 |
| 2013-01-04 | 15970.218 |
| 2013-01-10 | 16042.564 |
| 2013-01-11 | 16045.365 |
| 2013-01-14 | 16035.535 |
| 2013-01-17 | 16152.462 |
| 2013-01-18 | 16202.161 |
| 2013-01-22 | 16284.698 |
| 2013-01-23 | 16301.02 |
| 2013-01-24 | 16316.649 |
| 2013-01-25 | 16413.182 |
| 2013-01-28 | 16391.827 |
| 2013-01-29 | 16444.585 |
| 2013-01-30 | 16371.009 |
| 2013-01-31 | 16356.951 |
| 2013-02-01 | 16382.827 |
| 2013-02-05 | 16356.673 |
| 2013-02-06 | 16377.885 |
| 2013-02-07 | 16343.785 |
| 2013-02-11 | 16429.107 |
| 2013-02-12 | 16459.24 |
| 2013-02-13 | 16475.982 |
| 2013-02-14 | 16495.749 |
| 2013-02-15 | 16475.316 |
| 2013-02-16 | 16591.765 |
| 2013-02-20 | 16369.488 |
| 2013-02-21 | 16254.936 |
| 2013-02-22 | 16401.456 |
| 2013-02-25 | 16106.58 |
| 2013-02-26 | 16200.843 |
| 2013-02-27 | 16405.034 |
| 2013-02-28 | 16397.745 |
| 2013-03-01 | 16390.325 |
| 2013-03-04 | 16467.224 |
| 2013-03-05 | 16625.715 |
| 2013-03-06 | 16643.733 |
| 2013-03-07 | 16685.056 |
| 2013-03-08 | 16768.386 |
| 2013-03-11 | 16815.037 |
| 2013-03-12 | 16775.422 |
| 2013-03-13 | 16803.839 |
| 2013-03-14 | 16901.159 |
| 2013-03-15 | 16871.361 |
| 2013-03-18 | 16781.087 |
| 2013-03-19 | 16735.377 |
| 2013-03-20 | 16861.288 |
| 2013-03-21 | 16727.033 |
| 2013-03-22 | 16833.362 |
| 2013-03-25 | 16785.382 |
| 2013-03-26 | 16906.497 |
| 2013-03-27 | 16904.411 |
| 2013-03-28 | 16973.19 |
| 2013-04-02 | 16951.813 |
| 2013-04-03 | 16753.162 |
| 2013-04-04 | 16825.76 |
| 2013-04-05 | 16763.737 |
| 2013-04-08 | 16881.948 |
| 2013-04-09 | 16931.81 |
| 2013-04-10 | 17141.096 |
| 2013-04-11 | 17201.103 |
| 2013-04-12 | 17152.571 |
| 2013-04-16 | 16977.455 |
| 2013-04-17 | 16731.748 |
| 2013-04-18 | 16618.245 |
| 2013-04-22 | 16853.716 |
| 2013-04-23 | 17037.769 |
| 2013-04-24 | 17050.267 |
| 2013-04-25 | 17129.017 |
| 2013-04-26 | 17090.692 |
| 2013-04-29 | 17206.958 |
| 2013-04-30 | 17263.32 |
| 2013-05-01 | 17045.327 |
| 2013-05-03 | 17401.753 |
| 2013-05-06 | 17445.078 |
| 2013-05-07 | 17535.919 |
| 2013-05-08 | 17608.623 |
| 2013-05-09 | 17545.249 |
| 2013-05-10 | 17636.488 |
| 2013-05-13 | 17631.941 |
| 2013-05-14 | 17811.303 |
| 2013-05-15 | 17897.148 |
| 2013-05-16 | 17803.66 |
| 2013-05-17 | 17984.218 |
| 2013-05-20 | 17976.953 |
| 2013-05-21 | 18009.212 |
| 2013-05-22 | 17833.15 |
| 2013-05-23 | 17785.87 |
| 2013-05-24 | 17772.586 |
| 2013-05-28 | 17897.281 |
| 2013-05-29 | 17754.5 |
| 2013-06-03 | 17628.09 |
| 2013-06-04 | 17525.571 |
| 2013-06-05 | 17282.589 |
| 2013-06-06 | 17442.97 |
| 2013-06-07 | 17661.271 |
| 2013-06-10 | 17666.909 |
| 2013-06-11 | 17480.493 |
| 2013-06-12 | 17333.263 |
| 2013-06-13 | 17588.956 |
| 2013-06-14 | 17494.204 |
| 2013-06-17 | 17620.017 |
| 2013-06-18 | 17758.98 |
| 2013-06-19 | 17524.725 |
| 2013-06-20 | 17082.963 |
| 2013-06-21 | 17114.319 |
| 2013-06-24 | 16909.371 |
| 2013-06-25 | 17079.956 |
| 2013-06-26 | 17238.246 |
| 2013-06-27 | 17378.351 |
| 2013-06-28 | 17321.571 |
| 2013-07-01 | 17433.237 |
| 2013-07-08 | 17695.34 |
| 2013-07-09 | 17829.653 |
| 2013-07-10 | 17838.752 |
| 2013-07-11 | 18080.394 |
| 2013-07-12 | 18134.931 |
| 2013-07-15 | 18173.52 |
| 2013-07-16 | 18096.026 |
| 2013-07-17 | 18151.815 |
| 2013-07-18 | 18248.242 |
| 2013-07-19 | 18265.952 |
| 2013-07-22 | 18309.605 |
| 2013-07-23 | 18280.605 |
| 2013-07-24 | 18201.552 |
| 2013-07-25 | 18279.158 |
| 2013-07-26 | 18283.407 |
| 2013-07-29 | 18210.774 |
| 2013-07-30 | 18228.514 |
| 2013-07-31 | 18230.277 |
| 2013-08-01 | 18450.865 |
| 2013-08-02 | 18477.134 |
| 2013-08-06 | 18344.062 |
| 2013-08-07 | 18258.763 |
| 2013-08-08 | 18335.319 |
| 2013-08-15 | 17941.863 |
| 2013-08-16 | 17883.769 |
| 2013-08-19 | 17766.858 |
| 2013-08-20 | 17869.052 |
| 2013-08-21 | 17770.309 |
| 2013-08-22 | 17932.947 |
| 2013-08-23 | 18002.592 |
| 2013-08-26 | 17946.768 |
| 2013-08-27 | 17644.157 |
| 2013-08-28 | 17691.595 |
| 2013-08-29 | 17748.325 |
| 2013-08-30 | 17660.329 |
| 2013-09-04 | 17851.405 |
| 2013-09-05 | 17880.835 |
| 2013-09-06 | 17890.665 |
| 2013-09-09 | 18089.64 |
| 2013-09-10 | 18229.003 |
| 2013-09-11 | 18279.11 |
| 2013-09-12 | 18213.256 |
| 2013-09-13 | 18262.835 |
| 2013-09-16 | 18350.484 |
| 2013-09-17 | 18443.928 |
| 2013-09-18 | 18662.574 |
| 2013-09-19 | 18641.958 |
| 2013-09-20 | 18518.545 |
| 2013-09-23 | 18433.041 |
| 2013-09-24 | 18404.943 |
| 2013-09-26 | 18443.451 |
| 2013-09-27 | 18372.371 |
| 2013-09-30 | 18280.564 |
| 2013-10-01 | 18495.076 |
| 2013-10-02 | 18475.721 |
| 2013-10-03 | 18306.289 |
| 2013-10-07 | 18268.558 |
| 2013-10-08 | 18018.669 |
| 2013-10-09 | 18007.448 |
| 2013-10-10 | 18403.969 |
| 2013-10-11 | 18537.25 |
| 2013-10-15 | 18480.99 |
| 2013-10-16 | 18731.929 |
| 2013-10-17 | 18869.042 |
| 2013-10-18 | 19009.142 |
| 2013-10-21 | 19007.256 |
| 2013-10-22 | 19107.23 |
| 2013-10-23 | 19013.005 |
| 2013-10-24 | 19092.085 |
| 2013-10-25 | 19155.387 |
| 2013-10-28 | 19164.01 |
| 2013-10-29 | 19258.439 |
| 2013-10-30 | 19142.352 |
| 2013-10-31 | 19071.262 |
| 2013-11-01 | 19150.573 |
| 2013-11-11 | 19218.111 |
| 2013-11-12 | 19181.018 |
| 2013-11-13 | 19346.906 |
| 2013-11-14 | 19429.508 |
| 2013-11-15 | 19513.346 |
| 2013-11-19 | 19344.118 |
| 2013-11-20 | 19279.991 |
| 2013-11-21 | 19464.926 |
| 2013-11-22 | 19559.048 |
| 2013-11-25 | 19533.21 |
| 2013-11-26 | 19562.654 |
| 2013-12-02 | 19546.499 |
| 2013-12-03 | 19479.803 |
| 2013-12-05 | 19395.397 |
| 2013-12-06 | 19589.857 |
| 2013-12-09 | 19622.776 |
| 2013-12-10 | 19556.386 |
| 2013-12-11 | 19323.083 |
| 2013-12-12 | 19275.303 |
| 2013-12-13 | 19297.099 |
| 2013-12-16 | 19421.329 |
| 2013-12-18 | 19673.201 |
| 2014-01-06 | 19824.062 |
| 2014-01-07 | 19954.741 |
| 2014-01-09 | 19958.659 |
| 2014-01-10 | 20020.111 |
| 2014-01-14 | 19989.359 |
| 2014-01-15 | 20091.108 |
| 2014-01-16 | 20078.215 |
| 2014-01-17 | 20004.542 |
| 2014-01-23 | 19934.939 |
| 2014-01-24 | 19505.84 |
| 2014-01-27 | 19376.27 |
| 2014-01-28 | 19523.211 |
| 2014-01-29 | 19315.561 |
| 2014-01-30 | 19556.303 |
| 2014-01-31 | 19441.335 |
| 2014-02-03 | 18901.171 |
| 2014-02-04 | 19045.238 |
| 2014-02-06 | 19219.497 |
| 2014-02-07 | 19469.744 |
| 2014-02-10 | 19501.68 |
| 2014-02-11 | 19710.217 |
| 2014-02-12 | 19720.974 |
| 2014-02-14 | 19937.997 |
| 2014-02-18 | 19992.775 |
| 2014-02-20 | 19982.961 |
| 2014-02-21 | 19961.812 |
| 2014-02-24 | 20087.965 |
| 2014-02-25 | 20069.817 |
| 2014-02-26 | 20093.328 |
| 2014-02-27 | 20192.928 |
| 2014-03-03 | 19956.443 |
| 2014-03-04 | 20281.104 |
| 2014-03-05 | 20279.462 |
| 2014-03-06 | 20304.948 |
| 2014-03-07 | 20303.135 |
| 2014-03-10 | 20281.154 |
| 2014-03-11 | 20163.133 |
| 2014-03-12 | 20182.172 |
| 2014-03-13 | 19942.633 |
| 2014-03-14 | 19916.2 |
| 2014-03-17 | 20088.558 |
| 2014-03-18 | 20249.231 |
| 2014-03-20 | 20218.084 |
| 2014-03-21 | 20154.228 |
| 2014-03-25 | 20084.871 |
| 2014-03-26 | 19904.313 |
| 2014-03-27 | 19871.12 |
| 2014-03-28 | 19954.983 |
| 2014-03-31 | 20143.086 |
| 2014-04-01 | 20251.832 |
| 2014-04-03 | 20243.71 |
| 2014-04-07 | 19716.706 |
| 2014-04-08 | 19813.165 |
| 2014-04-10 | 19603.43 |
| 2014-04-11 | 19399.308 |
| 2014-04-14 | 19533.117 |
| 2014-04-15 | 19651.303 |
| 2014-04-17 | 19912.385 |
| 2014-04-23 | 20035.872 |
| 2014-04-24 | 20050.903 |
| 2014-04-25 | 19843.196 |
| 2014-04-28 | 19864.733 |
| 2014-04-29 | 19972.607 |
| 2014-04-30 | 20040.581 |
| 2014-05-01 | 19987.54 |
| 2014-05-06 | 19807.871 |
| 2014-05-08 | 19834.726 |
| 2014-05-09 | 19878.15 |
| 2014-05-12 | 20108.867 |
| 2014-05-15 | 19800.277 |
| 2014-05-16 | 19874.898 |
| 2014-05-20 | 19816.646 |
| 2014-05-21 | 19968.34 |
| 2014-05-22 | 20035.797 |
| 2014-05-23 | 20134.581 |
| 2014-05-27 | 20269.976 |
| 2014-05-28 | 20241.05 |
| 2014-05-29 | 20344.186 |
| 2014-05-30 | 20359.555 |
| 2014-06-03 | 20320.914 |
| 2014-06-04 | 20372.986 |
| 2014-06-05 | 20530.609 |
| 2014-06-06 | 20634.813 |
| 2014-06-10 | 20659.061 |
| 2014-06-11 | 20585.248 |
| 2014-06-12 | 20443.064 |
| 2014-06-13 | 20506.102 |
| 2014-06-16 | 20528.902 |
| 2014-06-17 | 20594.476 |
| 2014-06-18 | 20740.654 |
| 2014-06-19 | 20769.267 |
| 2014-06-20 | 20807.487 |
| 2014-06-23 | 20810.243 |
| 2014-06-24 | 20667.85 |
| 2014-06-30 | 20835.43 |
| 2014-07-02 | 20977.809 |
| 2014-07-03 | 21088.138 |
| 2014-07-07 | 20960.076 |
| 2014-07-08 | 20789.563 |
| 2014-07-09 | 20884.485 |
| 2014-07-11 | 20809.714 |
| 2014-07-17 | 20668.674 |
| 2014-07-18 | 20893.337 |
| 2014-07-21 | 20842.394 |
| 2014-07-23 | 20991.287 |
| 2014-07-24 | 21001.737 |
| 2014-07-28 | 20875.843 |
| 2014-07-29 | 20797.226 |
| 2014-07-30 | 20811.393 |
| 2014-07-31 | 20392.048 |
| 2014-08-01 | 20361.322 |
| 2014-08-04 | 20516.629 |
| 2014-08-05 | 20335.763 |
| 2014-08-07 | 20231.594 |
| 2014-08-08 | 20451.54 |
| 2014-08-11 | 20542.578 |
| 2014-08-12 | 20491.58 |
| 2014-08-13 | 20633.026 |
| 2014-08-15 | 20720.462 |
| 2014-08-16 | 20908.343 |
| 2014-08-17 | 21005.026 |
| 2014-08-21 | 21100.378 |
| 2014-08-22 | 21070.705 |
| 2014-08-25 | 21169.089 |
| 2014-08-26 | 21209.49 |
| 2014-08-27 | 21208.429 |
| 2014-08-29 | 21249.87 |
| 2014-09-02 | 21244.43 |
| 2014-09-03 | 21213.18 |
| 2014-09-04 | 21169.98 |
| 2014-09-05 | 21270.32 |
| 2014-09-08 | 21221.96 |
| 2014-09-11 | 21182.54 |
| 2014-09-12 | 21041.43 |
| 2014-09-15 | 20978.92 |
| 2014-09-18 | 21254.01 |
| 2014-09-23 | 20877 |
| 2014-09-26 | 20885.67 |
| 2014-09-29 | 20842.01 |
| 2014-10-01 | 20476.54 |
| 2014-10-07 | 20350.96 |
| 2014-10-09 | 20234.9 |
| 2014-10-10 | 19975.65 |
| 2014-10-14 | 19707.63 |
| 2014-10-16 | 19682.83 |
| 2014-10-17 | 19900.42 |
| 2014-10-20 | 20089.39 |
| 2014-10-21 | 20483.44 |
| 2014-10-23 | 20563.99 |
| 2014-10-24 | 20690.13 |
| 2014-10-27 | 20654.16 |
| 2014-10-30 | 21005.5 |
| 2014-10-31 | 21256.74 |
| 2014-11-03 | 21260.26 |
| 2014-11-04 | 21176.35 |
| 2014-11-07 | 21381.83 |
| 2014-11-10 | 21447.21 |
| 2014-11-11 | 21462.67 |
| 2014-11-12 | 21468.12 |
| 2014-11-13 | 21456.02 |
| 2014-11-14 | 21467.77 |
| 2014-11-17 | 21461.91 |
| 2014-11-18 | 21572.59 |
| 2014-11-19 | 21526.38 |
| 2014-11-20 | 21592.83 |
| 2014-11-21 | 21696.14 |
| 2014-11-24 | 21778.99 |
| 2014-11-25 | 21761.12 |
| 2014-11-26 | 21826.24 |
| 2014-11-28 | 21731.18 |
| 2014-12-01 | 21522.97 |
| 2014-12-02 | 21665.19 |
| 2014-12-03 | 21765.08 |
| 2014-12-04 | 21733.2 |
| 2014-12-05 | 21775.24 |
| 2014-12-08 | 21581.91 |
| 2014-12-09 | 21616.03 |
| 2014-12-10 | 21244.73 |
| 2014-12-11 | 21338.89 |
| 2014-12-12 | 21009.83 |
| 2014-12-15 | 20858.44 |
| 2014-12-16 | 20703.09 |
| 2014-12-17 | 21158.58 |
| 2014-12-18 | 21633.3 |
| 2014-12-19 | 21727.5 |
| 2014-12-22 | 21811.19 |
| 2014-12-23 | 21857.5 |
| 2014-12-24 | 21867.83 |
| 2014-12-26 | 21949.03 |
| 2014-12-29 | 21977.52 |
| 2014-12-30 | 21876.17 |
| 2014-12-31 | 21669.86 |
| 2015-01-02 | 21665.32 |
| 2015-01-05 | 21269.06 |
| 2015-01-06 | 21060.25 |
| 2015-01-07 | 21301.67 |
| 2015-01-08 | 21672.39 |
| 2015-01-09 | 21497.12 |
| 2015-01-12 | 21330.63 |
| 2015-01-13 | 21280.56 |
| 2015-01-14 | 21164.95 |
| 2015-01-15 | 20953.34 |
| 2015-01-16 | 21244.68 |
| 2015-01-20 | 21258.14 |
| 2015-01-21 | 21352.67 |
| 2015-01-22 | 21685.03 |
| 2015-01-23 | 21588.01 |
| 2015-01-26 | 21685.83 |
| 2015-01-27 | 21435.56 |
| 2015-01-28 | 21135.57 |
| 2015-01-29 | 21329.59 |
| 2015-01-30 | 21060.44 |
| 2015-02-02 | 21310.47 |
| 2015-02-03 | 21624.77 |
| 2015-02-04 | 21536.44 |
| 2015-02-05 | 21774.5 |
| 2015-02-06 | 21705.75 |
| 2015-02-09 | 21602.52 |
| 2015-02-10 | 21813.97 |
| 2015-02-11 | 21807.21 |
| 2015-02-12 | 22022.23 |
| 2015-02-13 | 22120.81 |
| 2015-02-17 | 22152.31 |
| 2015-02-18 | 22161.03 |
| 2015-02-19 | 22141.18 |
| 2015-02-20 | 22278.55 |
| 2015-02-23 | 22260 |
| 2015-02-24 | 22308.64 |
| 2015-02-25 | 22314.56 |
| 2015-02-26 | 22278.23 |
| 2015-02-27 | 22212.34 |
| 2015-03-02 | 22346.25 |
| 2015-03-03 | 22255.79 |
| 2015-03-04 | 22158.52 |
| 2015-03-05 | 22192.84 |
| 2015-03-06 | 21886.43 |
| 2015-03-09 | 21960.7 |
| 2015-03-10 | 21616.91 |
| 2015-03-11 | 21600.88 |
| 2015-03-12 | 21869.63 |
| 2015-03-13 | 21746.76 |
| 2015-03-16 | 22006.56 |
| 2015-03-17 | 21963.93 |
| 2015-03-18 | 22216.6 |
| 2015-03-19 | 22135.81 |
| 2015-03-20 | 22330.89 |
| 2015-03-23 | 22293.02 |
| 2015-03-24 | 22172.2 |
| 2015-03-25 | 21832.16 |
| 2015-03-26 | 21782.91 |
| 2015-03-27 | 21846.79 |
| 2015-03-30 | 22114.56 |
| 2015-03-31 | 21947.91 |
| 2015-04-01 | 21869.06 |
| 2015-04-02 | 21946.62 |
| 2015-04-06 | 22083.16 |
| 2015-04-07 | 22026.57 |
| 2015-04-08 | 22100.57 |
| 2015-04-09 | 22171.29 |
| 2015-04-10 | 22274.8 |
| 2015-04-13 | 22187.13 |
| 2015-04-14 | 22218.84 |
| 2015-04-15 | 22339.09 |
| 2015-04-16 | 22324.91 |
| 2015-04-17 | 22060.79 |
| 2015-04-20 | 22255.62 |
| 2015-04-21 | 22232.14 |
| 2015-04-22 | 22333.7 |
| 2015-04-23 | 22396.19 |
| 2015-04-24 | 22431.18 |
| 2015-04-27 | 22316 |
| 2015-04-28 | 22367.19 |
| 2015-04-29 | 22277.02 |
| 2015-04-30 | 22034.3 |
| 2015-05-01 | 22247.99 |
| 2015-05-04 | 22313.9 |
| 2015-05-05 | 22045.89 |
| 2015-05-06 | 21967.1 |
| 2015-05-07 | 22048.11 |
| 2015-05-08 | 22319.28 |
| 2015-05-11 | 22224.81 |
| 2015-05-12 | 22169.36 |
| 2015-05-13 | 22159.93 |
| 2015-05-14 | 22387.05 |
| 2015-05-15 | 22402.17 |
| 2015-05-18 | 22492.02 |
| 2015-05-19 | 22466.96 |
| 2015-05-20 | 22451.19 |
| 2015-05-21 | 22495.55 |
| 2015-05-22 | 22449.83 |
| 2015-05-26 | 22224.4 |
| 2015-05-27 | 22422.94 |
| 2015-05-28 | 22391.29 |
| 2015-05-29 | 22259.7 |
| 2015-06-01 | 22300.34 |
| 2015-06-02 | 22292.72 |
| 2015-06-03 | 22357.42 |
| 2015-06-04 | 22161.75 |
| 2015-06-05 | 22167.66 |
| 2015-06-08 | 22018.08 |
| 2015-06-09 | 22014.6 |
| 2015-06-10 | 22267.24 |
| 2015-06-11 | 22310.03 |
| 2015-06-12 | 22173.67 |
| 2015-06-15 | 22079.35 |
| 2015-06-16 | 22200.18 |
| 2015-06-17 | 22238.88 |
| 2015-06-18 | 22453.4 |
| 2015-06-19 | 22347.65 |
| 2015-06-22 | 22473.25 |
| 2015-06-23 | 22498.58 |
| 2015-06-24 | 22324.82 |
| 2015-06-25 | 22258.18 |
| 2015-06-26 | 22245.42 |
| 2015-06-29 | 21774.32 |
| 2015-06-30 | 21841.75 |
| 2015-07-01 | 21968.09 |
| 2015-07-02 | 21950.59 |
| 2015-07-06 | 21869.98 |
| 2015-07-07 | 21994.4 |
| 2015-07-08 | 21628.94 |
| 2015-07-09 | 21686.66 |
| 2015-07-10 | 21954.36 |
| 2015-07-13 | 22194.62 |
| 2015-07-14 | 22300.63 |
| 2015-07-15 | 22252.57 |
| 2015-07-16 | 22416.65 |
| 2015-07-17 | 22420.66 |
| 2015-07-20 | 22413.11 |
| 2015-07-21 | 22310.37 |
| 2015-07-22 | 22265.72 |
| 2015-07-23 | 22131.98 |
| 2015-07-24 | 21906.75 |
| 2015-07-27 | 21761.68 |
| 2015-07-28 | 22027.65 |
| 2015-07-29 | 22192.4 |
| 2015-07-30 | 22205.86 |
| 2015-07-31 | 22180.07 |
| 2015-08-03 | 22106.88 |
| 2015-08-04 | 22066.93 |
| 2015-08-05 | 22116.82 |
| 2015-08-06 | 21923.3 |
| 2015-08-07 | 21852.59 |
| 2015-08-10 | 22132.24 |
| 2015-08-11 | 21928.5 |
| 2015-08-12 | 21946.15 |
| 2015-08-13 | 21914.07 |
| 2015-08-14 | 22009.76 |
| 2015-08-17 | 22141.65 |
| 2015-08-18 | 22063.71 |
| 2015-08-19 | 21874.91 |
| 2015-08-20 | 21395.24 |
| 2015-08-21 | 20770.28 |
| 2015-08-24 | 19956.48 |
| 2015-08-25 | 19722.01 |
| 2015-08-26 | 20427.87 |
| 2015-08-27 | 20921.5 |
| 2015-08-28 | 20968.31 |
| 2015-08-31 | 20802.97 |
| 2015-09-01 | 20206.07 |
| 2015-09-02 | 20558.41 |
| 2015-09-03 | 20590.63 |
| 2015-09-04 | 20304.16 |
| 2015-09-08 | 20795.29 |
| 2015-09-09 | 20516.79 |
| 2015-09-10 | 20610.16 |
| 2015-09-11 | 20691.66 |
| 2015-09-14 | 20606.2 |
| 2015-09-15 | 20851.73 |
| 2015-09-16 | 21033.25 |
| 2015-09-17 | 21007.72 |
| 2015-09-18 | 20678.74 |
| 2015-09-21 | 20757.98 |
| 2015-09-22 | 20487.3 |
| 2015-09-23 | 20430.39 |
| 2015-09-24 | 20355.11 |
| 2015-09-25 | 20313.52 |
| 2015-09-28 | 19760.18 |
| 2015-09-29 | 19737.25 |
| 2015-09-30 | 20119.28 |
| 2015-10-01 | 20157.36 |
| 2015-10-02 | 20453.86 |
| 2015-10-05 | 20847.21 |
| 2015-10-06 | 20763.14 |
| 2015-10-07 | 20954.72 |
| 2015-10-08 | 21133.34 |
| 2015-10-09 | 21157.55 |
| 2015-10-12 | 21165.16 |
| 2015-10-13 | 21001.57 |
| 2015-10-14 | 20880.1 |
| 2015-10-15 | 21201.41 |
| 2015-10-16 | 21280.38 |
| 2015-10-19 | 21285.83 |
| 2015-10-20 | 21256.21 |
| 2015-10-21 | 21093.24 |
| 2015-10-22 | 21394.53 |
| 2015-10-23 | 21614.06 |
| 2015-10-26 | 21566.96 |
| 2015-10-27 | 21475.37 |
| 2015-10-28 | 21771.95 |
| 2015-10-29 | 21735.26 |
| 2015-10-30 | 21648.51 |
| 2015-11-02 | 21897.79 |
| 2015-11-03 | 21961.26 |
| 2015-11-04 | 21885.96 |
| 2015-11-05 | 21866.46 |
| 2015-11-06 | 21865.24 |
| 2015-11-09 | 21645.04 |
| 2015-11-10 | 21678.63 |
| 2015-11-11 | 21586.68 |
| 2015-11-12 | 21268.38 |
| 2015-11-13 | 21043.66 |
| 2015-11-16 | 21334.84 |
| 2015-11-17 | 21300.74 |
| 2015-11-18 | 21638 |
| 2015-11-19 | 21606.41 |
| 2015-11-20 | 21681.31 |
| 2015-11-23 | 21673.95 |
| 2015-11-24 | 21719.7 |
| 2015-11-25 | 21741.87 |
| 2015-11-27 | 21761.34 |
| 2015-11-30 | 21658.55 |
| 2015-12-01 | 21866.66 |
| 2015-12-02 | 21627.38 |
| 2015-12-03 | 21298.13 |
| 2015-12-04 | 21678.17 |
| 2015-12-07 | 21489.2 |
| 2015-12-08 | 21365.02 |
| 2015-12-09 | 21208.78 |
| 2015-12-10 | 21254.93 |
| 2015-12-11 | 20823.36 |
| 2015-12-14 | 20871.03 |
| 2015-12-15 | 21099.58 |
| 2015-12-16 | 21412.89 |
| 2015-12-17 | 21100.34 |
| 2015-12-18 | 20754.91 |
| 2015-12-21 | 20911.75 |
| 2015-12-22 | 21100.22 |
| 2015-12-23 | 21379.4 |
| 2015-12-24 | 21354.56 |
| 2015-12-28 | 21296.18 |
| 2015-12-29 | 21509.86 |
| 2015-12-30 | 21350.22 |
| 2015-12-31 | 21167.86 |
| 2016-01-04 | 20841.36 |
| 2016-01-05 | 20879.93 |
| 2016-01-06 | 20593.4 |
| 2016-01-07 | 20089.53 |
| 2016-01-08 | 19867.1 |
| 2016-01-11 | 19848.27 |
| 2016-01-12 | 19972.18 |
| 2016-01-13 | 19440.93 |
| 2016-01-14 | 19755.74 |
| 2016-01-15 | 19335.23 |
| 2016-01-19 | 19286.3 |
| 2016-01-20 | 19077.69 |
| 2016-01-21 | 19172.59 |
| 2016-01-22 | 19592.34 |
| 2016-01-25 | 19261.48 |
| 2016-01-26 | 19563.1 |
| 2016-01-27 | 19335.66 |
| 2016-01-28 | 19434.32 |
| 2016-01-29 | 19926.1 |
| 2016-02-01 | 19917.84 |
| 2016-02-02 | 19524.15 |
| 2016-02-03 | 19606.93 |
| 2016-02-04 | 19655.41 |
| 2016-02-05 | 19244.94 |
| 2016-02-08 | 18921.93 |
| 2016-02-09 | 18883.75 |
| 2016-02-10 | 18890.67 |
| 2016-02-11 | 18656.05 |
| 2016-02-12 | 19026.84 |
| 2016-02-16 | 19370.55 |
| 2016-02-17 | 19707.69 |
| 2016-02-18 | 19618.25 |
| 2016-02-19 | 19624.18 |
| 2016-02-22 | 19913.16 |
| 2016-02-23 | 19676.83 |
| 2016-02-24 | 19779.4 |
| 2016-02-25 | 19998.52 |
| 2016-02-26 | 19996.52 |
| 2016-02-29 | 19864.02 |
| 2016-03-01 | 20325.2 |
| 2016-03-02 | 20435.94 |
| 2016-03-03 | 20538.84 |
| 2016-03-04 | 20609.47 |
| 2016-03-07 | 20659.09 |
| 2016-03-08 | 20379.58 |
| 2016-03-09 | 20479.58 |
| 2016-03-10 | 20452.4 |
| 2016-03-11 | 20802.97 |
| 2016-03-14 | 20772.48 |
| 2016-03-15 | 20694.42 |
| 2016-03-16 | 20836.22 |
| 2016-03-17 | 20998.03 |
| 2016-03-18 | 21096.8 |
| 2016-03-21 | 21109.92 |
| 2016-03-22 | 21100.11 |
| 2016-03-23 | 20914.94 |
| 2016-03-24 | 20914.77 |
| 2016-03-28 | 20927.32 |
| 2016-03-29 | 21152.07 |
| 2016-03-30 | 21238.05 |
| 2016-03-31 | 21224.32 |
| 2016-04-01 | 21340.79 |
| 2016-04-04 | 21249.76 |
| 2016-04-05 | 21036.71 |
| 2016-04-06 | 21265.59 |
| 2016-04-07 | 21012.51 |
| 2016-04-08 | 21079.48 |
| 2016-04-11 | 21019.42 |
| 2016-04-12 | 21228.66 |
| 2016-04-13 | 21472.34 |
| 2016-04-14 | 21466.02 |
| 2016-04-15 | 21456.31 |
| 2016-04-18 | 21599.18 |
| 2016-04-19 | 21671.71 |
| 2016-04-20 | 21698.07 |
| 2016-04-21 | 21584.86 |
| 2016-04-22 | 21619.76 |
| 2016-04-25 | 21573.03 |
| 2016-04-26 | 21635.52 |
| 2016-04-27 | 21682.49 |
| 2016-04-28 | 21482.81 |
| 2016-04-29 | 21377.07 |
| 2016-05-02 | 21542.26 |
| 2016-05-03 | 21317.8 |
| 2016-05-04 | 21194.89 |
| 2016-05-05 | 21177.95 |
| 2016-05-06 | 21255.43 |
| 2016-05-09 | 21271.8 |
| 2016-05-10 | 21529.48 |
| 2016-05-11 | 21320.83 |
| 2016-05-12 | 21304.57 |
| 2016-05-13 | 21129.62 |
| 2016-05-16 | 21337.93 |
| 2016-05-17 | 21132.52 |
| 2016-05-18 | 21127.95 |
| 2016-05-19 | 21057.16 |
| 2016-05-20 | 21217.7 |
| 2016-05-23 | 21174.86 |
| 2016-05-24 | 21469.2 |
| 2016-05-25 | 21613.48 |
| 2016-05-26 | 21601 |
| 2016-05-27 | 21703.09 |
| 2016-05-31 | 21695.66 |
| 2016-06-01 | 21743.47 |
| 2016-06-02 | 21819.2 |
| 2016-06-03 | 21742.74 |
| 2016-06-06 | 21866.47 |
| 2016-06-07 | 21898.99 |
| 2016-06-08 | 21976.29 |
| 2016-06-09 | 21919.4 |
| 2016-06-10 | 21687.33 |
| 2016-06-13 | 21505.48 |
| 2016-06-14 | 21456.4 |
| 2016-06-15 | 21441.57 |
| 2016-06-16 | 21488.93 |
| 2016-06-17 | 21430.69 |
| 2016-06-20 | 21576.65 |
| 2016-06-21 | 21627.45 |
| 2016-06-22 | 21583.88 |
| 2016-06-23 | 21890.49 |
| 2016-06-24 | 21103.02 |
| 2016-06-27 | 20675.1 |
| 2016-06-28 | 21045.53 |
| 2016-06-29 | 21419.5 |
| 2016-06-30 | 21711.72 |
| 2016-07-01 | 21760.52 |
| 2016-07-05 | 21589.23 |
| 2016-07-06 | 21706.28 |
| 2016-07-07 | 21700.02 |
| 2016-07-08 | 22044.53 |
| 2016-07-11 | 22137.77 |
| 2016-07-12 | 22308.83 |
| 2016-07-13 | 22295.2 |
| 2016-07-14 | 22396.45 |
| 2016-07-15 | 22384.12 |
| 2016-07-18 | 22440.92 |
| 2016-07-19 | 22400.38 |
| 2016-07-20 | 22506.32 |
| 2016-07-21 | 22424.38 |
| 2016-07-22 | 22537.87 |
| 2016-07-25 | 22474.63 |
| 2016-07-26 | 22497.08 |
| 2016-07-27 | 22459.17 |
| 2016-07-28 | 22500.88 |
| 2016-07-29 | 22548.74 |
| 2016-08-01 | 22506.93 |
| 2016-08-02 | 22337.86 |
| 2016-08-03 | 22435.21 |
| 2016-08-04 | 22440.81 |
| 2016-08-05 | 22638.2 |
| 2016-08-08 | 22628.11 |
| 2016-08-09 | 22637.85 |
| 2016-08-10 | 22565.91 |
| 2016-08-11 | 22670.03 |
| 2016-08-12 | 22661.88 |
| 2016-08-15 | 22745.61 |
| 2016-08-16 | 22609.62 |
| 2016-08-17 | 22632.06 |
| 2016-08-18 | 22701.87 |
| 2016-08-19 | 22667.38 |
| 2016-08-22 | 22663.92 |
| 2016-08-23 | 22722.21 |
| 2016-08-24 | 22591.66 |
| 2016-08-25 | 22575.59 |
| 2016-08-26 | 22535.66 |
| 2016-08-29 | 22655.42 |
| 2016-08-30 | 22619.62 |
| 2016-08-31 | 22562.78 |
| 2016-09-01 | 22569.74 |
| 2016-09-02 | 22688.81 |
| 2016-09-06 | 22753.79 |
| 2016-09-07 | 22775.96 |
| 2016-09-08 | 22726.8 |
| 2016-09-09 | 22153.04 |
| 2016-09-12 | 22464.33 |
| 2016-09-13 | 22111.99 |
| 2016-09-14 | 22099.06 |
| 2016-09-15 | 22321.06 |
| 2016-09-16 | 22242.45 |
| 2016-09-19 | 22265.81 |
| 2016-09-20 | 22258.39 |
| 2016-09-21 | 22510.57 |
| 2016-09-22 | 22681.52 |
| 2016-09-23 | 22555.37 |
| 2016-09-26 | 22366.88 |
| 2016-09-27 | 22491.14 |
| 2016-09-28 | 22618.99 |
| 2016-09-29 | 22396.58 |
| 2016-09-30 | 22578.7 |
| 2016-10-03 | 22505.15 |
| 2016-10-04 | 22391.41 |
| 2016-10-05 | 22492.53 |
| 2016-10-06 | 22478.35 |
| 2016-10-07 | 22395.24 |
| 2016-10-10 | 22516.42 |
| 2016-10-11 | 22230.16 |
| 2016-10-12 | 22251.43 |
| 2016-10-13 | 22171.92 |
| 2016-10-14 | 22167.29 |
| 2016-10-17 | 22106.24 |
| 2016-10-18 | 22243.91 |
| 2016-10-19 | 22302.88 |
| 2016-10-20 | 22264.91 |
| 2016-10-21 | 22265.67 |
| 2016-10-24 | 22382.06 |
| 2016-10-25 | 22279.12 |
| 2016-10-26 | 22216.9 |
| 2016-10-27 | 22119.39 |
| 2016-10-28 | 22058.88 |
| 2016-10-31 | 22069.35 |
| 2016-11-01 | 21907.32 |
| 2016-11-02 | 21734.46 |
| 2016-11-03 | 21633.54 |
| 2016-11-04 | 21614.14 |
| 2016-11-07 | 22084.22 |
| 2016-11-08 | 22165.78 |
| 2016-11-09 | 22466.72 |
| 2016-11-10 | 22525.95 |
| 2016-11-11 | 22558.52 |
| 2016-11-14 | 22616.67 |
| 2016-11-15 | 22781.57 |
| 2016-11-16 | 22745.18 |
| 2016-11-17 | 22860.23 |
| 2016-11-18 | 22824.84 |
| 2016-11-21 | 22993.06 |
| 2016-11-22 | 23069.58 |
| 2016-11-23 | 23099.71 |
| 2016-11-25 | 23188.75 |
| 2016-11-28 | 23038.61 |
| 2016-11-29 | 23064.6 |
| 2016-11-30 | 23009.36 |
| 2016-12-01 | 22911.62 |
| 2016-12-02 | 22921.26 |
| 2016-12-05 | 23090.38 |
| 2016-12-06 | 23195.66 |
| 2016-12-07 | 23485.54 |
| 2016-12-08 | 23571.62 |
| 2016-12-09 | 23674.37 |
| 2016-12-12 | 23611.32 |
| 2016-12-13 | 23741.95 |
| 2016-12-14 | 23532.87 |
| 2016-12-15 | 23629.99 |
| 2016-12-16 | 23593.81 |
| 2016-12-19 | 23649.52 |
| 2016-12-20 | 23751.87 |
| 2016-12-21 | 23694.61 |
| 2016-12-22 | 23626.51 |
| 2016-12-23 | 23672.08 |
| 2016-12-27 | 23732.56 |
| 2016-12-28 | 23523.59 |
| 2016-12-29 | 23521.71 |
| 2016-12-30 | 23416.82 |